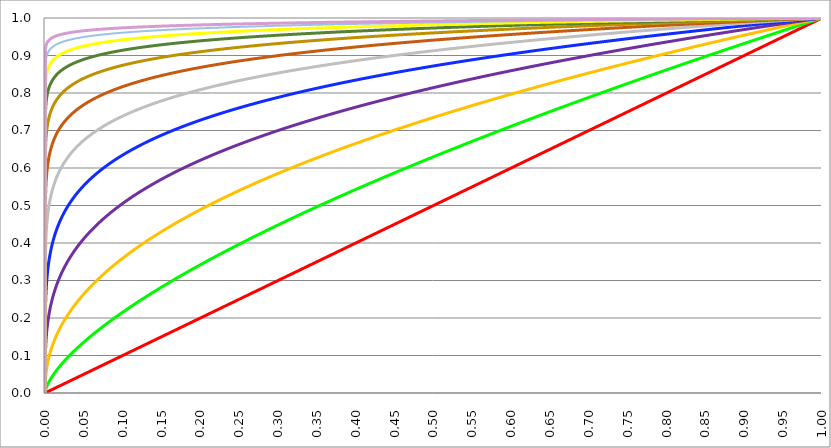
| Category | Series 0 | Series 3 | Series 4 | Series 5 | Series 2 | Series 6 | Series 7 | Series 8 | Series 9 | Series 10 | Series 11 | Series 12 |
|---|---|---|---|---|---|---|---|---|---|---|---|---|
| 0.0 | 0 | 0 | 0 | 0 | 0 | 0 | 0 | 0 | 0 | 0 | 0 | 0 |
| 0.0005 | 0 | 0.006 | 0.034 | 0.105 | 0.223 | 0.368 | 0.513 | 0.641 | 0.743 | 0.821 | 0.877 | 0.916 |
| 0.001 | 0.001 | 0.01 | 0.046 | 0.129 | 0.256 | 0.403 | 0.545 | 0.667 | 0.764 | 0.836 | 0.887 | 0.923 |
| 0.0015 | 0.002 | 0.013 | 0.056 | 0.146 | 0.277 | 0.425 | 0.565 | 0.683 | 0.776 | 0.844 | 0.893 | 0.928 |
| 0.002 | 0.002 | 0.016 | 0.063 | 0.159 | 0.293 | 0.441 | 0.579 | 0.695 | 0.785 | 0.851 | 0.898 | 0.931 |
| 0.0025 | 0.002 | 0.018 | 0.07 | 0.169 | 0.306 | 0.454 | 0.591 | 0.704 | 0.792 | 0.856 | 0.901 | 0.933 |
| 0.003 | 0.003 | 0.021 | 0.076 | 0.179 | 0.317 | 0.465 | 0.6 | 0.712 | 0.797 | 0.86 | 0.904 | 0.935 |
| 0.0035 | 0.004 | 0.023 | 0.081 | 0.187 | 0.327 | 0.475 | 0.609 | 0.718 | 0.802 | 0.863 | 0.907 | 0.937 |
| 0.004 | 0.004 | 0.025 | 0.086 | 0.195 | 0.336 | 0.483 | 0.616 | 0.724 | 0.806 | 0.866 | 0.909 | 0.938 |
| 0.0045 | 0.004 | 0.027 | 0.091 | 0.202 | 0.344 | 0.491 | 0.622 | 0.729 | 0.81 | 0.869 | 0.911 | 0.939 |
| 0.005 | 0.005 | 0.029 | 0.095 | 0.208 | 0.351 | 0.498 | 0.628 | 0.733 | 0.813 | 0.871 | 0.912 | 0.941 |
| 0.0055 | 0.006 | 0.031 | 0.099 | 0.214 | 0.358 | 0.504 | 0.633 | 0.737 | 0.816 | 0.873 | 0.914 | 0.942 |
| 0.006 | 0.006 | 0.033 | 0.103 | 0.22 | 0.364 | 0.51 | 0.638 | 0.741 | 0.819 | 0.875 | 0.915 | 0.943 |
| 0.0065 | 0.006 | 0.035 | 0.107 | 0.225 | 0.37 | 0.515 | 0.643 | 0.745 | 0.822 | 0.877 | 0.916 | 0.943 |
| 0.007 | 0.007 | 0.037 | 0.11 | 0.23 | 0.375 | 0.52 | 0.647 | 0.748 | 0.824 | 0.879 | 0.918 | 0.944 |
| 0.0075 | 0.008 | 0.038 | 0.114 | 0.235 | 0.38 | 0.525 | 0.651 | 0.751 | 0.826 | 0.88 | 0.919 | 0.945 |
| 0.008 | 0.008 | 0.04 | 0.117 | 0.239 | 0.385 | 0.529 | 0.654 | 0.754 | 0.828 | 0.882 | 0.92 | 0.946 |
| 0.0085 | 0.008 | 0.042 | 0.12 | 0.243 | 0.39 | 0.534 | 0.658 | 0.757 | 0.83 | 0.883 | 0.921 | 0.946 |
| 0.009 | 0.009 | 0.043 | 0.123 | 0.248 | 0.394 | 0.538 | 0.661 | 0.759 | 0.832 | 0.885 | 0.922 | 0.947 |
| 0.0095 | 0.01 | 0.045 | 0.126 | 0.252 | 0.399 | 0.542 | 0.664 | 0.761 | 0.834 | 0.886 | 0.922 | 0.948 |
| 0.01 | 0.01 | 0.046 | 0.129 | 0.256 | 0.403 | 0.545 | 0.667 | 0.764 | 0.836 | 0.887 | 0.923 | 0.948 |
| 0.0105 | 0.01 | 0.048 | 0.132 | 0.259 | 0.407 | 0.549 | 0.67 | 0.766 | 0.837 | 0.888 | 0.924 | 0.949 |
| 0.011 | 0.011 | 0.049 | 0.135 | 0.263 | 0.41 | 0.552 | 0.673 | 0.768 | 0.839 | 0.889 | 0.925 | 0.949 |
| 0.0115 | 0.012 | 0.051 | 0.137 | 0.266 | 0.414 | 0.555 | 0.676 | 0.77 | 0.84 | 0.89 | 0.925 | 0.95 |
| 0.012 | 0.012 | 0.052 | 0.14 | 0.27 | 0.417 | 0.559 | 0.678 | 0.772 | 0.841 | 0.891 | 0.926 | 0.95 |
| 0.0125 | 0.012 | 0.054 | 0.143 | 0.273 | 0.421 | 0.562 | 0.681 | 0.774 | 0.843 | 0.892 | 0.927 | 0.951 |
| 0.013 | 0.013 | 0.055 | 0.145 | 0.276 | 0.424 | 0.564 | 0.683 | 0.776 | 0.844 | 0.893 | 0.927 | 0.951 |
| 0.0135 | 0.014 | 0.057 | 0.148 | 0.279 | 0.427 | 0.567 | 0.685 | 0.777 | 0.845 | 0.894 | 0.928 | 0.951 |
| 0.014 | 0.014 | 0.058 | 0.15 | 0.282 | 0.43 | 0.57 | 0.687 | 0.779 | 0.847 | 0.895 | 0.929 | 0.952 |
| 0.0145 | 0.014 | 0.059 | 0.152 | 0.285 | 0.433 | 0.573 | 0.69 | 0.781 | 0.848 | 0.896 | 0.929 | 0.952 |
| 0.015 | 0.015 | 0.061 | 0.155 | 0.288 | 0.436 | 0.575 | 0.692 | 0.782 | 0.849 | 0.897 | 0.93 | 0.953 |
| 0.0155 | 0.016 | 0.062 | 0.157 | 0.291 | 0.439 | 0.578 | 0.694 | 0.784 | 0.85 | 0.897 | 0.93 | 0.953 |
| 0.016 | 0.016 | 0.063 | 0.159 | 0.294 | 0.442 | 0.58 | 0.696 | 0.785 | 0.851 | 0.898 | 0.931 | 0.953 |
| 0.0165 | 0.016 | 0.065 | 0.161 | 0.296 | 0.445 | 0.582 | 0.697 | 0.786 | 0.852 | 0.899 | 0.931 | 0.954 |
| 0.017 | 0.017 | 0.066 | 0.164 | 0.299 | 0.447 | 0.585 | 0.699 | 0.788 | 0.853 | 0.899 | 0.932 | 0.954 |
| 0.0175 | 0.018 | 0.067 | 0.166 | 0.302 | 0.45 | 0.587 | 0.701 | 0.789 | 0.854 | 0.9 | 0.932 | 0.954 |
| 0.018 | 0.018 | 0.069 | 0.168 | 0.304 | 0.452 | 0.589 | 0.703 | 0.79 | 0.855 | 0.901 | 0.933 | 0.955 |
| 0.0185 | 0.018 | 0.07 | 0.17 | 0.307 | 0.455 | 0.591 | 0.704 | 0.792 | 0.856 | 0.901 | 0.933 | 0.955 |
| 0.019 | 0.019 | 0.071 | 0.172 | 0.309 | 0.457 | 0.593 | 0.706 | 0.793 | 0.857 | 0.902 | 0.934 | 0.955 |
| 0.0195 | 0.02 | 0.072 | 0.174 | 0.311 | 0.459 | 0.595 | 0.708 | 0.794 | 0.858 | 0.903 | 0.934 | 0.956 |
| 0.02 | 0.02 | 0.074 | 0.176 | 0.314 | 0.462 | 0.597 | 0.709 | 0.795 | 0.858 | 0.903 | 0.934 | 0.956 |
| 0.0205 | 0.02 | 0.075 | 0.178 | 0.316 | 0.464 | 0.599 | 0.711 | 0.797 | 0.859 | 0.904 | 0.935 | 0.956 |
| 0.021 | 0.021 | 0.076 | 0.18 | 0.318 | 0.466 | 0.601 | 0.712 | 0.798 | 0.86 | 0.904 | 0.935 | 0.956 |
| 0.0215 | 0.022 | 0.077 | 0.181 | 0.321 | 0.468 | 0.603 | 0.714 | 0.799 | 0.861 | 0.905 | 0.936 | 0.957 |
| 0.022 | 0.022 | 0.079 | 0.183 | 0.323 | 0.471 | 0.605 | 0.715 | 0.8 | 0.862 | 0.905 | 0.936 | 0.957 |
| 0.0225 | 0.022 | 0.08 | 0.185 | 0.325 | 0.473 | 0.607 | 0.717 | 0.801 | 0.862 | 0.906 | 0.936 | 0.957 |
| 0.023 | 0.023 | 0.081 | 0.187 | 0.327 | 0.475 | 0.608 | 0.718 | 0.802 | 0.863 | 0.907 | 0.937 | 0.957 |
| 0.0235 | 0.024 | 0.082 | 0.189 | 0.329 | 0.477 | 0.61 | 0.719 | 0.803 | 0.864 | 0.907 | 0.937 | 0.958 |
| 0.024 | 0.024 | 0.083 | 0.191 | 0.331 | 0.479 | 0.612 | 0.721 | 0.804 | 0.865 | 0.908 | 0.937 | 0.958 |
| 0.0245 | 0.024 | 0.084 | 0.192 | 0.333 | 0.481 | 0.614 | 0.722 | 0.805 | 0.865 | 0.908 | 0.938 | 0.958 |
| 0.025 | 0.025 | 0.085 | 0.194 | 0.335 | 0.483 | 0.615 | 0.723 | 0.806 | 0.866 | 0.909 | 0.938 | 0.958 |
| 0.0255 | 0.026 | 0.087 | 0.196 | 0.337 | 0.484 | 0.617 | 0.725 | 0.807 | 0.867 | 0.909 | 0.938 | 0.958 |
| 0.026 | 0.026 | 0.088 | 0.197 | 0.339 | 0.486 | 0.618 | 0.726 | 0.808 | 0.867 | 0.909 | 0.939 | 0.959 |
| 0.0265 | 0.026 | 0.089 | 0.199 | 0.341 | 0.488 | 0.62 | 0.727 | 0.809 | 0.868 | 0.91 | 0.939 | 0.959 |
| 0.027 | 0.027 | 0.09 | 0.201 | 0.343 | 0.49 | 0.621 | 0.728 | 0.809 | 0.869 | 0.91 | 0.939 | 0.959 |
| 0.0275 | 0.028 | 0.091 | 0.202 | 0.345 | 0.492 | 0.623 | 0.729 | 0.81 | 0.869 | 0.911 | 0.94 | 0.959 |
| 0.028 | 0.028 | 0.092 | 0.204 | 0.347 | 0.493 | 0.624 | 0.731 | 0.811 | 0.87 | 0.911 | 0.94 | 0.96 |
| 0.0285 | 0.028 | 0.093 | 0.206 | 0.348 | 0.495 | 0.626 | 0.732 | 0.812 | 0.87 | 0.912 | 0.94 | 0.96 |
| 0.029 | 0.029 | 0.094 | 0.207 | 0.35 | 0.497 | 0.627 | 0.733 | 0.813 | 0.871 | 0.912 | 0.94 | 0.96 |
| 0.0295 | 0.03 | 0.095 | 0.209 | 0.352 | 0.499 | 0.629 | 0.734 | 0.814 | 0.872 | 0.912 | 0.941 | 0.96 |
| 0.03 | 0.03 | 0.097 | 0.21 | 0.354 | 0.5 | 0.63 | 0.735 | 0.814 | 0.872 | 0.913 | 0.941 | 0.96 |
| 0.0305 | 0.03 | 0.098 | 0.212 | 0.356 | 0.502 | 0.632 | 0.736 | 0.815 | 0.873 | 0.913 | 0.941 | 0.96 |
| 0.031 | 0.031 | 0.099 | 0.214 | 0.357 | 0.503 | 0.633 | 0.737 | 0.816 | 0.873 | 0.914 | 0.942 | 0.961 |
| 0.0315 | 0.032 | 0.1 | 0.215 | 0.359 | 0.505 | 0.634 | 0.738 | 0.817 | 0.874 | 0.914 | 0.942 | 0.961 |
| 0.032 | 0.032 | 0.101 | 0.217 | 0.361 | 0.507 | 0.636 | 0.739 | 0.818 | 0.874 | 0.914 | 0.942 | 0.961 |
| 0.0325 | 0.032 | 0.102 | 0.218 | 0.362 | 0.508 | 0.637 | 0.74 | 0.818 | 0.875 | 0.915 | 0.942 | 0.961 |
| 0.033 | 0.033 | 0.103 | 0.22 | 0.364 | 0.51 | 0.638 | 0.741 | 0.819 | 0.875 | 0.915 | 0.943 | 0.961 |
| 0.0335 | 0.034 | 0.104 | 0.221 | 0.366 | 0.511 | 0.639 | 0.742 | 0.82 | 0.876 | 0.915 | 0.943 | 0.961 |
| 0.034 | 0.034 | 0.105 | 0.222 | 0.367 | 0.513 | 0.641 | 0.743 | 0.82 | 0.876 | 0.916 | 0.943 | 0.962 |
| 0.0345 | 0.034 | 0.106 | 0.224 | 0.369 | 0.514 | 0.642 | 0.744 | 0.821 | 0.877 | 0.916 | 0.943 | 0.962 |
| 0.035 | 0.035 | 0.107 | 0.225 | 0.37 | 0.516 | 0.643 | 0.745 | 0.822 | 0.877 | 0.916 | 0.944 | 0.962 |
| 0.0355 | 0.036 | 0.108 | 0.227 | 0.372 | 0.517 | 0.644 | 0.746 | 0.823 | 0.878 | 0.917 | 0.944 | 0.962 |
| 0.036 | 0.036 | 0.109 | 0.228 | 0.373 | 0.519 | 0.645 | 0.747 | 0.823 | 0.878 | 0.917 | 0.944 | 0.962 |
| 0.0365 | 0.036 | 0.11 | 0.23 | 0.375 | 0.52 | 0.647 | 0.748 | 0.824 | 0.879 | 0.917 | 0.944 | 0.962 |
| 0.037 | 0.037 | 0.111 | 0.231 | 0.376 | 0.521 | 0.648 | 0.749 | 0.825 | 0.879 | 0.918 | 0.944 | 0.963 |
| 0.0375 | 0.038 | 0.112 | 0.232 | 0.378 | 0.523 | 0.649 | 0.75 | 0.825 | 0.88 | 0.918 | 0.945 | 0.963 |
| 0.038 | 0.038 | 0.113 | 0.234 | 0.379 | 0.524 | 0.65 | 0.75 | 0.826 | 0.88 | 0.918 | 0.945 | 0.963 |
| 0.0385 | 0.038 | 0.114 | 0.235 | 0.381 | 0.526 | 0.651 | 0.751 | 0.826 | 0.881 | 0.919 | 0.945 | 0.963 |
| 0.039 | 0.039 | 0.115 | 0.236 | 0.382 | 0.527 | 0.652 | 0.752 | 0.827 | 0.881 | 0.919 | 0.945 | 0.963 |
| 0.0395 | 0.04 | 0.116 | 0.238 | 0.384 | 0.528 | 0.653 | 0.753 | 0.828 | 0.882 | 0.919 | 0.946 | 0.963 |
| 0.04 | 0.04 | 0.117 | 0.239 | 0.385 | 0.529 | 0.654 | 0.754 | 0.828 | 0.882 | 0.92 | 0.946 | 0.963 |
| 0.0405 | 0.04 | 0.118 | 0.24 | 0.387 | 0.531 | 0.656 | 0.755 | 0.829 | 0.882 | 0.92 | 0.946 | 0.964 |
| 0.041 | 0.041 | 0.119 | 0.242 | 0.388 | 0.532 | 0.657 | 0.755 | 0.829 | 0.883 | 0.92 | 0.946 | 0.964 |
| 0.0415 | 0.042 | 0.12 | 0.243 | 0.39 | 0.533 | 0.658 | 0.756 | 0.83 | 0.883 | 0.921 | 0.946 | 0.964 |
| 0.042 | 0.042 | 0.121 | 0.244 | 0.391 | 0.535 | 0.659 | 0.757 | 0.831 | 0.884 | 0.921 | 0.947 | 0.964 |
| 0.0425 | 0.042 | 0.122 | 0.246 | 0.392 | 0.536 | 0.66 | 0.758 | 0.831 | 0.884 | 0.921 | 0.947 | 0.964 |
| 0.043 | 0.043 | 0.123 | 0.247 | 0.394 | 0.537 | 0.661 | 0.759 | 0.832 | 0.884 | 0.921 | 0.947 | 0.964 |
| 0.0435 | 0.044 | 0.124 | 0.248 | 0.395 | 0.538 | 0.662 | 0.759 | 0.832 | 0.885 | 0.922 | 0.947 | 0.964 |
| 0.044 | 0.044 | 0.125 | 0.25 | 0.396 | 0.54 | 0.663 | 0.76 | 0.833 | 0.885 | 0.922 | 0.947 | 0.965 |
| 0.0445 | 0.044 | 0.126 | 0.251 | 0.398 | 0.541 | 0.664 | 0.761 | 0.833 | 0.886 | 0.922 | 0.947 | 0.965 |
| 0.045 | 0.045 | 0.127 | 0.252 | 0.399 | 0.542 | 0.665 | 0.762 | 0.834 | 0.886 | 0.923 | 0.948 | 0.965 |
| 0.0455 | 0.046 | 0.127 | 0.253 | 0.4 | 0.543 | 0.666 | 0.762 | 0.835 | 0.886 | 0.923 | 0.948 | 0.965 |
| 0.046 | 0.046 | 0.128 | 0.254 | 0.402 | 0.544 | 0.667 | 0.763 | 0.835 | 0.887 | 0.923 | 0.948 | 0.965 |
| 0.0465 | 0.046 | 0.129 | 0.256 | 0.403 | 0.545 | 0.668 | 0.764 | 0.836 | 0.887 | 0.923 | 0.948 | 0.965 |
| 0.047 | 0.047 | 0.13 | 0.257 | 0.404 | 0.547 | 0.669 | 0.765 | 0.836 | 0.888 | 0.924 | 0.948 | 0.965 |
| 0.0475 | 0.048 | 0.131 | 0.258 | 0.405 | 0.548 | 0.669 | 0.765 | 0.837 | 0.888 | 0.924 | 0.949 | 0.965 |
| 0.048 | 0.048 | 0.132 | 0.259 | 0.407 | 0.549 | 0.67 | 0.766 | 0.837 | 0.888 | 0.924 | 0.949 | 0.966 |
| 0.0485 | 0.048 | 0.133 | 0.261 | 0.408 | 0.55 | 0.671 | 0.767 | 0.838 | 0.889 | 0.924 | 0.949 | 0.966 |
| 0.049 | 0.049 | 0.134 | 0.262 | 0.409 | 0.551 | 0.672 | 0.767 | 0.838 | 0.889 | 0.925 | 0.949 | 0.966 |
| 0.0495 | 0.05 | 0.135 | 0.263 | 0.41 | 0.552 | 0.673 | 0.768 | 0.839 | 0.889 | 0.925 | 0.949 | 0.966 |
| 0.05 | 0.05 | 0.136 | 0.264 | 0.412 | 0.553 | 0.674 | 0.769 | 0.839 | 0.89 | 0.925 | 0.949 | 0.966 |
| 0.0505 | 0.05 | 0.137 | 0.265 | 0.413 | 0.554 | 0.675 | 0.769 | 0.84 | 0.89 | 0.925 | 0.95 | 0.966 |
| 0.051 | 0.051 | 0.138 | 0.266 | 0.414 | 0.556 | 0.676 | 0.77 | 0.84 | 0.89 | 0.926 | 0.95 | 0.966 |
| 0.0515 | 0.052 | 0.138 | 0.268 | 0.415 | 0.557 | 0.677 | 0.771 | 0.841 | 0.891 | 0.926 | 0.95 | 0.966 |
| 0.052 | 0.052 | 0.139 | 0.269 | 0.416 | 0.558 | 0.678 | 0.771 | 0.841 | 0.891 | 0.926 | 0.95 | 0.966 |
| 0.0525 | 0.052 | 0.14 | 0.27 | 0.418 | 0.559 | 0.678 | 0.772 | 0.842 | 0.891 | 0.926 | 0.95 | 0.967 |
| 0.053 | 0.053 | 0.141 | 0.271 | 0.419 | 0.56 | 0.679 | 0.773 | 0.842 | 0.892 | 0.926 | 0.95 | 0.967 |
| 0.0535 | 0.054 | 0.142 | 0.272 | 0.42 | 0.561 | 0.68 | 0.773 | 0.843 | 0.892 | 0.927 | 0.95 | 0.967 |
| 0.054 | 0.054 | 0.143 | 0.273 | 0.421 | 0.562 | 0.681 | 0.774 | 0.843 | 0.892 | 0.927 | 0.951 | 0.967 |
| 0.0545 | 0.054 | 0.144 | 0.274 | 0.422 | 0.563 | 0.682 | 0.775 | 0.843 | 0.893 | 0.927 | 0.951 | 0.967 |
| 0.055 | 0.055 | 0.145 | 0.276 | 0.423 | 0.564 | 0.683 | 0.775 | 0.844 | 0.893 | 0.927 | 0.951 | 0.967 |
| 0.0555 | 0.056 | 0.145 | 0.277 | 0.425 | 0.565 | 0.683 | 0.776 | 0.844 | 0.893 | 0.928 | 0.951 | 0.967 |
| 0.056 | 0.056 | 0.146 | 0.278 | 0.426 | 0.566 | 0.684 | 0.776 | 0.845 | 0.894 | 0.928 | 0.951 | 0.967 |
| 0.0565 | 0.056 | 0.147 | 0.279 | 0.427 | 0.567 | 0.685 | 0.777 | 0.845 | 0.894 | 0.928 | 0.951 | 0.967 |
| 0.057 | 0.057 | 0.148 | 0.28 | 0.428 | 0.568 | 0.686 | 0.778 | 0.846 | 0.894 | 0.928 | 0.952 | 0.967 |
| 0.0575 | 0.058 | 0.149 | 0.281 | 0.429 | 0.569 | 0.687 | 0.778 | 0.846 | 0.895 | 0.928 | 0.952 | 0.968 |
| 0.058 | 0.058 | 0.15 | 0.282 | 0.43 | 0.57 | 0.687 | 0.779 | 0.846 | 0.895 | 0.929 | 0.952 | 0.968 |
| 0.0585 | 0.058 | 0.151 | 0.283 | 0.431 | 0.571 | 0.688 | 0.779 | 0.847 | 0.895 | 0.929 | 0.952 | 0.968 |
| 0.059 | 0.059 | 0.152 | 0.284 | 0.432 | 0.572 | 0.689 | 0.78 | 0.847 | 0.895 | 0.929 | 0.952 | 0.968 |
| 0.0595 | 0.06 | 0.152 | 0.285 | 0.433 | 0.573 | 0.69 | 0.781 | 0.848 | 0.896 | 0.929 | 0.952 | 0.968 |
| 0.06 | 0.06 | 0.153 | 0.286 | 0.434 | 0.574 | 0.69 | 0.781 | 0.848 | 0.896 | 0.929 | 0.952 | 0.968 |
| 0.0605 | 0.06 | 0.154 | 0.287 | 0.436 | 0.575 | 0.691 | 0.782 | 0.849 | 0.896 | 0.93 | 0.953 | 0.968 |
| 0.061 | 0.061 | 0.155 | 0.289 | 0.437 | 0.576 | 0.692 | 0.782 | 0.849 | 0.897 | 0.93 | 0.953 | 0.968 |
| 0.0615 | 0.062 | 0.156 | 0.29 | 0.438 | 0.576 | 0.693 | 0.783 | 0.849 | 0.897 | 0.93 | 0.953 | 0.968 |
| 0.062 | 0.062 | 0.157 | 0.291 | 0.439 | 0.577 | 0.693 | 0.783 | 0.85 | 0.897 | 0.93 | 0.953 | 0.968 |
| 0.0625 | 0.062 | 0.157 | 0.292 | 0.44 | 0.578 | 0.694 | 0.784 | 0.85 | 0.897 | 0.93 | 0.953 | 0.968 |
| 0.063 | 0.063 | 0.158 | 0.293 | 0.441 | 0.579 | 0.695 | 0.784 | 0.851 | 0.898 | 0.931 | 0.953 | 0.969 |
| 0.0635 | 0.064 | 0.159 | 0.294 | 0.442 | 0.58 | 0.696 | 0.785 | 0.851 | 0.898 | 0.931 | 0.953 | 0.969 |
| 0.064 | 0.064 | 0.16 | 0.295 | 0.443 | 0.581 | 0.696 | 0.786 | 0.851 | 0.898 | 0.931 | 0.953 | 0.969 |
| 0.0645 | 0.064 | 0.161 | 0.296 | 0.444 | 0.582 | 0.697 | 0.786 | 0.852 | 0.899 | 0.931 | 0.954 | 0.969 |
| 0.065 | 0.065 | 0.162 | 0.297 | 0.445 | 0.583 | 0.698 | 0.787 | 0.852 | 0.899 | 0.931 | 0.954 | 0.969 |
| 0.0655 | 0.066 | 0.162 | 0.298 | 0.446 | 0.584 | 0.698 | 0.787 | 0.853 | 0.899 | 0.932 | 0.954 | 0.969 |
| 0.066 | 0.066 | 0.163 | 0.299 | 0.447 | 0.585 | 0.699 | 0.788 | 0.853 | 0.899 | 0.932 | 0.954 | 0.969 |
| 0.0665 | 0.066 | 0.164 | 0.3 | 0.448 | 0.585 | 0.7 | 0.788 | 0.853 | 0.9 | 0.932 | 0.954 | 0.969 |
| 0.067 | 0.067 | 0.165 | 0.301 | 0.449 | 0.586 | 0.701 | 0.789 | 0.854 | 0.9 | 0.932 | 0.954 | 0.969 |
| 0.0675 | 0.068 | 0.166 | 0.302 | 0.45 | 0.587 | 0.701 | 0.789 | 0.854 | 0.9 | 0.932 | 0.954 | 0.969 |
| 0.068 | 0.068 | 0.167 | 0.303 | 0.451 | 0.588 | 0.702 | 0.79 | 0.854 | 0.9 | 0.932 | 0.954 | 0.969 |
| 0.0685 | 0.068 | 0.167 | 0.304 | 0.452 | 0.589 | 0.703 | 0.79 | 0.855 | 0.901 | 0.933 | 0.955 | 0.969 |
| 0.069 | 0.069 | 0.168 | 0.305 | 0.453 | 0.59 | 0.703 | 0.791 | 0.855 | 0.901 | 0.933 | 0.955 | 0.97 |
| 0.0695 | 0.07 | 0.169 | 0.306 | 0.454 | 0.591 | 0.704 | 0.791 | 0.856 | 0.901 | 0.933 | 0.955 | 0.97 |
| 0.07 | 0.07 | 0.17 | 0.307 | 0.455 | 0.591 | 0.705 | 0.792 | 0.856 | 0.901 | 0.933 | 0.955 | 0.97 |
| 0.0705 | 0.07 | 0.171 | 0.308 | 0.456 | 0.592 | 0.705 | 0.792 | 0.856 | 0.902 | 0.933 | 0.955 | 0.97 |
| 0.071 | 0.071 | 0.171 | 0.309 | 0.457 | 0.593 | 0.706 | 0.793 | 0.857 | 0.902 | 0.934 | 0.955 | 0.97 |
| 0.0715 | 0.072 | 0.172 | 0.31 | 0.458 | 0.594 | 0.707 | 0.793 | 0.857 | 0.902 | 0.934 | 0.955 | 0.97 |
| 0.072 | 0.072 | 0.173 | 0.311 | 0.459 | 0.595 | 0.707 | 0.794 | 0.857 | 0.902 | 0.934 | 0.955 | 0.97 |
| 0.0725 | 0.072 | 0.174 | 0.312 | 0.46 | 0.595 | 0.708 | 0.794 | 0.858 | 0.903 | 0.934 | 0.956 | 0.97 |
| 0.073 | 0.073 | 0.175 | 0.312 | 0.46 | 0.596 | 0.708 | 0.795 | 0.858 | 0.903 | 0.934 | 0.956 | 0.97 |
| 0.0735 | 0.074 | 0.175 | 0.313 | 0.461 | 0.597 | 0.709 | 0.795 | 0.858 | 0.903 | 0.934 | 0.956 | 0.97 |
| 0.074 | 0.074 | 0.176 | 0.314 | 0.462 | 0.598 | 0.71 | 0.796 | 0.859 | 0.903 | 0.935 | 0.956 | 0.97 |
| 0.0745 | 0.074 | 0.177 | 0.315 | 0.463 | 0.599 | 0.71 | 0.796 | 0.859 | 0.904 | 0.935 | 0.956 | 0.97 |
| 0.075 | 0.075 | 0.178 | 0.316 | 0.464 | 0.6 | 0.711 | 0.797 | 0.859 | 0.904 | 0.935 | 0.956 | 0.97 |
| 0.0755 | 0.076 | 0.179 | 0.317 | 0.465 | 0.6 | 0.712 | 0.797 | 0.86 | 0.904 | 0.935 | 0.956 | 0.971 |
| 0.076 | 0.076 | 0.179 | 0.318 | 0.466 | 0.601 | 0.712 | 0.798 | 0.86 | 0.904 | 0.935 | 0.956 | 0.971 |
| 0.0765 | 0.076 | 0.18 | 0.319 | 0.467 | 0.602 | 0.713 | 0.798 | 0.86 | 0.905 | 0.935 | 0.956 | 0.971 |
| 0.077 | 0.077 | 0.181 | 0.32 | 0.468 | 0.603 | 0.713 | 0.798 | 0.861 | 0.905 | 0.935 | 0.957 | 0.971 |
| 0.0775 | 0.078 | 0.182 | 0.321 | 0.469 | 0.603 | 0.714 | 0.799 | 0.861 | 0.905 | 0.936 | 0.957 | 0.971 |
| 0.078 | 0.078 | 0.183 | 0.322 | 0.47 | 0.604 | 0.715 | 0.799 | 0.861 | 0.905 | 0.936 | 0.957 | 0.971 |
| 0.0785 | 0.078 | 0.183 | 0.323 | 0.47 | 0.605 | 0.715 | 0.8 | 0.862 | 0.905 | 0.936 | 0.957 | 0.971 |
| 0.079 | 0.079 | 0.184 | 0.324 | 0.471 | 0.606 | 0.716 | 0.8 | 0.862 | 0.906 | 0.936 | 0.957 | 0.971 |
| 0.0795 | 0.08 | 0.185 | 0.325 | 0.472 | 0.606 | 0.716 | 0.801 | 0.862 | 0.906 | 0.936 | 0.957 | 0.971 |
| 0.08 | 0.08 | 0.186 | 0.325 | 0.473 | 0.607 | 0.717 | 0.801 | 0.863 | 0.906 | 0.936 | 0.957 | 0.971 |
| 0.0805 | 0.08 | 0.186 | 0.326 | 0.474 | 0.608 | 0.718 | 0.802 | 0.863 | 0.906 | 0.937 | 0.957 | 0.971 |
| 0.081 | 0.081 | 0.187 | 0.327 | 0.475 | 0.609 | 0.718 | 0.802 | 0.863 | 0.907 | 0.937 | 0.957 | 0.971 |
| 0.0815 | 0.082 | 0.188 | 0.328 | 0.476 | 0.609 | 0.719 | 0.802 | 0.864 | 0.907 | 0.937 | 0.957 | 0.971 |
| 0.082 | 0.082 | 0.189 | 0.329 | 0.477 | 0.61 | 0.719 | 0.803 | 0.864 | 0.907 | 0.937 | 0.958 | 0.971 |
| 0.0825 | 0.082 | 0.19 | 0.33 | 0.477 | 0.611 | 0.72 | 0.803 | 0.864 | 0.907 | 0.937 | 0.958 | 0.972 |
| 0.083 | 0.083 | 0.19 | 0.331 | 0.478 | 0.612 | 0.721 | 0.804 | 0.864 | 0.907 | 0.937 | 0.958 | 0.972 |
| 0.0835 | 0.084 | 0.191 | 0.332 | 0.479 | 0.612 | 0.721 | 0.804 | 0.865 | 0.908 | 0.937 | 0.958 | 0.972 |
| 0.084 | 0.084 | 0.192 | 0.333 | 0.48 | 0.613 | 0.722 | 0.805 | 0.865 | 0.908 | 0.938 | 0.958 | 0.972 |
| 0.0845 | 0.084 | 0.193 | 0.333 | 0.481 | 0.614 | 0.722 | 0.805 | 0.865 | 0.908 | 0.938 | 0.958 | 0.972 |
| 0.085 | 0.085 | 0.193 | 0.334 | 0.482 | 0.615 | 0.723 | 0.805 | 0.866 | 0.908 | 0.938 | 0.958 | 0.972 |
| 0.0855 | 0.086 | 0.194 | 0.335 | 0.483 | 0.615 | 0.723 | 0.806 | 0.866 | 0.909 | 0.938 | 0.958 | 0.972 |
| 0.086 | 0.086 | 0.195 | 0.336 | 0.483 | 0.616 | 0.724 | 0.806 | 0.866 | 0.909 | 0.938 | 0.958 | 0.972 |
| 0.0865 | 0.086 | 0.196 | 0.337 | 0.484 | 0.617 | 0.724 | 0.807 | 0.867 | 0.909 | 0.938 | 0.958 | 0.972 |
| 0.087 | 0.087 | 0.196 | 0.338 | 0.485 | 0.617 | 0.725 | 0.807 | 0.867 | 0.909 | 0.938 | 0.959 | 0.972 |
| 0.0875 | 0.088 | 0.197 | 0.339 | 0.486 | 0.618 | 0.726 | 0.807 | 0.867 | 0.909 | 0.939 | 0.959 | 0.972 |
| 0.088 | 0.088 | 0.198 | 0.34 | 0.487 | 0.619 | 0.726 | 0.808 | 0.867 | 0.91 | 0.939 | 0.959 | 0.972 |
| 0.0885 | 0.088 | 0.199 | 0.34 | 0.488 | 0.619 | 0.727 | 0.808 | 0.868 | 0.91 | 0.939 | 0.959 | 0.972 |
| 0.089 | 0.089 | 0.199 | 0.341 | 0.488 | 0.62 | 0.727 | 0.809 | 0.868 | 0.91 | 0.939 | 0.959 | 0.972 |
| 0.0895 | 0.09 | 0.2 | 0.342 | 0.489 | 0.621 | 0.728 | 0.809 | 0.868 | 0.91 | 0.939 | 0.959 | 0.972 |
| 0.09 | 0.09 | 0.201 | 0.343 | 0.49 | 0.621 | 0.728 | 0.809 | 0.869 | 0.91 | 0.939 | 0.959 | 0.973 |
| 0.0905 | 0.09 | 0.202 | 0.344 | 0.491 | 0.622 | 0.729 | 0.81 | 0.869 | 0.911 | 0.939 | 0.959 | 0.973 |
| 0.091 | 0.091 | 0.202 | 0.345 | 0.492 | 0.623 | 0.729 | 0.81 | 0.869 | 0.911 | 0.94 | 0.959 | 0.973 |
| 0.0915 | 0.092 | 0.203 | 0.345 | 0.492 | 0.624 | 0.73 | 0.811 | 0.869 | 0.911 | 0.94 | 0.959 | 0.973 |
| 0.092 | 0.092 | 0.204 | 0.346 | 0.493 | 0.624 | 0.73 | 0.811 | 0.87 | 0.911 | 0.94 | 0.959 | 0.973 |
| 0.0925 | 0.092 | 0.205 | 0.347 | 0.494 | 0.625 | 0.731 | 0.811 | 0.87 | 0.911 | 0.94 | 0.96 | 0.973 |
| 0.093 | 0.093 | 0.205 | 0.348 | 0.495 | 0.626 | 0.731 | 0.812 | 0.87 | 0.911 | 0.94 | 0.96 | 0.973 |
| 0.0935 | 0.094 | 0.206 | 0.349 | 0.496 | 0.626 | 0.732 | 0.812 | 0.87 | 0.912 | 0.94 | 0.96 | 0.973 |
| 0.094 | 0.094 | 0.207 | 0.35 | 0.496 | 0.627 | 0.732 | 0.813 | 0.871 | 0.912 | 0.94 | 0.96 | 0.973 |
| 0.0945 | 0.094 | 0.207 | 0.35 | 0.497 | 0.628 | 0.733 | 0.813 | 0.871 | 0.912 | 0.94 | 0.96 | 0.973 |
| 0.095 | 0.095 | 0.208 | 0.351 | 0.498 | 0.628 | 0.733 | 0.813 | 0.871 | 0.912 | 0.941 | 0.96 | 0.973 |
| 0.0955 | 0.096 | 0.209 | 0.352 | 0.499 | 0.629 | 0.734 | 0.814 | 0.872 | 0.912 | 0.941 | 0.96 | 0.973 |
| 0.096 | 0.096 | 0.21 | 0.353 | 0.499 | 0.629 | 0.734 | 0.814 | 0.872 | 0.913 | 0.941 | 0.96 | 0.973 |
| 0.0965 | 0.096 | 0.21 | 0.354 | 0.5 | 0.63 | 0.735 | 0.814 | 0.872 | 0.913 | 0.941 | 0.96 | 0.973 |
| 0.097 | 0.097 | 0.211 | 0.355 | 0.501 | 0.631 | 0.735 | 0.815 | 0.872 | 0.913 | 0.941 | 0.96 | 0.973 |
| 0.0975 | 0.098 | 0.212 | 0.355 | 0.502 | 0.631 | 0.736 | 0.815 | 0.873 | 0.913 | 0.941 | 0.96 | 0.973 |
| 0.098 | 0.098 | 0.213 | 0.356 | 0.502 | 0.632 | 0.736 | 0.816 | 0.873 | 0.913 | 0.941 | 0.961 | 0.974 |
| 0.0985 | 0.098 | 0.213 | 0.357 | 0.503 | 0.633 | 0.737 | 0.816 | 0.873 | 0.914 | 0.941 | 0.961 | 0.974 |
| 0.099 | 0.099 | 0.214 | 0.358 | 0.504 | 0.633 | 0.737 | 0.816 | 0.873 | 0.914 | 0.942 | 0.961 | 0.974 |
| 0.0995 | 0.1 | 0.215 | 0.359 | 0.505 | 0.634 | 0.738 | 0.817 | 0.874 | 0.914 | 0.942 | 0.961 | 0.974 |
| 0.1 | 0.1 | 0.215 | 0.359 | 0.505 | 0.635 | 0.738 | 0.817 | 0.874 | 0.914 | 0.942 | 0.961 | 0.974 |
| 0.1005 | 0.1 | 0.216 | 0.36 | 0.506 | 0.635 | 0.739 | 0.817 | 0.874 | 0.914 | 0.942 | 0.961 | 0.974 |
| 0.101 | 0.101 | 0.217 | 0.361 | 0.507 | 0.636 | 0.739 | 0.818 | 0.874 | 0.914 | 0.942 | 0.961 | 0.974 |
| 0.1015 | 0.102 | 0.218 | 0.362 | 0.508 | 0.636 | 0.74 | 0.818 | 0.875 | 0.915 | 0.942 | 0.961 | 0.974 |
| 0.102 | 0.102 | 0.218 | 0.363 | 0.508 | 0.637 | 0.74 | 0.818 | 0.875 | 0.915 | 0.942 | 0.961 | 0.974 |
| 0.1025 | 0.102 | 0.219 | 0.363 | 0.509 | 0.638 | 0.741 | 0.819 | 0.875 | 0.915 | 0.942 | 0.961 | 0.974 |
| 0.103 | 0.103 | 0.22 | 0.364 | 0.51 | 0.638 | 0.741 | 0.819 | 0.875 | 0.915 | 0.943 | 0.961 | 0.974 |
| 0.1035 | 0.104 | 0.22 | 0.365 | 0.511 | 0.639 | 0.742 | 0.819 | 0.876 | 0.915 | 0.943 | 0.961 | 0.974 |
| 0.104 | 0.104 | 0.221 | 0.366 | 0.511 | 0.639 | 0.742 | 0.82 | 0.876 | 0.915 | 0.943 | 0.962 | 0.974 |
| 0.1045 | 0.104 | 0.222 | 0.366 | 0.512 | 0.64 | 0.743 | 0.82 | 0.876 | 0.916 | 0.943 | 0.962 | 0.974 |
| 0.105 | 0.105 | 0.223 | 0.367 | 0.513 | 0.641 | 0.743 | 0.82 | 0.876 | 0.916 | 0.943 | 0.962 | 0.974 |
| 0.1055 | 0.106 | 0.223 | 0.368 | 0.514 | 0.641 | 0.744 | 0.821 | 0.877 | 0.916 | 0.943 | 0.962 | 0.974 |
| 0.106 | 0.106 | 0.224 | 0.369 | 0.514 | 0.642 | 0.744 | 0.821 | 0.877 | 0.916 | 0.943 | 0.962 | 0.974 |
| 0.1065 | 0.106 | 0.225 | 0.37 | 0.515 | 0.642 | 0.745 | 0.822 | 0.877 | 0.916 | 0.943 | 0.962 | 0.974 |
| 0.107 | 0.107 | 0.225 | 0.37 | 0.516 | 0.643 | 0.745 | 0.822 | 0.877 | 0.916 | 0.944 | 0.962 | 0.974 |
| 0.1075 | 0.108 | 0.226 | 0.371 | 0.516 | 0.644 | 0.746 | 0.822 | 0.878 | 0.917 | 0.944 | 0.962 | 0.975 |
| 0.108 | 0.108 | 0.227 | 0.372 | 0.517 | 0.644 | 0.746 | 0.823 | 0.878 | 0.917 | 0.944 | 0.962 | 0.975 |
| 0.1085 | 0.108 | 0.227 | 0.373 | 0.518 | 0.645 | 0.746 | 0.823 | 0.878 | 0.917 | 0.944 | 0.962 | 0.975 |
| 0.109 | 0.109 | 0.228 | 0.373 | 0.519 | 0.645 | 0.747 | 0.823 | 0.878 | 0.917 | 0.944 | 0.962 | 0.975 |
| 0.1095 | 0.11 | 0.229 | 0.374 | 0.519 | 0.646 | 0.747 | 0.824 | 0.879 | 0.917 | 0.944 | 0.962 | 0.975 |
| 0.11 | 0.11 | 0.23 | 0.375 | 0.52 | 0.647 | 0.748 | 0.824 | 0.879 | 0.917 | 0.944 | 0.962 | 0.975 |
| 0.1105 | 0.11 | 0.23 | 0.376 | 0.521 | 0.647 | 0.748 | 0.824 | 0.879 | 0.918 | 0.944 | 0.963 | 0.975 |
| 0.111 | 0.111 | 0.231 | 0.376 | 0.521 | 0.648 | 0.749 | 0.824 | 0.879 | 0.918 | 0.944 | 0.963 | 0.975 |
| 0.1115 | 0.112 | 0.232 | 0.377 | 0.522 | 0.648 | 0.749 | 0.825 | 0.88 | 0.918 | 0.945 | 0.963 | 0.975 |
| 0.112 | 0.112 | 0.232 | 0.378 | 0.523 | 0.649 | 0.75 | 0.825 | 0.88 | 0.918 | 0.945 | 0.963 | 0.975 |
| 0.1125 | 0.112 | 0.233 | 0.379 | 0.523 | 0.649 | 0.75 | 0.825 | 0.88 | 0.918 | 0.945 | 0.963 | 0.975 |
| 0.113 | 0.113 | 0.234 | 0.379 | 0.524 | 0.65 | 0.75 | 0.826 | 0.88 | 0.918 | 0.945 | 0.963 | 0.975 |
| 0.1135 | 0.114 | 0.234 | 0.38 | 0.525 | 0.651 | 0.751 | 0.826 | 0.88 | 0.919 | 0.945 | 0.963 | 0.975 |
| 0.114 | 0.114 | 0.235 | 0.381 | 0.525 | 0.651 | 0.751 | 0.826 | 0.881 | 0.919 | 0.945 | 0.963 | 0.975 |
| 0.1145 | 0.114 | 0.236 | 0.382 | 0.526 | 0.652 | 0.752 | 0.827 | 0.881 | 0.919 | 0.945 | 0.963 | 0.975 |
| 0.115 | 0.115 | 0.236 | 0.382 | 0.527 | 0.652 | 0.752 | 0.827 | 0.881 | 0.919 | 0.945 | 0.963 | 0.975 |
| 0.1155 | 0.116 | 0.237 | 0.383 | 0.528 | 0.653 | 0.753 | 0.827 | 0.881 | 0.919 | 0.945 | 0.963 | 0.975 |
| 0.116 | 0.116 | 0.238 | 0.384 | 0.528 | 0.653 | 0.753 | 0.828 | 0.882 | 0.919 | 0.946 | 0.963 | 0.975 |
| 0.1165 | 0.116 | 0.239 | 0.385 | 0.529 | 0.654 | 0.753 | 0.828 | 0.882 | 0.92 | 0.946 | 0.963 | 0.975 |
| 0.117 | 0.117 | 0.239 | 0.385 | 0.53 | 0.655 | 0.754 | 0.828 | 0.882 | 0.92 | 0.946 | 0.963 | 0.976 |
| 0.1175 | 0.118 | 0.24 | 0.386 | 0.53 | 0.655 | 0.754 | 0.829 | 0.882 | 0.92 | 0.946 | 0.964 | 0.976 |
| 0.118 | 0.118 | 0.241 | 0.387 | 0.531 | 0.656 | 0.755 | 0.829 | 0.882 | 0.92 | 0.946 | 0.964 | 0.976 |
| 0.1185 | 0.118 | 0.241 | 0.388 | 0.532 | 0.656 | 0.755 | 0.829 | 0.883 | 0.92 | 0.946 | 0.964 | 0.976 |
| 0.119 | 0.119 | 0.242 | 0.388 | 0.532 | 0.657 | 0.756 | 0.83 | 0.883 | 0.92 | 0.946 | 0.964 | 0.976 |
| 0.1195 | 0.12 | 0.243 | 0.389 | 0.533 | 0.657 | 0.756 | 0.83 | 0.883 | 0.92 | 0.946 | 0.964 | 0.976 |
| 0.12 | 0.12 | 0.243 | 0.39 | 0.534 | 0.658 | 0.756 | 0.83 | 0.883 | 0.921 | 0.946 | 0.964 | 0.976 |
| 0.1205 | 0.12 | 0.244 | 0.39 | 0.534 | 0.658 | 0.757 | 0.83 | 0.884 | 0.921 | 0.946 | 0.964 | 0.976 |
| 0.121 | 0.121 | 0.245 | 0.391 | 0.535 | 0.659 | 0.757 | 0.831 | 0.884 | 0.921 | 0.947 | 0.964 | 0.976 |
| 0.1215 | 0.122 | 0.245 | 0.392 | 0.536 | 0.659 | 0.758 | 0.831 | 0.884 | 0.921 | 0.947 | 0.964 | 0.976 |
| 0.122 | 0.122 | 0.246 | 0.393 | 0.536 | 0.66 | 0.758 | 0.831 | 0.884 | 0.921 | 0.947 | 0.964 | 0.976 |
| 0.1225 | 0.122 | 0.247 | 0.393 | 0.537 | 0.661 | 0.758 | 0.832 | 0.884 | 0.921 | 0.947 | 0.964 | 0.976 |
| 0.123 | 0.123 | 0.247 | 0.394 | 0.537 | 0.661 | 0.759 | 0.832 | 0.885 | 0.921 | 0.947 | 0.964 | 0.976 |
| 0.1235 | 0.124 | 0.248 | 0.395 | 0.538 | 0.662 | 0.759 | 0.832 | 0.885 | 0.922 | 0.947 | 0.964 | 0.976 |
| 0.124 | 0.124 | 0.249 | 0.395 | 0.539 | 0.662 | 0.76 | 0.833 | 0.885 | 0.922 | 0.947 | 0.964 | 0.976 |
| 0.1245 | 0.124 | 0.249 | 0.396 | 0.539 | 0.663 | 0.76 | 0.833 | 0.885 | 0.922 | 0.947 | 0.965 | 0.976 |
| 0.125 | 0.125 | 0.25 | 0.397 | 0.54 | 0.663 | 0.76 | 0.833 | 0.885 | 0.922 | 0.947 | 0.965 | 0.976 |
| 0.1255 | 0.126 | 0.251 | 0.398 | 0.541 | 0.664 | 0.761 | 0.833 | 0.886 | 0.922 | 0.947 | 0.965 | 0.976 |
| 0.126 | 0.126 | 0.251 | 0.398 | 0.541 | 0.664 | 0.761 | 0.834 | 0.886 | 0.922 | 0.948 | 0.965 | 0.976 |
| 0.1265 | 0.126 | 0.252 | 0.399 | 0.542 | 0.665 | 0.762 | 0.834 | 0.886 | 0.922 | 0.948 | 0.965 | 0.976 |
| 0.127 | 0.127 | 0.253 | 0.4 | 0.543 | 0.665 | 0.762 | 0.834 | 0.886 | 0.923 | 0.948 | 0.965 | 0.976 |
| 0.1275 | 0.128 | 0.253 | 0.4 | 0.543 | 0.666 | 0.762 | 0.835 | 0.886 | 0.923 | 0.948 | 0.965 | 0.976 |
| 0.128 | 0.128 | 0.254 | 0.401 | 0.544 | 0.666 | 0.763 | 0.835 | 0.887 | 0.923 | 0.948 | 0.965 | 0.977 |
| 0.1285 | 0.128 | 0.255 | 0.402 | 0.544 | 0.667 | 0.763 | 0.835 | 0.887 | 0.923 | 0.948 | 0.965 | 0.977 |
| 0.129 | 0.129 | 0.255 | 0.402 | 0.545 | 0.667 | 0.764 | 0.835 | 0.887 | 0.923 | 0.948 | 0.965 | 0.977 |
| 0.1295 | 0.13 | 0.256 | 0.403 | 0.546 | 0.668 | 0.764 | 0.836 | 0.887 | 0.923 | 0.948 | 0.965 | 0.977 |
| 0.13 | 0.13 | 0.257 | 0.404 | 0.546 | 0.668 | 0.764 | 0.836 | 0.887 | 0.923 | 0.948 | 0.965 | 0.977 |
| 0.1305 | 0.13 | 0.257 | 0.405 | 0.547 | 0.669 | 0.765 | 0.836 | 0.888 | 0.924 | 0.948 | 0.965 | 0.977 |
| 0.131 | 0.131 | 0.258 | 0.405 | 0.548 | 0.669 | 0.765 | 0.837 | 0.888 | 0.924 | 0.949 | 0.965 | 0.977 |
| 0.1315 | 0.132 | 0.259 | 0.406 | 0.548 | 0.67 | 0.766 | 0.837 | 0.888 | 0.924 | 0.949 | 0.965 | 0.977 |
| 0.132 | 0.132 | 0.259 | 0.407 | 0.549 | 0.67 | 0.766 | 0.837 | 0.888 | 0.924 | 0.949 | 0.965 | 0.977 |
| 0.1325 | 0.132 | 0.26 | 0.407 | 0.549 | 0.671 | 0.766 | 0.837 | 0.888 | 0.924 | 0.949 | 0.966 | 0.977 |
| 0.133 | 0.133 | 0.261 | 0.408 | 0.55 | 0.671 | 0.767 | 0.838 | 0.889 | 0.924 | 0.949 | 0.966 | 0.977 |
| 0.1335 | 0.134 | 0.261 | 0.409 | 0.551 | 0.672 | 0.767 | 0.838 | 0.889 | 0.924 | 0.949 | 0.966 | 0.977 |
| 0.134 | 0.134 | 0.262 | 0.409 | 0.551 | 0.672 | 0.767 | 0.838 | 0.889 | 0.925 | 0.949 | 0.966 | 0.977 |
| 0.1345 | 0.134 | 0.263 | 0.41 | 0.552 | 0.673 | 0.768 | 0.839 | 0.889 | 0.925 | 0.949 | 0.966 | 0.977 |
| 0.135 | 0.135 | 0.263 | 0.411 | 0.552 | 0.673 | 0.768 | 0.839 | 0.889 | 0.925 | 0.949 | 0.966 | 0.977 |
| 0.1355 | 0.136 | 0.264 | 0.411 | 0.553 | 0.674 | 0.769 | 0.839 | 0.89 | 0.925 | 0.949 | 0.966 | 0.977 |
| 0.136 | 0.136 | 0.264 | 0.412 | 0.554 | 0.674 | 0.769 | 0.839 | 0.89 | 0.925 | 0.949 | 0.966 | 0.977 |
| 0.1365 | 0.136 | 0.265 | 0.413 | 0.554 | 0.675 | 0.769 | 0.84 | 0.89 | 0.925 | 0.95 | 0.966 | 0.977 |
| 0.137 | 0.137 | 0.266 | 0.413 | 0.555 | 0.675 | 0.77 | 0.84 | 0.89 | 0.925 | 0.95 | 0.966 | 0.977 |
| 0.1375 | 0.138 | 0.266 | 0.414 | 0.555 | 0.676 | 0.77 | 0.84 | 0.89 | 0.926 | 0.95 | 0.966 | 0.977 |
| 0.138 | 0.138 | 0.267 | 0.415 | 0.556 | 0.676 | 0.77 | 0.84 | 0.891 | 0.926 | 0.95 | 0.966 | 0.977 |
| 0.1385 | 0.138 | 0.268 | 0.415 | 0.557 | 0.677 | 0.771 | 0.841 | 0.891 | 0.926 | 0.95 | 0.966 | 0.977 |
| 0.139 | 0.139 | 0.268 | 0.416 | 0.557 | 0.677 | 0.771 | 0.841 | 0.891 | 0.926 | 0.95 | 0.966 | 0.977 |
| 0.1395 | 0.14 | 0.269 | 0.417 | 0.558 | 0.678 | 0.772 | 0.841 | 0.891 | 0.926 | 0.95 | 0.966 | 0.977 |
| 0.14 | 0.14 | 0.27 | 0.417 | 0.558 | 0.678 | 0.772 | 0.841 | 0.891 | 0.926 | 0.95 | 0.966 | 0.978 |
| 0.1405 | 0.14 | 0.27 | 0.418 | 0.559 | 0.679 | 0.772 | 0.842 | 0.891 | 0.926 | 0.95 | 0.967 | 0.978 |
| 0.141 | 0.141 | 0.271 | 0.419 | 0.56 | 0.679 | 0.773 | 0.842 | 0.892 | 0.926 | 0.95 | 0.967 | 0.978 |
| 0.1415 | 0.142 | 0.272 | 0.419 | 0.56 | 0.68 | 0.773 | 0.842 | 0.892 | 0.927 | 0.95 | 0.967 | 0.978 |
| 0.142 | 0.142 | 0.272 | 0.42 | 0.561 | 0.68 | 0.773 | 0.843 | 0.892 | 0.927 | 0.95 | 0.967 | 0.978 |
| 0.1425 | 0.142 | 0.273 | 0.421 | 0.561 | 0.681 | 0.774 | 0.843 | 0.892 | 0.927 | 0.951 | 0.967 | 0.978 |
| 0.143 | 0.143 | 0.273 | 0.421 | 0.562 | 0.681 | 0.774 | 0.843 | 0.892 | 0.927 | 0.951 | 0.967 | 0.978 |
| 0.1435 | 0.144 | 0.274 | 0.422 | 0.563 | 0.681 | 0.774 | 0.843 | 0.893 | 0.927 | 0.951 | 0.967 | 0.978 |
| 0.144 | 0.144 | 0.275 | 0.423 | 0.563 | 0.682 | 0.775 | 0.844 | 0.893 | 0.927 | 0.951 | 0.967 | 0.978 |
| 0.1445 | 0.144 | 0.275 | 0.423 | 0.564 | 0.682 | 0.775 | 0.844 | 0.893 | 0.927 | 0.951 | 0.967 | 0.978 |
| 0.145 | 0.145 | 0.276 | 0.424 | 0.564 | 0.683 | 0.775 | 0.844 | 0.893 | 0.927 | 0.951 | 0.967 | 0.978 |
| 0.1455 | 0.146 | 0.277 | 0.425 | 0.565 | 0.683 | 0.776 | 0.844 | 0.893 | 0.928 | 0.951 | 0.967 | 0.978 |
| 0.146 | 0.146 | 0.277 | 0.425 | 0.565 | 0.684 | 0.776 | 0.845 | 0.893 | 0.928 | 0.951 | 0.967 | 0.978 |
| 0.1465 | 0.146 | 0.278 | 0.426 | 0.566 | 0.684 | 0.777 | 0.845 | 0.894 | 0.928 | 0.951 | 0.967 | 0.978 |
| 0.147 | 0.147 | 0.279 | 0.426 | 0.567 | 0.685 | 0.777 | 0.845 | 0.894 | 0.928 | 0.951 | 0.967 | 0.978 |
| 0.1475 | 0.148 | 0.279 | 0.427 | 0.567 | 0.685 | 0.777 | 0.845 | 0.894 | 0.928 | 0.951 | 0.967 | 0.978 |
| 0.148 | 0.148 | 0.28 | 0.428 | 0.568 | 0.686 | 0.778 | 0.846 | 0.894 | 0.928 | 0.952 | 0.967 | 0.978 |
| 0.1485 | 0.148 | 0.28 | 0.428 | 0.568 | 0.686 | 0.778 | 0.846 | 0.894 | 0.928 | 0.952 | 0.967 | 0.978 |
| 0.149 | 0.149 | 0.281 | 0.429 | 0.569 | 0.687 | 0.778 | 0.846 | 0.895 | 0.928 | 0.952 | 0.968 | 0.978 |
| 0.1495 | 0.15 | 0.282 | 0.43 | 0.569 | 0.687 | 0.779 | 0.846 | 0.895 | 0.929 | 0.952 | 0.968 | 0.978 |
| 0.15 | 0.15 | 0.282 | 0.43 | 0.57 | 0.687 | 0.779 | 0.847 | 0.895 | 0.929 | 0.952 | 0.968 | 0.978 |
| 0.1505 | 0.15 | 0.283 | 0.431 | 0.571 | 0.688 | 0.779 | 0.847 | 0.895 | 0.929 | 0.952 | 0.968 | 0.978 |
| 0.151 | 0.151 | 0.284 | 0.432 | 0.571 | 0.688 | 0.78 | 0.847 | 0.895 | 0.929 | 0.952 | 0.968 | 0.978 |
| 0.1515 | 0.152 | 0.284 | 0.432 | 0.572 | 0.689 | 0.78 | 0.847 | 0.895 | 0.929 | 0.952 | 0.968 | 0.978 |
| 0.152 | 0.152 | 0.285 | 0.433 | 0.572 | 0.689 | 0.78 | 0.848 | 0.896 | 0.929 | 0.952 | 0.968 | 0.978 |
| 0.1525 | 0.152 | 0.285 | 0.434 | 0.573 | 0.69 | 0.781 | 0.848 | 0.896 | 0.929 | 0.952 | 0.968 | 0.978 |
| 0.153 | 0.153 | 0.286 | 0.434 | 0.573 | 0.69 | 0.781 | 0.848 | 0.896 | 0.929 | 0.952 | 0.968 | 0.979 |
| 0.1535 | 0.154 | 0.287 | 0.435 | 0.574 | 0.691 | 0.781 | 0.848 | 0.896 | 0.929 | 0.952 | 0.968 | 0.979 |
| 0.154 | 0.154 | 0.287 | 0.435 | 0.574 | 0.691 | 0.782 | 0.849 | 0.896 | 0.93 | 0.953 | 0.968 | 0.979 |
| 0.1545 | 0.154 | 0.288 | 0.436 | 0.575 | 0.691 | 0.782 | 0.849 | 0.896 | 0.93 | 0.953 | 0.968 | 0.979 |
| 0.155 | 0.155 | 0.289 | 0.437 | 0.576 | 0.692 | 0.782 | 0.849 | 0.897 | 0.93 | 0.953 | 0.968 | 0.979 |
| 0.1555 | 0.156 | 0.289 | 0.437 | 0.576 | 0.692 | 0.783 | 0.849 | 0.897 | 0.93 | 0.953 | 0.968 | 0.979 |
| 0.156 | 0.156 | 0.29 | 0.438 | 0.577 | 0.693 | 0.783 | 0.849 | 0.897 | 0.93 | 0.953 | 0.968 | 0.979 |
| 0.1565 | 0.156 | 0.29 | 0.439 | 0.577 | 0.693 | 0.783 | 0.85 | 0.897 | 0.93 | 0.953 | 0.968 | 0.979 |
| 0.157 | 0.157 | 0.291 | 0.439 | 0.578 | 0.694 | 0.784 | 0.85 | 0.897 | 0.93 | 0.953 | 0.968 | 0.979 |
| 0.1575 | 0.158 | 0.292 | 0.44 | 0.578 | 0.694 | 0.784 | 0.85 | 0.897 | 0.93 | 0.953 | 0.968 | 0.979 |
| 0.158 | 0.158 | 0.292 | 0.44 | 0.579 | 0.695 | 0.784 | 0.85 | 0.898 | 0.931 | 0.953 | 0.969 | 0.979 |
| 0.1585 | 0.158 | 0.293 | 0.441 | 0.579 | 0.695 | 0.785 | 0.851 | 0.898 | 0.931 | 0.953 | 0.969 | 0.979 |
| 0.159 | 0.159 | 0.293 | 0.442 | 0.58 | 0.695 | 0.785 | 0.851 | 0.898 | 0.931 | 0.953 | 0.969 | 0.979 |
| 0.1595 | 0.16 | 0.294 | 0.442 | 0.58 | 0.696 | 0.785 | 0.851 | 0.898 | 0.931 | 0.953 | 0.969 | 0.979 |
| 0.16 | 0.16 | 0.295 | 0.443 | 0.581 | 0.696 | 0.786 | 0.851 | 0.898 | 0.931 | 0.953 | 0.969 | 0.979 |
| 0.1605 | 0.16 | 0.295 | 0.443 | 0.582 | 0.697 | 0.786 | 0.852 | 0.898 | 0.931 | 0.954 | 0.969 | 0.979 |
| 0.161 | 0.161 | 0.296 | 0.444 | 0.582 | 0.697 | 0.786 | 0.852 | 0.899 | 0.931 | 0.954 | 0.969 | 0.979 |
| 0.1615 | 0.162 | 0.297 | 0.445 | 0.583 | 0.698 | 0.787 | 0.852 | 0.899 | 0.931 | 0.954 | 0.969 | 0.979 |
| 0.162 | 0.162 | 0.297 | 0.445 | 0.583 | 0.698 | 0.787 | 0.852 | 0.899 | 0.931 | 0.954 | 0.969 | 0.979 |
| 0.1625 | 0.162 | 0.298 | 0.446 | 0.584 | 0.698 | 0.787 | 0.853 | 0.899 | 0.932 | 0.954 | 0.969 | 0.979 |
| 0.163 | 0.163 | 0.298 | 0.447 | 0.584 | 0.699 | 0.788 | 0.853 | 0.899 | 0.932 | 0.954 | 0.969 | 0.979 |
| 0.1635 | 0.164 | 0.299 | 0.447 | 0.585 | 0.699 | 0.788 | 0.853 | 0.899 | 0.932 | 0.954 | 0.969 | 0.979 |
| 0.164 | 0.164 | 0.3 | 0.448 | 0.585 | 0.7 | 0.788 | 0.853 | 0.9 | 0.932 | 0.954 | 0.969 | 0.979 |
| 0.1645 | 0.164 | 0.3 | 0.448 | 0.586 | 0.7 | 0.788 | 0.853 | 0.9 | 0.932 | 0.954 | 0.969 | 0.979 |
| 0.165 | 0.165 | 0.301 | 0.449 | 0.586 | 0.701 | 0.789 | 0.854 | 0.9 | 0.932 | 0.954 | 0.969 | 0.979 |
| 0.1655 | 0.166 | 0.301 | 0.45 | 0.587 | 0.701 | 0.789 | 0.854 | 0.9 | 0.932 | 0.954 | 0.969 | 0.979 |
| 0.166 | 0.166 | 0.302 | 0.45 | 0.587 | 0.701 | 0.789 | 0.854 | 0.9 | 0.932 | 0.954 | 0.969 | 0.979 |
| 0.1665 | 0.166 | 0.303 | 0.451 | 0.588 | 0.702 | 0.79 | 0.854 | 0.9 | 0.932 | 0.954 | 0.969 | 0.979 |
| 0.167 | 0.167 | 0.303 | 0.451 | 0.588 | 0.702 | 0.79 | 0.855 | 0.901 | 0.933 | 0.955 | 0.969 | 0.98 |
| 0.1675 | 0.168 | 0.304 | 0.452 | 0.589 | 0.703 | 0.79 | 0.855 | 0.901 | 0.933 | 0.955 | 0.969 | 0.98 |
| 0.168 | 0.168 | 0.304 | 0.453 | 0.589 | 0.703 | 0.791 | 0.855 | 0.901 | 0.933 | 0.955 | 0.97 | 0.98 |
| 0.1685 | 0.168 | 0.305 | 0.453 | 0.59 | 0.703 | 0.791 | 0.855 | 0.901 | 0.933 | 0.955 | 0.97 | 0.98 |
| 0.169 | 0.169 | 0.306 | 0.454 | 0.591 | 0.704 | 0.791 | 0.855 | 0.901 | 0.933 | 0.955 | 0.97 | 0.98 |
| 0.1695 | 0.17 | 0.306 | 0.454 | 0.591 | 0.704 | 0.792 | 0.856 | 0.901 | 0.933 | 0.955 | 0.97 | 0.98 |
| 0.17 | 0.17 | 0.307 | 0.455 | 0.592 | 0.705 | 0.792 | 0.856 | 0.901 | 0.933 | 0.955 | 0.97 | 0.98 |
| 0.1705 | 0.17 | 0.307 | 0.456 | 0.592 | 0.705 | 0.792 | 0.856 | 0.902 | 0.933 | 0.955 | 0.97 | 0.98 |
| 0.171 | 0.171 | 0.308 | 0.456 | 0.593 | 0.705 | 0.792 | 0.856 | 0.902 | 0.933 | 0.955 | 0.97 | 0.98 |
| 0.1715 | 0.172 | 0.309 | 0.457 | 0.593 | 0.706 | 0.793 | 0.857 | 0.902 | 0.934 | 0.955 | 0.97 | 0.98 |
| 0.172 | 0.172 | 0.309 | 0.457 | 0.594 | 0.706 | 0.793 | 0.857 | 0.902 | 0.934 | 0.955 | 0.97 | 0.98 |
| 0.1725 | 0.172 | 0.31 | 0.458 | 0.594 | 0.707 | 0.793 | 0.857 | 0.902 | 0.934 | 0.955 | 0.97 | 0.98 |
| 0.173 | 0.173 | 0.31 | 0.459 | 0.595 | 0.707 | 0.794 | 0.857 | 0.902 | 0.934 | 0.955 | 0.97 | 0.98 |
| 0.1735 | 0.174 | 0.311 | 0.459 | 0.595 | 0.708 | 0.794 | 0.857 | 0.903 | 0.934 | 0.955 | 0.97 | 0.98 |
| 0.174 | 0.174 | 0.312 | 0.46 | 0.596 | 0.708 | 0.794 | 0.858 | 0.903 | 0.934 | 0.956 | 0.97 | 0.98 |
| 0.1745 | 0.174 | 0.312 | 0.46 | 0.596 | 0.708 | 0.795 | 0.858 | 0.903 | 0.934 | 0.956 | 0.97 | 0.98 |
| 0.175 | 0.175 | 0.313 | 0.461 | 0.597 | 0.709 | 0.795 | 0.858 | 0.903 | 0.934 | 0.956 | 0.97 | 0.98 |
| 0.1755 | 0.176 | 0.313 | 0.461 | 0.597 | 0.709 | 0.795 | 0.858 | 0.903 | 0.934 | 0.956 | 0.97 | 0.98 |
| 0.176 | 0.176 | 0.314 | 0.462 | 0.598 | 0.71 | 0.796 | 0.859 | 0.903 | 0.934 | 0.956 | 0.97 | 0.98 |
| 0.1765 | 0.176 | 0.315 | 0.463 | 0.598 | 0.71 | 0.796 | 0.859 | 0.903 | 0.935 | 0.956 | 0.97 | 0.98 |
| 0.177 | 0.177 | 0.315 | 0.463 | 0.599 | 0.71 | 0.796 | 0.859 | 0.904 | 0.935 | 0.956 | 0.97 | 0.98 |
| 0.1775 | 0.178 | 0.316 | 0.464 | 0.599 | 0.711 | 0.796 | 0.859 | 0.904 | 0.935 | 0.956 | 0.97 | 0.98 |
| 0.178 | 0.178 | 0.316 | 0.464 | 0.6 | 0.711 | 0.797 | 0.859 | 0.904 | 0.935 | 0.956 | 0.971 | 0.98 |
| 0.1785 | 0.178 | 0.317 | 0.465 | 0.6 | 0.712 | 0.797 | 0.86 | 0.904 | 0.935 | 0.956 | 0.971 | 0.98 |
| 0.179 | 0.179 | 0.318 | 0.466 | 0.601 | 0.712 | 0.797 | 0.86 | 0.904 | 0.935 | 0.956 | 0.971 | 0.98 |
| 0.1795 | 0.18 | 0.318 | 0.466 | 0.601 | 0.712 | 0.798 | 0.86 | 0.904 | 0.935 | 0.956 | 0.971 | 0.98 |
| 0.18 | 0.18 | 0.319 | 0.467 | 0.602 | 0.713 | 0.798 | 0.86 | 0.905 | 0.935 | 0.956 | 0.971 | 0.98 |
| 0.1805 | 0.18 | 0.319 | 0.467 | 0.602 | 0.713 | 0.798 | 0.86 | 0.905 | 0.935 | 0.956 | 0.971 | 0.98 |
| 0.181 | 0.181 | 0.32 | 0.468 | 0.603 | 0.713 | 0.798 | 0.861 | 0.905 | 0.935 | 0.957 | 0.971 | 0.98 |
| 0.1815 | 0.182 | 0.321 | 0.468 | 0.603 | 0.714 | 0.799 | 0.861 | 0.905 | 0.936 | 0.957 | 0.971 | 0.98 |
| 0.182 | 0.182 | 0.321 | 0.469 | 0.604 | 0.714 | 0.799 | 0.861 | 0.905 | 0.936 | 0.957 | 0.971 | 0.98 |
| 0.1825 | 0.182 | 0.322 | 0.47 | 0.604 | 0.715 | 0.799 | 0.861 | 0.905 | 0.936 | 0.957 | 0.971 | 0.981 |
| 0.183 | 0.183 | 0.322 | 0.47 | 0.605 | 0.715 | 0.8 | 0.861 | 0.905 | 0.936 | 0.957 | 0.971 | 0.981 |
| 0.1835 | 0.184 | 0.323 | 0.471 | 0.605 | 0.715 | 0.8 | 0.862 | 0.906 | 0.936 | 0.957 | 0.971 | 0.981 |
| 0.184 | 0.184 | 0.324 | 0.471 | 0.606 | 0.716 | 0.8 | 0.862 | 0.906 | 0.936 | 0.957 | 0.971 | 0.981 |
| 0.1845 | 0.184 | 0.324 | 0.472 | 0.606 | 0.716 | 0.8 | 0.862 | 0.906 | 0.936 | 0.957 | 0.971 | 0.981 |
| 0.185 | 0.185 | 0.325 | 0.472 | 0.607 | 0.717 | 0.801 | 0.862 | 0.906 | 0.936 | 0.957 | 0.971 | 0.981 |
| 0.1855 | 0.186 | 0.325 | 0.473 | 0.607 | 0.717 | 0.801 | 0.863 | 0.906 | 0.936 | 0.957 | 0.971 | 0.981 |
| 0.186 | 0.186 | 0.326 | 0.474 | 0.608 | 0.717 | 0.801 | 0.863 | 0.906 | 0.936 | 0.957 | 0.971 | 0.981 |
| 0.1865 | 0.186 | 0.326 | 0.474 | 0.608 | 0.718 | 0.802 | 0.863 | 0.906 | 0.937 | 0.957 | 0.971 | 0.981 |
| 0.187 | 0.187 | 0.327 | 0.475 | 0.608 | 0.718 | 0.802 | 0.863 | 0.907 | 0.937 | 0.957 | 0.971 | 0.981 |
| 0.1875 | 0.188 | 0.328 | 0.475 | 0.609 | 0.718 | 0.802 | 0.863 | 0.907 | 0.937 | 0.957 | 0.971 | 0.981 |
| 0.188 | 0.188 | 0.328 | 0.476 | 0.609 | 0.719 | 0.802 | 0.864 | 0.907 | 0.937 | 0.957 | 0.971 | 0.981 |
| 0.1885 | 0.188 | 0.329 | 0.476 | 0.61 | 0.719 | 0.803 | 0.864 | 0.907 | 0.937 | 0.958 | 0.971 | 0.981 |
| 0.189 | 0.189 | 0.329 | 0.477 | 0.61 | 0.72 | 0.803 | 0.864 | 0.907 | 0.937 | 0.958 | 0.972 | 0.981 |
| 0.1895 | 0.19 | 0.33 | 0.477 | 0.611 | 0.72 | 0.803 | 0.864 | 0.907 | 0.937 | 0.958 | 0.972 | 0.981 |
| 0.19 | 0.19 | 0.33 | 0.478 | 0.611 | 0.72 | 0.804 | 0.864 | 0.907 | 0.937 | 0.958 | 0.972 | 0.981 |
| 0.1905 | 0.19 | 0.331 | 0.479 | 0.612 | 0.721 | 0.804 | 0.865 | 0.908 | 0.937 | 0.958 | 0.972 | 0.981 |
| 0.191 | 0.191 | 0.332 | 0.479 | 0.612 | 0.721 | 0.804 | 0.865 | 0.908 | 0.937 | 0.958 | 0.972 | 0.981 |
| 0.1915 | 0.192 | 0.332 | 0.48 | 0.613 | 0.721 | 0.804 | 0.865 | 0.908 | 0.938 | 0.958 | 0.972 | 0.981 |
| 0.192 | 0.192 | 0.333 | 0.48 | 0.613 | 0.722 | 0.805 | 0.865 | 0.908 | 0.938 | 0.958 | 0.972 | 0.981 |
| 0.1925 | 0.192 | 0.333 | 0.481 | 0.614 | 0.722 | 0.805 | 0.865 | 0.908 | 0.938 | 0.958 | 0.972 | 0.981 |
| 0.193 | 0.193 | 0.334 | 0.481 | 0.614 | 0.723 | 0.805 | 0.866 | 0.908 | 0.938 | 0.958 | 0.972 | 0.981 |
| 0.1935 | 0.194 | 0.335 | 0.482 | 0.615 | 0.723 | 0.805 | 0.866 | 0.908 | 0.938 | 0.958 | 0.972 | 0.981 |
| 0.194 | 0.194 | 0.335 | 0.482 | 0.615 | 0.723 | 0.806 | 0.866 | 0.908 | 0.938 | 0.958 | 0.972 | 0.981 |
| 0.1945 | 0.194 | 0.336 | 0.483 | 0.616 | 0.724 | 0.806 | 0.866 | 0.909 | 0.938 | 0.958 | 0.972 | 0.981 |
| 0.195 | 0.195 | 0.336 | 0.484 | 0.616 | 0.724 | 0.806 | 0.866 | 0.909 | 0.938 | 0.958 | 0.972 | 0.981 |
| 0.1955 | 0.196 | 0.337 | 0.484 | 0.617 | 0.724 | 0.807 | 0.867 | 0.909 | 0.938 | 0.958 | 0.972 | 0.981 |
| 0.196 | 0.196 | 0.337 | 0.485 | 0.617 | 0.725 | 0.807 | 0.867 | 0.909 | 0.938 | 0.958 | 0.972 | 0.981 |
| 0.1965 | 0.196 | 0.338 | 0.485 | 0.617 | 0.725 | 0.807 | 0.867 | 0.909 | 0.938 | 0.959 | 0.972 | 0.981 |
| 0.197 | 0.197 | 0.339 | 0.486 | 0.618 | 0.725 | 0.807 | 0.867 | 0.909 | 0.939 | 0.959 | 0.972 | 0.981 |
| 0.1975 | 0.198 | 0.339 | 0.486 | 0.618 | 0.726 | 0.808 | 0.867 | 0.909 | 0.939 | 0.959 | 0.972 | 0.981 |
| 0.198 | 0.198 | 0.34 | 0.487 | 0.619 | 0.726 | 0.808 | 0.867 | 0.91 | 0.939 | 0.959 | 0.972 | 0.981 |
| 0.1985 | 0.198 | 0.34 | 0.487 | 0.619 | 0.727 | 0.808 | 0.868 | 0.91 | 0.939 | 0.959 | 0.972 | 0.981 |
| 0.199 | 0.199 | 0.341 | 0.488 | 0.62 | 0.727 | 0.808 | 0.868 | 0.91 | 0.939 | 0.959 | 0.972 | 0.982 |
| 0.1995 | 0.2 | 0.341 | 0.488 | 0.62 | 0.727 | 0.809 | 0.868 | 0.91 | 0.939 | 0.959 | 0.972 | 0.982 |
| 0.2 | 0.2 | 0.342 | 0.489 | 0.621 | 0.728 | 0.809 | 0.868 | 0.91 | 0.939 | 0.959 | 0.972 | 0.982 |
| 0.2005 | 0.2 | 0.343 | 0.49 | 0.621 | 0.728 | 0.809 | 0.868 | 0.91 | 0.939 | 0.959 | 0.973 | 0.982 |
| 0.201 | 0.201 | 0.343 | 0.49 | 0.622 | 0.728 | 0.81 | 0.869 | 0.91 | 0.939 | 0.959 | 0.973 | 0.982 |
| 0.2015 | 0.202 | 0.344 | 0.491 | 0.622 | 0.729 | 0.81 | 0.869 | 0.911 | 0.939 | 0.959 | 0.973 | 0.982 |
| 0.202 | 0.202 | 0.344 | 0.491 | 0.623 | 0.729 | 0.81 | 0.869 | 0.911 | 0.939 | 0.959 | 0.973 | 0.982 |
| 0.2025 | 0.202 | 0.345 | 0.492 | 0.623 | 0.729 | 0.81 | 0.869 | 0.911 | 0.94 | 0.959 | 0.973 | 0.982 |
| 0.203 | 0.203 | 0.345 | 0.492 | 0.623 | 0.73 | 0.811 | 0.869 | 0.911 | 0.94 | 0.959 | 0.973 | 0.982 |
| 0.2035 | 0.204 | 0.346 | 0.493 | 0.624 | 0.73 | 0.811 | 0.87 | 0.911 | 0.94 | 0.959 | 0.973 | 0.982 |
| 0.204 | 0.204 | 0.347 | 0.493 | 0.624 | 0.731 | 0.811 | 0.87 | 0.911 | 0.94 | 0.959 | 0.973 | 0.982 |
| 0.2045 | 0.204 | 0.347 | 0.494 | 0.625 | 0.731 | 0.811 | 0.87 | 0.911 | 0.94 | 0.96 | 0.973 | 0.982 |
| 0.205 | 0.205 | 0.348 | 0.494 | 0.625 | 0.731 | 0.812 | 0.87 | 0.911 | 0.94 | 0.96 | 0.973 | 0.982 |
| 0.2055 | 0.206 | 0.348 | 0.495 | 0.626 | 0.732 | 0.812 | 0.87 | 0.912 | 0.94 | 0.96 | 0.973 | 0.982 |
| 0.206 | 0.206 | 0.349 | 0.496 | 0.626 | 0.732 | 0.812 | 0.87 | 0.912 | 0.94 | 0.96 | 0.973 | 0.982 |
| 0.2065 | 0.206 | 0.349 | 0.496 | 0.627 | 0.732 | 0.812 | 0.871 | 0.912 | 0.94 | 0.96 | 0.973 | 0.982 |
| 0.207 | 0.207 | 0.35 | 0.497 | 0.627 | 0.733 | 0.813 | 0.871 | 0.912 | 0.94 | 0.96 | 0.973 | 0.982 |
| 0.2075 | 0.208 | 0.35 | 0.497 | 0.628 | 0.733 | 0.813 | 0.871 | 0.912 | 0.94 | 0.96 | 0.973 | 0.982 |
| 0.208 | 0.208 | 0.351 | 0.498 | 0.628 | 0.733 | 0.813 | 0.871 | 0.912 | 0.941 | 0.96 | 0.973 | 0.982 |
| 0.2085 | 0.208 | 0.352 | 0.498 | 0.628 | 0.734 | 0.813 | 0.871 | 0.912 | 0.941 | 0.96 | 0.973 | 0.982 |
| 0.209 | 0.209 | 0.352 | 0.499 | 0.629 | 0.734 | 0.814 | 0.872 | 0.912 | 0.941 | 0.96 | 0.973 | 0.982 |
| 0.2095 | 0.21 | 0.353 | 0.499 | 0.629 | 0.734 | 0.814 | 0.872 | 0.913 | 0.941 | 0.96 | 0.973 | 0.982 |
| 0.21 | 0.21 | 0.353 | 0.5 | 0.63 | 0.735 | 0.814 | 0.872 | 0.913 | 0.941 | 0.96 | 0.973 | 0.982 |
| 0.2105 | 0.21 | 0.354 | 0.5 | 0.63 | 0.735 | 0.814 | 0.872 | 0.913 | 0.941 | 0.96 | 0.973 | 0.982 |
| 0.211 | 0.211 | 0.354 | 0.501 | 0.631 | 0.735 | 0.815 | 0.872 | 0.913 | 0.941 | 0.96 | 0.973 | 0.982 |
| 0.2115 | 0.212 | 0.355 | 0.501 | 0.631 | 0.736 | 0.815 | 0.873 | 0.913 | 0.941 | 0.96 | 0.973 | 0.982 |
| 0.212 | 0.212 | 0.356 | 0.502 | 0.632 | 0.736 | 0.815 | 0.873 | 0.913 | 0.941 | 0.96 | 0.973 | 0.982 |
| 0.2125 | 0.212 | 0.356 | 0.502 | 0.632 | 0.736 | 0.815 | 0.873 | 0.913 | 0.941 | 0.961 | 0.973 | 0.982 |
| 0.213 | 0.213 | 0.357 | 0.503 | 0.632 | 0.737 | 0.816 | 0.873 | 0.913 | 0.941 | 0.961 | 0.974 | 0.982 |
| 0.2135 | 0.214 | 0.357 | 0.503 | 0.633 | 0.737 | 0.816 | 0.873 | 0.914 | 0.942 | 0.961 | 0.974 | 0.982 |
| 0.214 | 0.214 | 0.358 | 0.504 | 0.633 | 0.737 | 0.816 | 0.873 | 0.914 | 0.942 | 0.961 | 0.974 | 0.982 |
| 0.2145 | 0.214 | 0.358 | 0.504 | 0.634 | 0.738 | 0.817 | 0.874 | 0.914 | 0.942 | 0.961 | 0.974 | 0.982 |
| 0.215 | 0.215 | 0.359 | 0.505 | 0.634 | 0.738 | 0.817 | 0.874 | 0.914 | 0.942 | 0.961 | 0.974 | 0.982 |
| 0.2155 | 0.216 | 0.359 | 0.506 | 0.635 | 0.738 | 0.817 | 0.874 | 0.914 | 0.942 | 0.961 | 0.974 | 0.982 |
| 0.216 | 0.216 | 0.36 | 0.506 | 0.635 | 0.739 | 0.817 | 0.874 | 0.914 | 0.942 | 0.961 | 0.974 | 0.982 |
| 0.2165 | 0.216 | 0.361 | 0.507 | 0.635 | 0.739 | 0.818 | 0.874 | 0.914 | 0.942 | 0.961 | 0.974 | 0.982 |
| 0.217 | 0.217 | 0.361 | 0.507 | 0.636 | 0.739 | 0.818 | 0.874 | 0.914 | 0.942 | 0.961 | 0.974 | 0.982 |
| 0.2175 | 0.218 | 0.362 | 0.508 | 0.636 | 0.74 | 0.818 | 0.875 | 0.915 | 0.942 | 0.961 | 0.974 | 0.983 |
| 0.218 | 0.218 | 0.362 | 0.508 | 0.637 | 0.74 | 0.818 | 0.875 | 0.915 | 0.942 | 0.961 | 0.974 | 0.983 |
| 0.2185 | 0.218 | 0.363 | 0.509 | 0.637 | 0.74 | 0.818 | 0.875 | 0.915 | 0.942 | 0.961 | 0.974 | 0.983 |
| 0.219 | 0.219 | 0.363 | 0.509 | 0.638 | 0.741 | 0.819 | 0.875 | 0.915 | 0.942 | 0.961 | 0.974 | 0.983 |
| 0.2195 | 0.22 | 0.364 | 0.51 | 0.638 | 0.741 | 0.819 | 0.875 | 0.915 | 0.943 | 0.961 | 0.974 | 0.983 |
| 0.22 | 0.22 | 0.364 | 0.51 | 0.639 | 0.741 | 0.819 | 0.876 | 0.915 | 0.943 | 0.961 | 0.974 | 0.983 |
| 0.2205 | 0.22 | 0.365 | 0.511 | 0.639 | 0.742 | 0.819 | 0.876 | 0.915 | 0.943 | 0.961 | 0.974 | 0.983 |
| 0.221 | 0.221 | 0.366 | 0.511 | 0.639 | 0.742 | 0.82 | 0.876 | 0.915 | 0.943 | 0.961 | 0.974 | 0.983 |
| 0.2215 | 0.222 | 0.366 | 0.512 | 0.64 | 0.742 | 0.82 | 0.876 | 0.916 | 0.943 | 0.962 | 0.974 | 0.983 |
| 0.222 | 0.222 | 0.367 | 0.512 | 0.64 | 0.743 | 0.82 | 0.876 | 0.916 | 0.943 | 0.962 | 0.974 | 0.983 |
| 0.2225 | 0.222 | 0.367 | 0.513 | 0.641 | 0.743 | 0.82 | 0.876 | 0.916 | 0.943 | 0.962 | 0.974 | 0.983 |
| 0.223 | 0.223 | 0.368 | 0.513 | 0.641 | 0.743 | 0.821 | 0.877 | 0.916 | 0.943 | 0.962 | 0.974 | 0.983 |
| 0.2235 | 0.224 | 0.368 | 0.514 | 0.641 | 0.744 | 0.821 | 0.877 | 0.916 | 0.943 | 0.962 | 0.974 | 0.983 |
| 0.224 | 0.224 | 0.369 | 0.514 | 0.642 | 0.744 | 0.821 | 0.877 | 0.916 | 0.943 | 0.962 | 0.974 | 0.983 |
| 0.2245 | 0.224 | 0.369 | 0.515 | 0.642 | 0.744 | 0.821 | 0.877 | 0.916 | 0.943 | 0.962 | 0.974 | 0.983 |
| 0.225 | 0.225 | 0.37 | 0.515 | 0.643 | 0.745 | 0.822 | 0.877 | 0.916 | 0.943 | 0.962 | 0.974 | 0.983 |
| 0.2255 | 0.226 | 0.37 | 0.516 | 0.643 | 0.745 | 0.822 | 0.877 | 0.917 | 0.944 | 0.962 | 0.975 | 0.983 |
| 0.226 | 0.226 | 0.371 | 0.516 | 0.644 | 0.745 | 0.822 | 0.878 | 0.917 | 0.944 | 0.962 | 0.975 | 0.983 |
| 0.2265 | 0.226 | 0.372 | 0.517 | 0.644 | 0.746 | 0.822 | 0.878 | 0.917 | 0.944 | 0.962 | 0.975 | 0.983 |
| 0.227 | 0.227 | 0.372 | 0.517 | 0.644 | 0.746 | 0.823 | 0.878 | 0.917 | 0.944 | 0.962 | 0.975 | 0.983 |
| 0.2275 | 0.228 | 0.373 | 0.518 | 0.645 | 0.746 | 0.823 | 0.878 | 0.917 | 0.944 | 0.962 | 0.975 | 0.983 |
| 0.228 | 0.228 | 0.373 | 0.518 | 0.645 | 0.747 | 0.823 | 0.878 | 0.917 | 0.944 | 0.962 | 0.975 | 0.983 |
| 0.2285 | 0.228 | 0.374 | 0.519 | 0.646 | 0.747 | 0.823 | 0.878 | 0.917 | 0.944 | 0.962 | 0.975 | 0.983 |
| 0.229 | 0.229 | 0.374 | 0.519 | 0.646 | 0.747 | 0.824 | 0.879 | 0.917 | 0.944 | 0.962 | 0.975 | 0.983 |
| 0.2295 | 0.23 | 0.375 | 0.52 | 0.647 | 0.748 | 0.824 | 0.879 | 0.917 | 0.944 | 0.962 | 0.975 | 0.983 |
| 0.23 | 0.23 | 0.375 | 0.52 | 0.647 | 0.748 | 0.824 | 0.879 | 0.918 | 0.944 | 0.962 | 0.975 | 0.983 |
| 0.2305 | 0.23 | 0.376 | 0.521 | 0.647 | 0.748 | 0.824 | 0.879 | 0.918 | 0.944 | 0.963 | 0.975 | 0.983 |
| 0.231 | 0.231 | 0.376 | 0.521 | 0.648 | 0.749 | 0.825 | 0.879 | 0.918 | 0.944 | 0.963 | 0.975 | 0.983 |
| 0.2315 | 0.232 | 0.377 | 0.522 | 0.648 | 0.749 | 0.825 | 0.879 | 0.918 | 0.945 | 0.963 | 0.975 | 0.983 |
| 0.232 | 0.232 | 0.378 | 0.522 | 0.649 | 0.749 | 0.825 | 0.88 | 0.918 | 0.945 | 0.963 | 0.975 | 0.983 |
| 0.2325 | 0.232 | 0.378 | 0.523 | 0.649 | 0.75 | 0.825 | 0.88 | 0.918 | 0.945 | 0.963 | 0.975 | 0.983 |
| 0.233 | 0.233 | 0.379 | 0.523 | 0.649 | 0.75 | 0.825 | 0.88 | 0.918 | 0.945 | 0.963 | 0.975 | 0.983 |
| 0.2335 | 0.234 | 0.379 | 0.524 | 0.65 | 0.75 | 0.826 | 0.88 | 0.918 | 0.945 | 0.963 | 0.975 | 0.983 |
| 0.234 | 0.234 | 0.38 | 0.524 | 0.65 | 0.751 | 0.826 | 0.88 | 0.919 | 0.945 | 0.963 | 0.975 | 0.983 |
| 0.2345 | 0.234 | 0.38 | 0.525 | 0.651 | 0.751 | 0.826 | 0.88 | 0.919 | 0.945 | 0.963 | 0.975 | 0.983 |
| 0.235 | 0.235 | 0.381 | 0.525 | 0.651 | 0.751 | 0.826 | 0.881 | 0.919 | 0.945 | 0.963 | 0.975 | 0.983 |
| 0.2355 | 0.236 | 0.381 | 0.526 | 0.652 | 0.752 | 0.827 | 0.881 | 0.919 | 0.945 | 0.963 | 0.975 | 0.983 |
| 0.236 | 0.236 | 0.382 | 0.526 | 0.652 | 0.752 | 0.827 | 0.881 | 0.919 | 0.945 | 0.963 | 0.975 | 0.983 |
| 0.2365 | 0.236 | 0.382 | 0.527 | 0.652 | 0.752 | 0.827 | 0.881 | 0.919 | 0.945 | 0.963 | 0.975 | 0.983 |
| 0.237 | 0.237 | 0.383 | 0.527 | 0.653 | 0.752 | 0.827 | 0.881 | 0.919 | 0.945 | 0.963 | 0.975 | 0.983 |
| 0.2375 | 0.238 | 0.384 | 0.528 | 0.653 | 0.753 | 0.828 | 0.881 | 0.919 | 0.945 | 0.963 | 0.975 | 0.984 |
| 0.238 | 0.238 | 0.384 | 0.528 | 0.654 | 0.753 | 0.828 | 0.882 | 0.919 | 0.946 | 0.963 | 0.975 | 0.984 |
| 0.2385 | 0.238 | 0.385 | 0.529 | 0.654 | 0.753 | 0.828 | 0.882 | 0.92 | 0.946 | 0.963 | 0.975 | 0.984 |
| 0.239 | 0.239 | 0.385 | 0.529 | 0.654 | 0.754 | 0.828 | 0.882 | 0.92 | 0.946 | 0.963 | 0.975 | 0.984 |
| 0.2395 | 0.24 | 0.386 | 0.53 | 0.655 | 0.754 | 0.828 | 0.882 | 0.92 | 0.946 | 0.964 | 0.976 | 0.984 |
| 0.24 | 0.24 | 0.386 | 0.53 | 0.655 | 0.754 | 0.829 | 0.882 | 0.92 | 0.946 | 0.964 | 0.976 | 0.984 |
| 0.2405 | 0.24 | 0.387 | 0.531 | 0.656 | 0.755 | 0.829 | 0.882 | 0.92 | 0.946 | 0.964 | 0.976 | 0.984 |
| 0.241 | 0.241 | 0.387 | 0.531 | 0.656 | 0.755 | 0.829 | 0.883 | 0.92 | 0.946 | 0.964 | 0.976 | 0.984 |
| 0.2415 | 0.242 | 0.388 | 0.532 | 0.656 | 0.755 | 0.829 | 0.883 | 0.92 | 0.946 | 0.964 | 0.976 | 0.984 |
| 0.242 | 0.242 | 0.388 | 0.532 | 0.657 | 0.756 | 0.83 | 0.883 | 0.92 | 0.946 | 0.964 | 0.976 | 0.984 |
| 0.2425 | 0.242 | 0.389 | 0.533 | 0.657 | 0.756 | 0.83 | 0.883 | 0.92 | 0.946 | 0.964 | 0.976 | 0.984 |
| 0.243 | 0.243 | 0.389 | 0.533 | 0.658 | 0.756 | 0.83 | 0.883 | 0.921 | 0.946 | 0.964 | 0.976 | 0.984 |
| 0.2435 | 0.244 | 0.39 | 0.534 | 0.658 | 0.757 | 0.83 | 0.883 | 0.921 | 0.946 | 0.964 | 0.976 | 0.984 |
| 0.244 | 0.244 | 0.39 | 0.534 | 0.658 | 0.757 | 0.83 | 0.884 | 0.921 | 0.946 | 0.964 | 0.976 | 0.984 |
| 0.2445 | 0.244 | 0.391 | 0.535 | 0.659 | 0.757 | 0.831 | 0.884 | 0.921 | 0.947 | 0.964 | 0.976 | 0.984 |
| 0.245 | 0.245 | 0.392 | 0.535 | 0.659 | 0.757 | 0.831 | 0.884 | 0.921 | 0.947 | 0.964 | 0.976 | 0.984 |
| 0.2455 | 0.246 | 0.392 | 0.536 | 0.66 | 0.758 | 0.831 | 0.884 | 0.921 | 0.947 | 0.964 | 0.976 | 0.984 |
| 0.246 | 0.246 | 0.393 | 0.536 | 0.66 | 0.758 | 0.831 | 0.884 | 0.921 | 0.947 | 0.964 | 0.976 | 0.984 |
| 0.2465 | 0.246 | 0.393 | 0.537 | 0.66 | 0.758 | 0.832 | 0.884 | 0.921 | 0.947 | 0.964 | 0.976 | 0.984 |
| 0.247 | 0.247 | 0.394 | 0.537 | 0.661 | 0.759 | 0.832 | 0.884 | 0.921 | 0.947 | 0.964 | 0.976 | 0.984 |
| 0.2475 | 0.248 | 0.394 | 0.538 | 0.661 | 0.759 | 0.832 | 0.885 | 0.922 | 0.947 | 0.964 | 0.976 | 0.984 |
| 0.248 | 0.248 | 0.395 | 0.538 | 0.662 | 0.759 | 0.832 | 0.885 | 0.922 | 0.947 | 0.964 | 0.976 | 0.984 |
| 0.2485 | 0.248 | 0.395 | 0.539 | 0.662 | 0.76 | 0.832 | 0.885 | 0.922 | 0.947 | 0.964 | 0.976 | 0.984 |
| 0.249 | 0.249 | 0.396 | 0.539 | 0.662 | 0.76 | 0.833 | 0.885 | 0.922 | 0.947 | 0.964 | 0.976 | 0.984 |
| 0.2495 | 0.25 | 0.396 | 0.54 | 0.663 | 0.76 | 0.833 | 0.885 | 0.922 | 0.947 | 0.965 | 0.976 | 0.984 |
| 0.25 | 0.25 | 0.397 | 0.54 | 0.663 | 0.76 | 0.833 | 0.885 | 0.922 | 0.947 | 0.965 | 0.976 | 0.984 |
| 0.2505 | 0.25 | 0.397 | 0.541 | 0.664 | 0.761 | 0.833 | 0.886 | 0.922 | 0.947 | 0.965 | 0.976 | 0.984 |
| 0.251 | 0.251 | 0.398 | 0.541 | 0.664 | 0.761 | 0.834 | 0.886 | 0.922 | 0.947 | 0.965 | 0.976 | 0.984 |
| 0.2515 | 0.252 | 0.398 | 0.541 | 0.664 | 0.761 | 0.834 | 0.886 | 0.922 | 0.948 | 0.965 | 0.976 | 0.984 |
| 0.252 | 0.252 | 0.399 | 0.542 | 0.665 | 0.762 | 0.834 | 0.886 | 0.922 | 0.948 | 0.965 | 0.976 | 0.984 |
| 0.2525 | 0.252 | 0.399 | 0.542 | 0.665 | 0.762 | 0.834 | 0.886 | 0.923 | 0.948 | 0.965 | 0.976 | 0.984 |
| 0.253 | 0.253 | 0.4 | 0.543 | 0.665 | 0.762 | 0.834 | 0.886 | 0.923 | 0.948 | 0.965 | 0.976 | 0.984 |
| 0.2535 | 0.254 | 0.401 | 0.543 | 0.666 | 0.763 | 0.835 | 0.886 | 0.923 | 0.948 | 0.965 | 0.976 | 0.984 |
| 0.254 | 0.254 | 0.401 | 0.544 | 0.666 | 0.763 | 0.835 | 0.887 | 0.923 | 0.948 | 0.965 | 0.977 | 0.984 |
| 0.2545 | 0.254 | 0.402 | 0.544 | 0.667 | 0.763 | 0.835 | 0.887 | 0.923 | 0.948 | 0.965 | 0.977 | 0.984 |
| 0.255 | 0.255 | 0.402 | 0.545 | 0.667 | 0.763 | 0.835 | 0.887 | 0.923 | 0.948 | 0.965 | 0.977 | 0.984 |
| 0.2555 | 0.256 | 0.403 | 0.545 | 0.667 | 0.764 | 0.836 | 0.887 | 0.923 | 0.948 | 0.965 | 0.977 | 0.984 |
| 0.256 | 0.256 | 0.403 | 0.546 | 0.668 | 0.764 | 0.836 | 0.887 | 0.923 | 0.948 | 0.965 | 0.977 | 0.984 |
| 0.2565 | 0.256 | 0.404 | 0.546 | 0.668 | 0.764 | 0.836 | 0.887 | 0.923 | 0.948 | 0.965 | 0.977 | 0.984 |
| 0.257 | 0.257 | 0.404 | 0.547 | 0.669 | 0.765 | 0.836 | 0.888 | 0.924 | 0.948 | 0.965 | 0.977 | 0.984 |
| 0.2575 | 0.258 | 0.405 | 0.547 | 0.669 | 0.765 | 0.836 | 0.888 | 0.924 | 0.948 | 0.965 | 0.977 | 0.984 |
| 0.258 | 0.258 | 0.405 | 0.548 | 0.669 | 0.765 | 0.837 | 0.888 | 0.924 | 0.949 | 0.965 | 0.977 | 0.984 |
| 0.2585 | 0.258 | 0.406 | 0.548 | 0.67 | 0.765 | 0.837 | 0.888 | 0.924 | 0.949 | 0.965 | 0.977 | 0.984 |
| 0.259 | 0.259 | 0.406 | 0.549 | 0.67 | 0.766 | 0.837 | 0.888 | 0.924 | 0.949 | 0.965 | 0.977 | 0.985 |
| 0.2595 | 0.26 | 0.407 | 0.549 | 0.671 | 0.766 | 0.837 | 0.888 | 0.924 | 0.949 | 0.966 | 0.977 | 0.985 |
| 0.26 | 0.26 | 0.407 | 0.55 | 0.671 | 0.766 | 0.837 | 0.888 | 0.924 | 0.949 | 0.966 | 0.977 | 0.985 |
| 0.2605 | 0.26 | 0.408 | 0.55 | 0.671 | 0.767 | 0.838 | 0.889 | 0.924 | 0.949 | 0.966 | 0.977 | 0.985 |
| 0.261 | 0.261 | 0.408 | 0.55 | 0.672 | 0.767 | 0.838 | 0.889 | 0.924 | 0.949 | 0.966 | 0.977 | 0.985 |
| 0.2615 | 0.262 | 0.409 | 0.551 | 0.672 | 0.767 | 0.838 | 0.889 | 0.924 | 0.949 | 0.966 | 0.977 | 0.985 |
| 0.262 | 0.262 | 0.409 | 0.551 | 0.672 | 0.768 | 0.838 | 0.889 | 0.925 | 0.949 | 0.966 | 0.977 | 0.985 |
| 0.2625 | 0.262 | 0.41 | 0.552 | 0.673 | 0.768 | 0.839 | 0.889 | 0.925 | 0.949 | 0.966 | 0.977 | 0.985 |
| 0.263 | 0.263 | 0.41 | 0.552 | 0.673 | 0.768 | 0.839 | 0.889 | 0.925 | 0.949 | 0.966 | 0.977 | 0.985 |
| 0.2635 | 0.264 | 0.411 | 0.553 | 0.674 | 0.768 | 0.839 | 0.89 | 0.925 | 0.949 | 0.966 | 0.977 | 0.985 |
| 0.264 | 0.264 | 0.412 | 0.553 | 0.674 | 0.769 | 0.839 | 0.89 | 0.925 | 0.949 | 0.966 | 0.977 | 0.985 |
| 0.2645 | 0.264 | 0.412 | 0.554 | 0.674 | 0.769 | 0.839 | 0.89 | 0.925 | 0.949 | 0.966 | 0.977 | 0.985 |
| 0.265 | 0.265 | 0.413 | 0.554 | 0.675 | 0.769 | 0.84 | 0.89 | 0.925 | 0.95 | 0.966 | 0.977 | 0.985 |
| 0.2655 | 0.266 | 0.413 | 0.555 | 0.675 | 0.77 | 0.84 | 0.89 | 0.925 | 0.95 | 0.966 | 0.977 | 0.985 |
| 0.266 | 0.266 | 0.414 | 0.555 | 0.675 | 0.77 | 0.84 | 0.89 | 0.925 | 0.95 | 0.966 | 0.977 | 0.985 |
| 0.2665 | 0.266 | 0.414 | 0.556 | 0.676 | 0.77 | 0.84 | 0.89 | 0.926 | 0.95 | 0.966 | 0.977 | 0.985 |
| 0.267 | 0.267 | 0.415 | 0.556 | 0.676 | 0.77 | 0.84 | 0.891 | 0.926 | 0.95 | 0.966 | 0.977 | 0.985 |
| 0.2675 | 0.268 | 0.415 | 0.557 | 0.677 | 0.771 | 0.841 | 0.891 | 0.926 | 0.95 | 0.966 | 0.977 | 0.985 |
| 0.268 | 0.268 | 0.416 | 0.557 | 0.677 | 0.771 | 0.841 | 0.891 | 0.926 | 0.95 | 0.966 | 0.977 | 0.985 |
| 0.2685 | 0.268 | 0.416 | 0.557 | 0.677 | 0.771 | 0.841 | 0.891 | 0.926 | 0.95 | 0.966 | 0.977 | 0.985 |
| 0.269 | 0.269 | 0.417 | 0.558 | 0.678 | 0.772 | 0.841 | 0.891 | 0.926 | 0.95 | 0.966 | 0.977 | 0.985 |
| 0.2695 | 0.27 | 0.417 | 0.558 | 0.678 | 0.772 | 0.841 | 0.891 | 0.926 | 0.95 | 0.966 | 0.978 | 0.985 |
| 0.27 | 0.27 | 0.418 | 0.559 | 0.678 | 0.772 | 0.842 | 0.891 | 0.926 | 0.95 | 0.967 | 0.978 | 0.985 |
| 0.2705 | 0.27 | 0.418 | 0.559 | 0.679 | 0.772 | 0.842 | 0.892 | 0.926 | 0.95 | 0.967 | 0.978 | 0.985 |
| 0.271 | 0.271 | 0.419 | 0.56 | 0.679 | 0.773 | 0.842 | 0.892 | 0.926 | 0.95 | 0.967 | 0.978 | 0.985 |
| 0.2715 | 0.272 | 0.419 | 0.56 | 0.68 | 0.773 | 0.842 | 0.892 | 0.927 | 0.95 | 0.967 | 0.978 | 0.985 |
| 0.272 | 0.272 | 0.42 | 0.561 | 0.68 | 0.773 | 0.842 | 0.892 | 0.927 | 0.95 | 0.967 | 0.978 | 0.985 |
| 0.2725 | 0.272 | 0.42 | 0.561 | 0.68 | 0.774 | 0.843 | 0.892 | 0.927 | 0.951 | 0.967 | 0.978 | 0.985 |
| 0.273 | 0.273 | 0.421 | 0.562 | 0.681 | 0.774 | 0.843 | 0.892 | 0.927 | 0.951 | 0.967 | 0.978 | 0.985 |
| 0.2735 | 0.274 | 0.421 | 0.562 | 0.681 | 0.774 | 0.843 | 0.892 | 0.927 | 0.951 | 0.967 | 0.978 | 0.985 |
| 0.274 | 0.274 | 0.422 | 0.562 | 0.681 | 0.774 | 0.843 | 0.893 | 0.927 | 0.951 | 0.967 | 0.978 | 0.985 |
| 0.2745 | 0.274 | 0.422 | 0.563 | 0.682 | 0.775 | 0.843 | 0.893 | 0.927 | 0.951 | 0.967 | 0.978 | 0.985 |
| 0.275 | 0.275 | 0.423 | 0.563 | 0.682 | 0.775 | 0.844 | 0.893 | 0.927 | 0.951 | 0.967 | 0.978 | 0.985 |
| 0.2755 | 0.276 | 0.423 | 0.564 | 0.683 | 0.775 | 0.844 | 0.893 | 0.927 | 0.951 | 0.967 | 0.978 | 0.985 |
| 0.276 | 0.276 | 0.424 | 0.564 | 0.683 | 0.775 | 0.844 | 0.893 | 0.927 | 0.951 | 0.967 | 0.978 | 0.985 |
| 0.2765 | 0.276 | 0.424 | 0.565 | 0.683 | 0.776 | 0.844 | 0.893 | 0.928 | 0.951 | 0.967 | 0.978 | 0.985 |
| 0.277 | 0.277 | 0.425 | 0.565 | 0.684 | 0.776 | 0.844 | 0.893 | 0.928 | 0.951 | 0.967 | 0.978 | 0.985 |
| 0.2775 | 0.278 | 0.425 | 0.566 | 0.684 | 0.776 | 0.845 | 0.894 | 0.928 | 0.951 | 0.967 | 0.978 | 0.985 |
| 0.278 | 0.278 | 0.426 | 0.566 | 0.684 | 0.777 | 0.845 | 0.894 | 0.928 | 0.951 | 0.967 | 0.978 | 0.985 |
| 0.2785 | 0.278 | 0.426 | 0.567 | 0.685 | 0.777 | 0.845 | 0.894 | 0.928 | 0.951 | 0.967 | 0.978 | 0.985 |
| 0.279 | 0.279 | 0.427 | 0.567 | 0.685 | 0.777 | 0.845 | 0.894 | 0.928 | 0.951 | 0.967 | 0.978 | 0.985 |
| 0.2795 | 0.28 | 0.427 | 0.567 | 0.685 | 0.777 | 0.845 | 0.894 | 0.928 | 0.951 | 0.967 | 0.978 | 0.985 |
| 0.28 | 0.28 | 0.428 | 0.568 | 0.686 | 0.778 | 0.846 | 0.894 | 0.928 | 0.952 | 0.967 | 0.978 | 0.985 |
| 0.2805 | 0.28 | 0.429 | 0.568 | 0.686 | 0.778 | 0.846 | 0.894 | 0.928 | 0.952 | 0.967 | 0.978 | 0.985 |
| 0.281 | 0.281 | 0.429 | 0.569 | 0.687 | 0.778 | 0.846 | 0.895 | 0.928 | 0.952 | 0.968 | 0.978 | 0.985 |
| 0.2815 | 0.282 | 0.43 | 0.569 | 0.687 | 0.778 | 0.846 | 0.895 | 0.928 | 0.952 | 0.968 | 0.978 | 0.985 |
| 0.282 | 0.282 | 0.43 | 0.57 | 0.687 | 0.779 | 0.846 | 0.895 | 0.929 | 0.952 | 0.968 | 0.978 | 0.985 |
| 0.2825 | 0.282 | 0.431 | 0.57 | 0.688 | 0.779 | 0.847 | 0.895 | 0.929 | 0.952 | 0.968 | 0.978 | 0.985 |
| 0.283 | 0.283 | 0.431 | 0.571 | 0.688 | 0.779 | 0.847 | 0.895 | 0.929 | 0.952 | 0.968 | 0.978 | 0.986 |
| 0.2835 | 0.284 | 0.432 | 0.571 | 0.688 | 0.78 | 0.847 | 0.895 | 0.929 | 0.952 | 0.968 | 0.978 | 0.986 |
| 0.284 | 0.284 | 0.432 | 0.572 | 0.689 | 0.78 | 0.847 | 0.895 | 0.929 | 0.952 | 0.968 | 0.978 | 0.986 |
| 0.2845 | 0.284 | 0.433 | 0.572 | 0.689 | 0.78 | 0.847 | 0.896 | 0.929 | 0.952 | 0.968 | 0.978 | 0.986 |
| 0.285 | 0.285 | 0.433 | 0.572 | 0.689 | 0.78 | 0.848 | 0.896 | 0.929 | 0.952 | 0.968 | 0.978 | 0.986 |
| 0.2855 | 0.286 | 0.434 | 0.573 | 0.69 | 0.781 | 0.848 | 0.896 | 0.929 | 0.952 | 0.968 | 0.978 | 0.986 |
| 0.286 | 0.286 | 0.434 | 0.573 | 0.69 | 0.781 | 0.848 | 0.896 | 0.929 | 0.952 | 0.968 | 0.979 | 0.986 |
| 0.2865 | 0.286 | 0.435 | 0.574 | 0.69 | 0.781 | 0.848 | 0.896 | 0.929 | 0.952 | 0.968 | 0.979 | 0.986 |
| 0.287 | 0.287 | 0.435 | 0.574 | 0.691 | 0.781 | 0.848 | 0.896 | 0.93 | 0.952 | 0.968 | 0.979 | 0.986 |
| 0.2875 | 0.288 | 0.436 | 0.575 | 0.691 | 0.782 | 0.849 | 0.896 | 0.93 | 0.953 | 0.968 | 0.979 | 0.986 |
| 0.288 | 0.288 | 0.436 | 0.575 | 0.692 | 0.782 | 0.849 | 0.896 | 0.93 | 0.953 | 0.968 | 0.979 | 0.986 |
| 0.2885 | 0.288 | 0.437 | 0.576 | 0.692 | 0.782 | 0.849 | 0.897 | 0.93 | 0.953 | 0.968 | 0.979 | 0.986 |
| 0.289 | 0.289 | 0.437 | 0.576 | 0.692 | 0.783 | 0.849 | 0.897 | 0.93 | 0.953 | 0.968 | 0.979 | 0.986 |
| 0.2895 | 0.29 | 0.438 | 0.576 | 0.693 | 0.783 | 0.849 | 0.897 | 0.93 | 0.953 | 0.968 | 0.979 | 0.986 |
| 0.29 | 0.29 | 0.438 | 0.577 | 0.693 | 0.783 | 0.85 | 0.897 | 0.93 | 0.953 | 0.968 | 0.979 | 0.986 |
| 0.2905 | 0.29 | 0.439 | 0.577 | 0.693 | 0.783 | 0.85 | 0.897 | 0.93 | 0.953 | 0.968 | 0.979 | 0.986 |
| 0.291 | 0.291 | 0.439 | 0.578 | 0.694 | 0.784 | 0.85 | 0.897 | 0.93 | 0.953 | 0.968 | 0.979 | 0.986 |
| 0.2915 | 0.292 | 0.44 | 0.578 | 0.694 | 0.784 | 0.85 | 0.897 | 0.93 | 0.953 | 0.968 | 0.979 | 0.986 |
| 0.292 | 0.292 | 0.44 | 0.579 | 0.694 | 0.784 | 0.85 | 0.898 | 0.93 | 0.953 | 0.968 | 0.979 | 0.986 |
| 0.2925 | 0.292 | 0.441 | 0.579 | 0.695 | 0.784 | 0.851 | 0.898 | 0.931 | 0.953 | 0.969 | 0.979 | 0.986 |
| 0.293 | 0.293 | 0.441 | 0.579 | 0.695 | 0.785 | 0.851 | 0.898 | 0.931 | 0.953 | 0.969 | 0.979 | 0.986 |
| 0.2935 | 0.294 | 0.442 | 0.58 | 0.695 | 0.785 | 0.851 | 0.898 | 0.931 | 0.953 | 0.969 | 0.979 | 0.986 |
| 0.294 | 0.294 | 0.442 | 0.58 | 0.696 | 0.785 | 0.851 | 0.898 | 0.931 | 0.953 | 0.969 | 0.979 | 0.986 |
| 0.2945 | 0.294 | 0.443 | 0.581 | 0.696 | 0.785 | 0.851 | 0.898 | 0.931 | 0.953 | 0.969 | 0.979 | 0.986 |
| 0.295 | 0.295 | 0.443 | 0.581 | 0.696 | 0.786 | 0.851 | 0.898 | 0.931 | 0.953 | 0.969 | 0.979 | 0.986 |
| 0.2955 | 0.296 | 0.444 | 0.582 | 0.697 | 0.786 | 0.852 | 0.899 | 0.931 | 0.954 | 0.969 | 0.979 | 0.986 |
| 0.296 | 0.296 | 0.444 | 0.582 | 0.697 | 0.786 | 0.852 | 0.899 | 0.931 | 0.954 | 0.969 | 0.979 | 0.986 |
| 0.2965 | 0.296 | 0.445 | 0.583 | 0.698 | 0.787 | 0.852 | 0.899 | 0.931 | 0.954 | 0.969 | 0.979 | 0.986 |
| 0.297 | 0.297 | 0.445 | 0.583 | 0.698 | 0.787 | 0.852 | 0.899 | 0.931 | 0.954 | 0.969 | 0.979 | 0.986 |
| 0.2975 | 0.298 | 0.446 | 0.583 | 0.698 | 0.787 | 0.852 | 0.899 | 0.932 | 0.954 | 0.969 | 0.979 | 0.986 |
| 0.298 | 0.298 | 0.446 | 0.584 | 0.699 | 0.787 | 0.853 | 0.899 | 0.932 | 0.954 | 0.969 | 0.979 | 0.986 |
| 0.2985 | 0.298 | 0.447 | 0.584 | 0.699 | 0.788 | 0.853 | 0.899 | 0.932 | 0.954 | 0.969 | 0.979 | 0.986 |
| 0.299 | 0.299 | 0.447 | 0.585 | 0.699 | 0.788 | 0.853 | 0.899 | 0.932 | 0.954 | 0.969 | 0.979 | 0.986 |
| 0.2995 | 0.3 | 0.448 | 0.585 | 0.7 | 0.788 | 0.853 | 0.9 | 0.932 | 0.954 | 0.969 | 0.979 | 0.986 |
| 0.3 | 0.3 | 0.448 | 0.586 | 0.7 | 0.788 | 0.853 | 0.9 | 0.932 | 0.954 | 0.969 | 0.979 | 0.986 |
| 0.3005 | 0.3 | 0.449 | 0.586 | 0.7 | 0.789 | 0.854 | 0.9 | 0.932 | 0.954 | 0.969 | 0.979 | 0.986 |
| 0.301 | 0.301 | 0.449 | 0.586 | 0.701 | 0.789 | 0.854 | 0.9 | 0.932 | 0.954 | 0.969 | 0.979 | 0.986 |
| 0.3015 | 0.302 | 0.45 | 0.587 | 0.701 | 0.789 | 0.854 | 0.9 | 0.932 | 0.954 | 0.969 | 0.979 | 0.986 |
| 0.302 | 0.302 | 0.45 | 0.587 | 0.701 | 0.789 | 0.854 | 0.9 | 0.932 | 0.954 | 0.969 | 0.979 | 0.986 |
| 0.3025 | 0.302 | 0.451 | 0.588 | 0.702 | 0.79 | 0.854 | 0.9 | 0.932 | 0.954 | 0.969 | 0.979 | 0.986 |
| 0.303 | 0.303 | 0.451 | 0.588 | 0.702 | 0.79 | 0.855 | 0.9 | 0.933 | 0.954 | 0.969 | 0.98 | 0.986 |
| 0.3035 | 0.304 | 0.452 | 0.589 | 0.702 | 0.79 | 0.855 | 0.901 | 0.933 | 0.955 | 0.969 | 0.98 | 0.986 |
| 0.304 | 0.304 | 0.452 | 0.589 | 0.703 | 0.79 | 0.855 | 0.901 | 0.933 | 0.955 | 0.97 | 0.98 | 0.986 |
| 0.3045 | 0.304 | 0.453 | 0.589 | 0.703 | 0.791 | 0.855 | 0.901 | 0.933 | 0.955 | 0.97 | 0.98 | 0.986 |
| 0.305 | 0.305 | 0.453 | 0.59 | 0.703 | 0.791 | 0.855 | 0.901 | 0.933 | 0.955 | 0.97 | 0.98 | 0.986 |
| 0.3055 | 0.306 | 0.454 | 0.59 | 0.704 | 0.791 | 0.855 | 0.901 | 0.933 | 0.955 | 0.97 | 0.98 | 0.986 |
| 0.306 | 0.306 | 0.454 | 0.591 | 0.704 | 0.791 | 0.856 | 0.901 | 0.933 | 0.955 | 0.97 | 0.98 | 0.986 |
| 0.3065 | 0.306 | 0.455 | 0.591 | 0.704 | 0.792 | 0.856 | 0.901 | 0.933 | 0.955 | 0.97 | 0.98 | 0.986 |
| 0.307 | 0.307 | 0.455 | 0.592 | 0.705 | 0.792 | 0.856 | 0.902 | 0.933 | 0.955 | 0.97 | 0.98 | 0.986 |
| 0.3075 | 0.308 | 0.456 | 0.592 | 0.705 | 0.792 | 0.856 | 0.902 | 0.933 | 0.955 | 0.97 | 0.98 | 0.986 |
| 0.308 | 0.308 | 0.456 | 0.593 | 0.705 | 0.792 | 0.856 | 0.902 | 0.933 | 0.955 | 0.97 | 0.98 | 0.986 |
| 0.3085 | 0.308 | 0.457 | 0.593 | 0.706 | 0.793 | 0.857 | 0.902 | 0.933 | 0.955 | 0.97 | 0.98 | 0.986 |
| 0.309 | 0.309 | 0.457 | 0.593 | 0.706 | 0.793 | 0.857 | 0.902 | 0.934 | 0.955 | 0.97 | 0.98 | 0.987 |
| 0.3095 | 0.31 | 0.458 | 0.594 | 0.706 | 0.793 | 0.857 | 0.902 | 0.934 | 0.955 | 0.97 | 0.98 | 0.987 |
| 0.31 | 0.31 | 0.458 | 0.594 | 0.707 | 0.793 | 0.857 | 0.902 | 0.934 | 0.955 | 0.97 | 0.98 | 0.987 |
| 0.3105 | 0.31 | 0.459 | 0.595 | 0.707 | 0.794 | 0.857 | 0.902 | 0.934 | 0.955 | 0.97 | 0.98 | 0.987 |
| 0.311 | 0.311 | 0.459 | 0.595 | 0.707 | 0.794 | 0.857 | 0.903 | 0.934 | 0.955 | 0.97 | 0.98 | 0.987 |
| 0.3115 | 0.312 | 0.46 | 0.595 | 0.708 | 0.794 | 0.858 | 0.903 | 0.934 | 0.956 | 0.97 | 0.98 | 0.987 |
| 0.312 | 0.312 | 0.46 | 0.596 | 0.708 | 0.794 | 0.858 | 0.903 | 0.934 | 0.956 | 0.97 | 0.98 | 0.987 |
| 0.3125 | 0.312 | 0.461 | 0.596 | 0.708 | 0.795 | 0.858 | 0.903 | 0.934 | 0.956 | 0.97 | 0.98 | 0.987 |
| 0.313 | 0.313 | 0.461 | 0.597 | 0.709 | 0.795 | 0.858 | 0.903 | 0.934 | 0.956 | 0.97 | 0.98 | 0.987 |
| 0.3135 | 0.314 | 0.461 | 0.597 | 0.709 | 0.795 | 0.858 | 0.903 | 0.934 | 0.956 | 0.97 | 0.98 | 0.987 |
| 0.314 | 0.314 | 0.462 | 0.598 | 0.709 | 0.795 | 0.859 | 0.903 | 0.934 | 0.956 | 0.97 | 0.98 | 0.987 |
| 0.3145 | 0.314 | 0.462 | 0.598 | 0.71 | 0.796 | 0.859 | 0.903 | 0.935 | 0.956 | 0.97 | 0.98 | 0.987 |
| 0.315 | 0.315 | 0.463 | 0.598 | 0.71 | 0.796 | 0.859 | 0.904 | 0.935 | 0.956 | 0.97 | 0.98 | 0.987 |
| 0.3155 | 0.316 | 0.463 | 0.599 | 0.71 | 0.796 | 0.859 | 0.904 | 0.935 | 0.956 | 0.97 | 0.98 | 0.987 |
| 0.316 | 0.316 | 0.464 | 0.599 | 0.711 | 0.796 | 0.859 | 0.904 | 0.935 | 0.956 | 0.97 | 0.98 | 0.987 |
| 0.3165 | 0.316 | 0.464 | 0.6 | 0.711 | 0.797 | 0.859 | 0.904 | 0.935 | 0.956 | 0.971 | 0.98 | 0.987 |
| 0.317 | 0.317 | 0.465 | 0.6 | 0.711 | 0.797 | 0.86 | 0.904 | 0.935 | 0.956 | 0.971 | 0.98 | 0.987 |
| 0.3175 | 0.318 | 0.465 | 0.601 | 0.712 | 0.797 | 0.86 | 0.904 | 0.935 | 0.956 | 0.971 | 0.98 | 0.987 |
| 0.318 | 0.318 | 0.466 | 0.601 | 0.712 | 0.797 | 0.86 | 0.904 | 0.935 | 0.956 | 0.971 | 0.98 | 0.987 |
| 0.3185 | 0.318 | 0.466 | 0.601 | 0.712 | 0.798 | 0.86 | 0.904 | 0.935 | 0.956 | 0.971 | 0.98 | 0.987 |
| 0.319 | 0.319 | 0.467 | 0.602 | 0.713 | 0.798 | 0.86 | 0.905 | 0.935 | 0.956 | 0.971 | 0.98 | 0.987 |
| 0.3195 | 0.32 | 0.467 | 0.602 | 0.713 | 0.798 | 0.86 | 0.905 | 0.935 | 0.956 | 0.971 | 0.98 | 0.987 |
| 0.32 | 0.32 | 0.468 | 0.603 | 0.713 | 0.798 | 0.861 | 0.905 | 0.935 | 0.957 | 0.971 | 0.98 | 0.987 |
| 0.3205 | 0.32 | 0.468 | 0.603 | 0.714 | 0.799 | 0.861 | 0.905 | 0.936 | 0.957 | 0.971 | 0.98 | 0.987 |
| 0.321 | 0.321 | 0.469 | 0.603 | 0.714 | 0.799 | 0.861 | 0.905 | 0.936 | 0.957 | 0.971 | 0.98 | 0.987 |
| 0.3215 | 0.322 | 0.469 | 0.604 | 0.714 | 0.799 | 0.861 | 0.905 | 0.936 | 0.957 | 0.971 | 0.981 | 0.987 |
| 0.322 | 0.322 | 0.47 | 0.604 | 0.715 | 0.799 | 0.861 | 0.905 | 0.936 | 0.957 | 0.971 | 0.981 | 0.987 |
| 0.3225 | 0.322 | 0.47 | 0.605 | 0.715 | 0.8 | 0.862 | 0.905 | 0.936 | 0.957 | 0.971 | 0.981 | 0.987 |
| 0.323 | 0.323 | 0.471 | 0.605 | 0.715 | 0.8 | 0.862 | 0.906 | 0.936 | 0.957 | 0.971 | 0.981 | 0.987 |
| 0.3235 | 0.324 | 0.471 | 0.606 | 0.716 | 0.8 | 0.862 | 0.906 | 0.936 | 0.957 | 0.971 | 0.981 | 0.987 |
| 0.324 | 0.324 | 0.472 | 0.606 | 0.716 | 0.8 | 0.862 | 0.906 | 0.936 | 0.957 | 0.971 | 0.981 | 0.987 |
| 0.3245 | 0.324 | 0.472 | 0.606 | 0.716 | 0.801 | 0.862 | 0.906 | 0.936 | 0.957 | 0.971 | 0.981 | 0.987 |
| 0.325 | 0.325 | 0.473 | 0.607 | 0.717 | 0.801 | 0.862 | 0.906 | 0.936 | 0.957 | 0.971 | 0.981 | 0.987 |
| 0.3255 | 0.326 | 0.473 | 0.607 | 0.717 | 0.801 | 0.863 | 0.906 | 0.936 | 0.957 | 0.971 | 0.981 | 0.987 |
| 0.326 | 0.326 | 0.474 | 0.608 | 0.717 | 0.801 | 0.863 | 0.906 | 0.937 | 0.957 | 0.971 | 0.981 | 0.987 |
| 0.3265 | 0.326 | 0.474 | 0.608 | 0.718 | 0.802 | 0.863 | 0.906 | 0.937 | 0.957 | 0.971 | 0.981 | 0.987 |
| 0.327 | 0.327 | 0.475 | 0.608 | 0.718 | 0.802 | 0.863 | 0.907 | 0.937 | 0.957 | 0.971 | 0.981 | 0.987 |
| 0.3275 | 0.328 | 0.475 | 0.609 | 0.718 | 0.802 | 0.863 | 0.907 | 0.937 | 0.957 | 0.971 | 0.981 | 0.987 |
| 0.328 | 0.328 | 0.476 | 0.609 | 0.719 | 0.802 | 0.863 | 0.907 | 0.937 | 0.957 | 0.971 | 0.981 | 0.987 |
| 0.3285 | 0.328 | 0.476 | 0.61 | 0.719 | 0.803 | 0.864 | 0.907 | 0.937 | 0.957 | 0.971 | 0.981 | 0.987 |
| 0.329 | 0.329 | 0.477 | 0.61 | 0.719 | 0.803 | 0.864 | 0.907 | 0.937 | 0.958 | 0.971 | 0.981 | 0.987 |
| 0.3295 | 0.33 | 0.477 | 0.611 | 0.72 | 0.803 | 0.864 | 0.907 | 0.937 | 0.958 | 0.972 | 0.981 | 0.987 |
| 0.33 | 0.33 | 0.478 | 0.611 | 0.72 | 0.803 | 0.864 | 0.907 | 0.937 | 0.958 | 0.972 | 0.981 | 0.987 |
| 0.3305 | 0.33 | 0.478 | 0.611 | 0.72 | 0.804 | 0.864 | 0.907 | 0.937 | 0.958 | 0.972 | 0.981 | 0.987 |
| 0.331 | 0.331 | 0.479 | 0.612 | 0.721 | 0.804 | 0.865 | 0.907 | 0.937 | 0.958 | 0.972 | 0.981 | 0.987 |
| 0.3315 | 0.332 | 0.479 | 0.612 | 0.721 | 0.804 | 0.865 | 0.908 | 0.937 | 0.958 | 0.972 | 0.981 | 0.987 |
| 0.332 | 0.332 | 0.479 | 0.613 | 0.721 | 0.804 | 0.865 | 0.908 | 0.938 | 0.958 | 0.972 | 0.981 | 0.987 |
| 0.3325 | 0.332 | 0.48 | 0.613 | 0.722 | 0.805 | 0.865 | 0.908 | 0.938 | 0.958 | 0.972 | 0.981 | 0.987 |
| 0.333 | 0.333 | 0.48 | 0.613 | 0.722 | 0.805 | 0.865 | 0.908 | 0.938 | 0.958 | 0.972 | 0.981 | 0.987 |
| 0.3335 | 0.334 | 0.481 | 0.614 | 0.722 | 0.805 | 0.865 | 0.908 | 0.938 | 0.958 | 0.972 | 0.981 | 0.987 |
| 0.334 | 0.334 | 0.481 | 0.614 | 0.723 | 0.805 | 0.866 | 0.908 | 0.938 | 0.958 | 0.972 | 0.981 | 0.987 |
| 0.3345 | 0.334 | 0.482 | 0.615 | 0.723 | 0.805 | 0.866 | 0.908 | 0.938 | 0.958 | 0.972 | 0.981 | 0.987 |
| 0.335 | 0.335 | 0.482 | 0.615 | 0.723 | 0.806 | 0.866 | 0.908 | 0.938 | 0.958 | 0.972 | 0.981 | 0.987 |
| 0.3355 | 0.336 | 0.483 | 0.615 | 0.724 | 0.806 | 0.866 | 0.909 | 0.938 | 0.958 | 0.972 | 0.981 | 0.987 |
| 0.336 | 0.336 | 0.483 | 0.616 | 0.724 | 0.806 | 0.866 | 0.909 | 0.938 | 0.958 | 0.972 | 0.981 | 0.987 |
| 0.3365 | 0.336 | 0.484 | 0.616 | 0.724 | 0.806 | 0.866 | 0.909 | 0.938 | 0.958 | 0.972 | 0.981 | 0.987 |
| 0.337 | 0.337 | 0.484 | 0.617 | 0.725 | 0.807 | 0.867 | 0.909 | 0.938 | 0.958 | 0.972 | 0.981 | 0.988 |
| 0.3375 | 0.338 | 0.485 | 0.617 | 0.725 | 0.807 | 0.867 | 0.909 | 0.938 | 0.959 | 0.972 | 0.981 | 0.988 |
| 0.338 | 0.338 | 0.485 | 0.617 | 0.725 | 0.807 | 0.867 | 0.909 | 0.938 | 0.959 | 0.972 | 0.981 | 0.988 |
| 0.3385 | 0.338 | 0.486 | 0.618 | 0.725 | 0.807 | 0.867 | 0.909 | 0.939 | 0.959 | 0.972 | 0.981 | 0.988 |
| 0.339 | 0.339 | 0.486 | 0.618 | 0.726 | 0.808 | 0.867 | 0.909 | 0.939 | 0.959 | 0.972 | 0.981 | 0.988 |
| 0.3395 | 0.34 | 0.487 | 0.619 | 0.726 | 0.808 | 0.867 | 0.91 | 0.939 | 0.959 | 0.972 | 0.981 | 0.988 |
| 0.34 | 0.34 | 0.487 | 0.619 | 0.726 | 0.808 | 0.868 | 0.91 | 0.939 | 0.959 | 0.972 | 0.981 | 0.988 |
| 0.3405 | 0.34 | 0.488 | 0.62 | 0.727 | 0.808 | 0.868 | 0.91 | 0.939 | 0.959 | 0.972 | 0.981 | 0.988 |
| 0.341 | 0.341 | 0.488 | 0.62 | 0.727 | 0.809 | 0.868 | 0.91 | 0.939 | 0.959 | 0.972 | 0.982 | 0.988 |
| 0.3415 | 0.342 | 0.489 | 0.62 | 0.727 | 0.809 | 0.868 | 0.91 | 0.939 | 0.959 | 0.972 | 0.982 | 0.988 |
| 0.342 | 0.342 | 0.489 | 0.621 | 0.728 | 0.809 | 0.868 | 0.91 | 0.939 | 0.959 | 0.972 | 0.982 | 0.988 |
| 0.3425 | 0.342 | 0.49 | 0.621 | 0.728 | 0.809 | 0.868 | 0.91 | 0.939 | 0.959 | 0.973 | 0.982 | 0.988 |
| 0.343 | 0.343 | 0.49 | 0.622 | 0.728 | 0.809 | 0.869 | 0.91 | 0.939 | 0.959 | 0.973 | 0.982 | 0.988 |
| 0.3435 | 0.344 | 0.49 | 0.622 | 0.729 | 0.81 | 0.869 | 0.91 | 0.939 | 0.959 | 0.973 | 0.982 | 0.988 |
| 0.344 | 0.344 | 0.491 | 0.622 | 0.729 | 0.81 | 0.869 | 0.911 | 0.939 | 0.959 | 0.973 | 0.982 | 0.988 |
| 0.3445 | 0.344 | 0.491 | 0.623 | 0.729 | 0.81 | 0.869 | 0.911 | 0.94 | 0.959 | 0.973 | 0.982 | 0.988 |
| 0.345 | 0.345 | 0.492 | 0.623 | 0.73 | 0.81 | 0.869 | 0.911 | 0.94 | 0.959 | 0.973 | 0.982 | 0.988 |
| 0.3455 | 0.346 | 0.492 | 0.624 | 0.73 | 0.811 | 0.869 | 0.911 | 0.94 | 0.959 | 0.973 | 0.982 | 0.988 |
| 0.346 | 0.346 | 0.493 | 0.624 | 0.73 | 0.811 | 0.87 | 0.911 | 0.94 | 0.959 | 0.973 | 0.982 | 0.988 |
| 0.3465 | 0.346 | 0.493 | 0.624 | 0.73 | 0.811 | 0.87 | 0.911 | 0.94 | 0.959 | 0.973 | 0.982 | 0.988 |
| 0.347 | 0.347 | 0.494 | 0.625 | 0.731 | 0.811 | 0.87 | 0.911 | 0.94 | 0.96 | 0.973 | 0.982 | 0.988 |
| 0.3475 | 0.348 | 0.494 | 0.625 | 0.731 | 0.812 | 0.87 | 0.911 | 0.94 | 0.96 | 0.973 | 0.982 | 0.988 |
| 0.348 | 0.348 | 0.495 | 0.626 | 0.731 | 0.812 | 0.87 | 0.911 | 0.94 | 0.96 | 0.973 | 0.982 | 0.988 |
| 0.3485 | 0.348 | 0.495 | 0.626 | 0.732 | 0.812 | 0.87 | 0.912 | 0.94 | 0.96 | 0.973 | 0.982 | 0.988 |
| 0.349 | 0.349 | 0.496 | 0.626 | 0.732 | 0.812 | 0.871 | 0.912 | 0.94 | 0.96 | 0.973 | 0.982 | 0.988 |
| 0.3495 | 0.35 | 0.496 | 0.627 | 0.732 | 0.812 | 0.871 | 0.912 | 0.94 | 0.96 | 0.973 | 0.982 | 0.988 |
| 0.35 | 0.35 | 0.497 | 0.627 | 0.733 | 0.813 | 0.871 | 0.912 | 0.94 | 0.96 | 0.973 | 0.982 | 0.988 |
| 0.3505 | 0.35 | 0.497 | 0.628 | 0.733 | 0.813 | 0.871 | 0.912 | 0.94 | 0.96 | 0.973 | 0.982 | 0.988 |
| 0.351 | 0.351 | 0.498 | 0.628 | 0.733 | 0.813 | 0.871 | 0.912 | 0.941 | 0.96 | 0.973 | 0.982 | 0.988 |
| 0.3515 | 0.352 | 0.498 | 0.628 | 0.734 | 0.813 | 0.871 | 0.912 | 0.941 | 0.96 | 0.973 | 0.982 | 0.988 |
| 0.352 | 0.352 | 0.499 | 0.629 | 0.734 | 0.814 | 0.872 | 0.912 | 0.941 | 0.96 | 0.973 | 0.982 | 0.988 |
| 0.3525 | 0.352 | 0.499 | 0.629 | 0.734 | 0.814 | 0.872 | 0.913 | 0.941 | 0.96 | 0.973 | 0.982 | 0.988 |
| 0.353 | 0.353 | 0.499 | 0.63 | 0.735 | 0.814 | 0.872 | 0.913 | 0.941 | 0.96 | 0.973 | 0.982 | 0.988 |
| 0.3535 | 0.354 | 0.5 | 0.63 | 0.735 | 0.814 | 0.872 | 0.913 | 0.941 | 0.96 | 0.973 | 0.982 | 0.988 |
| 0.354 | 0.354 | 0.5 | 0.63 | 0.735 | 0.815 | 0.872 | 0.913 | 0.941 | 0.96 | 0.973 | 0.982 | 0.988 |
| 0.3545 | 0.354 | 0.501 | 0.631 | 0.735 | 0.815 | 0.872 | 0.913 | 0.941 | 0.96 | 0.973 | 0.982 | 0.988 |
| 0.355 | 0.355 | 0.501 | 0.631 | 0.736 | 0.815 | 0.873 | 0.913 | 0.941 | 0.96 | 0.973 | 0.982 | 0.988 |
| 0.3555 | 0.356 | 0.502 | 0.631 | 0.736 | 0.815 | 0.873 | 0.913 | 0.941 | 0.96 | 0.973 | 0.982 | 0.988 |
| 0.356 | 0.356 | 0.502 | 0.632 | 0.736 | 0.815 | 0.873 | 0.913 | 0.941 | 0.961 | 0.973 | 0.982 | 0.988 |
| 0.3565 | 0.356 | 0.503 | 0.632 | 0.737 | 0.816 | 0.873 | 0.913 | 0.941 | 0.961 | 0.974 | 0.982 | 0.988 |
| 0.357 | 0.357 | 0.503 | 0.633 | 0.737 | 0.816 | 0.873 | 0.914 | 0.941 | 0.961 | 0.974 | 0.982 | 0.988 |
| 0.3575 | 0.358 | 0.504 | 0.633 | 0.737 | 0.816 | 0.873 | 0.914 | 0.942 | 0.961 | 0.974 | 0.982 | 0.988 |
| 0.358 | 0.358 | 0.504 | 0.633 | 0.738 | 0.816 | 0.873 | 0.914 | 0.942 | 0.961 | 0.974 | 0.982 | 0.988 |
| 0.3585 | 0.358 | 0.505 | 0.634 | 0.738 | 0.817 | 0.874 | 0.914 | 0.942 | 0.961 | 0.974 | 0.982 | 0.988 |
| 0.359 | 0.359 | 0.505 | 0.634 | 0.738 | 0.817 | 0.874 | 0.914 | 0.942 | 0.961 | 0.974 | 0.982 | 0.988 |
| 0.3595 | 0.36 | 0.506 | 0.635 | 0.739 | 0.817 | 0.874 | 0.914 | 0.942 | 0.961 | 0.974 | 0.982 | 0.988 |
| 0.36 | 0.36 | 0.506 | 0.635 | 0.739 | 0.817 | 0.874 | 0.914 | 0.942 | 0.961 | 0.974 | 0.982 | 0.988 |
| 0.3605 | 0.36 | 0.507 | 0.635 | 0.739 | 0.817 | 0.874 | 0.914 | 0.942 | 0.961 | 0.974 | 0.982 | 0.988 |
| 0.361 | 0.361 | 0.507 | 0.636 | 0.739 | 0.818 | 0.874 | 0.914 | 0.942 | 0.961 | 0.974 | 0.982 | 0.988 |
| 0.3615 | 0.362 | 0.507 | 0.636 | 0.74 | 0.818 | 0.875 | 0.915 | 0.942 | 0.961 | 0.974 | 0.983 | 0.988 |
| 0.362 | 0.362 | 0.508 | 0.637 | 0.74 | 0.818 | 0.875 | 0.915 | 0.942 | 0.961 | 0.974 | 0.983 | 0.988 |
| 0.3625 | 0.362 | 0.508 | 0.637 | 0.74 | 0.818 | 0.875 | 0.915 | 0.942 | 0.961 | 0.974 | 0.983 | 0.988 |
| 0.363 | 0.363 | 0.509 | 0.637 | 0.741 | 0.819 | 0.875 | 0.915 | 0.942 | 0.961 | 0.974 | 0.983 | 0.988 |
| 0.3635 | 0.364 | 0.509 | 0.638 | 0.741 | 0.819 | 0.875 | 0.915 | 0.942 | 0.961 | 0.974 | 0.983 | 0.988 |
| 0.364 | 0.364 | 0.51 | 0.638 | 0.741 | 0.819 | 0.875 | 0.915 | 0.943 | 0.961 | 0.974 | 0.983 | 0.988 |
| 0.3645 | 0.364 | 0.51 | 0.639 | 0.742 | 0.819 | 0.876 | 0.915 | 0.943 | 0.961 | 0.974 | 0.983 | 0.988 |
| 0.365 | 0.365 | 0.511 | 0.639 | 0.742 | 0.819 | 0.876 | 0.915 | 0.943 | 0.961 | 0.974 | 0.983 | 0.988 |
| 0.3655 | 0.366 | 0.511 | 0.639 | 0.742 | 0.82 | 0.876 | 0.915 | 0.943 | 0.961 | 0.974 | 0.983 | 0.988 |
| 0.366 | 0.366 | 0.512 | 0.64 | 0.742 | 0.82 | 0.876 | 0.916 | 0.943 | 0.962 | 0.974 | 0.983 | 0.988 |
| 0.3665 | 0.366 | 0.512 | 0.64 | 0.743 | 0.82 | 0.876 | 0.916 | 0.943 | 0.962 | 0.974 | 0.983 | 0.988 |
| 0.367 | 0.367 | 0.513 | 0.64 | 0.743 | 0.82 | 0.876 | 0.916 | 0.943 | 0.962 | 0.974 | 0.983 | 0.988 |
| 0.3675 | 0.368 | 0.513 | 0.641 | 0.743 | 0.821 | 0.876 | 0.916 | 0.943 | 0.962 | 0.974 | 0.983 | 0.988 |
| 0.368 | 0.368 | 0.514 | 0.641 | 0.744 | 0.821 | 0.877 | 0.916 | 0.943 | 0.962 | 0.974 | 0.983 | 0.989 |
| 0.3685 | 0.368 | 0.514 | 0.642 | 0.744 | 0.821 | 0.877 | 0.916 | 0.943 | 0.962 | 0.974 | 0.983 | 0.989 |
| 0.369 | 0.369 | 0.514 | 0.642 | 0.744 | 0.821 | 0.877 | 0.916 | 0.943 | 0.962 | 0.974 | 0.983 | 0.989 |
| 0.3695 | 0.37 | 0.515 | 0.642 | 0.745 | 0.821 | 0.877 | 0.916 | 0.943 | 0.962 | 0.974 | 0.983 | 0.989 |
| 0.37 | 0.37 | 0.515 | 0.643 | 0.745 | 0.822 | 0.877 | 0.916 | 0.943 | 0.962 | 0.974 | 0.983 | 0.989 |
| 0.3705 | 0.37 | 0.516 | 0.643 | 0.745 | 0.822 | 0.877 | 0.917 | 0.944 | 0.962 | 0.975 | 0.983 | 0.989 |
| 0.371 | 0.371 | 0.516 | 0.644 | 0.745 | 0.822 | 0.878 | 0.917 | 0.944 | 0.962 | 0.975 | 0.983 | 0.989 |
| 0.3715 | 0.372 | 0.517 | 0.644 | 0.746 | 0.822 | 0.878 | 0.917 | 0.944 | 0.962 | 0.975 | 0.983 | 0.989 |
| 0.372 | 0.372 | 0.517 | 0.644 | 0.746 | 0.823 | 0.878 | 0.917 | 0.944 | 0.962 | 0.975 | 0.983 | 0.989 |
| 0.3725 | 0.372 | 0.518 | 0.645 | 0.746 | 0.823 | 0.878 | 0.917 | 0.944 | 0.962 | 0.975 | 0.983 | 0.989 |
| 0.373 | 0.373 | 0.518 | 0.645 | 0.747 | 0.823 | 0.878 | 0.917 | 0.944 | 0.962 | 0.975 | 0.983 | 0.989 |
| 0.3735 | 0.374 | 0.519 | 0.646 | 0.747 | 0.823 | 0.878 | 0.917 | 0.944 | 0.962 | 0.975 | 0.983 | 0.989 |
| 0.374 | 0.374 | 0.519 | 0.646 | 0.747 | 0.823 | 0.879 | 0.917 | 0.944 | 0.962 | 0.975 | 0.983 | 0.989 |
| 0.3745 | 0.374 | 0.52 | 0.646 | 0.748 | 0.824 | 0.879 | 0.917 | 0.944 | 0.962 | 0.975 | 0.983 | 0.989 |
| 0.375 | 0.375 | 0.52 | 0.647 | 0.748 | 0.824 | 0.879 | 0.917 | 0.944 | 0.962 | 0.975 | 0.983 | 0.989 |
| 0.3755 | 0.376 | 0.52 | 0.647 | 0.748 | 0.824 | 0.879 | 0.918 | 0.944 | 0.963 | 0.975 | 0.983 | 0.989 |
| 0.376 | 0.376 | 0.521 | 0.647 | 0.748 | 0.824 | 0.879 | 0.918 | 0.944 | 0.963 | 0.975 | 0.983 | 0.989 |
| 0.3765 | 0.376 | 0.521 | 0.648 | 0.749 | 0.825 | 0.879 | 0.918 | 0.944 | 0.963 | 0.975 | 0.983 | 0.989 |
| 0.377 | 0.377 | 0.522 | 0.648 | 0.749 | 0.825 | 0.879 | 0.918 | 0.945 | 0.963 | 0.975 | 0.983 | 0.989 |
| 0.3775 | 0.378 | 0.522 | 0.649 | 0.749 | 0.825 | 0.88 | 0.918 | 0.945 | 0.963 | 0.975 | 0.983 | 0.989 |
| 0.378 | 0.378 | 0.523 | 0.649 | 0.75 | 0.825 | 0.88 | 0.918 | 0.945 | 0.963 | 0.975 | 0.983 | 0.989 |
| 0.3785 | 0.378 | 0.523 | 0.649 | 0.75 | 0.825 | 0.88 | 0.918 | 0.945 | 0.963 | 0.975 | 0.983 | 0.989 |
| 0.379 | 0.379 | 0.524 | 0.65 | 0.75 | 0.826 | 0.88 | 0.918 | 0.945 | 0.963 | 0.975 | 0.983 | 0.989 |
| 0.3795 | 0.38 | 0.524 | 0.65 | 0.75 | 0.826 | 0.88 | 0.918 | 0.945 | 0.963 | 0.975 | 0.983 | 0.989 |
| 0.38 | 0.38 | 0.525 | 0.65 | 0.751 | 0.826 | 0.88 | 0.919 | 0.945 | 0.963 | 0.975 | 0.983 | 0.989 |
| 0.3805 | 0.38 | 0.525 | 0.651 | 0.751 | 0.826 | 0.881 | 0.919 | 0.945 | 0.963 | 0.975 | 0.983 | 0.989 |
| 0.381 | 0.381 | 0.526 | 0.651 | 0.751 | 0.826 | 0.881 | 0.919 | 0.945 | 0.963 | 0.975 | 0.983 | 0.989 |
| 0.3815 | 0.382 | 0.526 | 0.652 | 0.752 | 0.827 | 0.881 | 0.919 | 0.945 | 0.963 | 0.975 | 0.983 | 0.989 |
| 0.382 | 0.382 | 0.526 | 0.652 | 0.752 | 0.827 | 0.881 | 0.919 | 0.945 | 0.963 | 0.975 | 0.983 | 0.989 |
| 0.3825 | 0.382 | 0.527 | 0.652 | 0.752 | 0.827 | 0.881 | 0.919 | 0.945 | 0.963 | 0.975 | 0.983 | 0.989 |
| 0.383 | 0.383 | 0.527 | 0.653 | 0.752 | 0.827 | 0.881 | 0.919 | 0.945 | 0.963 | 0.975 | 0.983 | 0.989 |
| 0.3835 | 0.384 | 0.528 | 0.653 | 0.753 | 0.828 | 0.881 | 0.919 | 0.945 | 0.963 | 0.975 | 0.984 | 0.989 |
| 0.384 | 0.384 | 0.528 | 0.654 | 0.753 | 0.828 | 0.882 | 0.919 | 0.946 | 0.963 | 0.975 | 0.984 | 0.989 |
| 0.3845 | 0.384 | 0.529 | 0.654 | 0.753 | 0.828 | 0.882 | 0.92 | 0.946 | 0.963 | 0.975 | 0.984 | 0.989 |
| 0.385 | 0.385 | 0.529 | 0.654 | 0.754 | 0.828 | 0.882 | 0.92 | 0.946 | 0.963 | 0.975 | 0.984 | 0.989 |
| 0.3855 | 0.386 | 0.53 | 0.655 | 0.754 | 0.828 | 0.882 | 0.92 | 0.946 | 0.963 | 0.976 | 0.984 | 0.989 |
| 0.386 | 0.386 | 0.53 | 0.655 | 0.754 | 0.829 | 0.882 | 0.92 | 0.946 | 0.964 | 0.976 | 0.984 | 0.989 |
| 0.3865 | 0.386 | 0.531 | 0.655 | 0.755 | 0.829 | 0.882 | 0.92 | 0.946 | 0.964 | 0.976 | 0.984 | 0.989 |
| 0.387 | 0.387 | 0.531 | 0.656 | 0.755 | 0.829 | 0.882 | 0.92 | 0.946 | 0.964 | 0.976 | 0.984 | 0.989 |
| 0.3875 | 0.388 | 0.532 | 0.656 | 0.755 | 0.829 | 0.883 | 0.92 | 0.946 | 0.964 | 0.976 | 0.984 | 0.989 |
| 0.388 | 0.388 | 0.532 | 0.657 | 0.755 | 0.829 | 0.883 | 0.92 | 0.946 | 0.964 | 0.976 | 0.984 | 0.989 |
| 0.3885 | 0.388 | 0.532 | 0.657 | 0.756 | 0.83 | 0.883 | 0.92 | 0.946 | 0.964 | 0.976 | 0.984 | 0.989 |
| 0.389 | 0.389 | 0.533 | 0.657 | 0.756 | 0.83 | 0.883 | 0.92 | 0.946 | 0.964 | 0.976 | 0.984 | 0.989 |
| 0.3895 | 0.39 | 0.533 | 0.658 | 0.756 | 0.83 | 0.883 | 0.921 | 0.946 | 0.964 | 0.976 | 0.984 | 0.989 |
| 0.39 | 0.39 | 0.534 | 0.658 | 0.757 | 0.83 | 0.883 | 0.921 | 0.946 | 0.964 | 0.976 | 0.984 | 0.989 |
| 0.3905 | 0.39 | 0.534 | 0.658 | 0.757 | 0.83 | 0.884 | 0.921 | 0.946 | 0.964 | 0.976 | 0.984 | 0.989 |
| 0.391 | 0.391 | 0.535 | 0.659 | 0.757 | 0.831 | 0.884 | 0.921 | 0.947 | 0.964 | 0.976 | 0.984 | 0.989 |
| 0.3915 | 0.392 | 0.535 | 0.659 | 0.757 | 0.831 | 0.884 | 0.921 | 0.947 | 0.964 | 0.976 | 0.984 | 0.989 |
| 0.392 | 0.392 | 0.536 | 0.66 | 0.758 | 0.831 | 0.884 | 0.921 | 0.947 | 0.964 | 0.976 | 0.984 | 0.989 |
| 0.3925 | 0.392 | 0.536 | 0.66 | 0.758 | 0.831 | 0.884 | 0.921 | 0.947 | 0.964 | 0.976 | 0.984 | 0.989 |
| 0.393 | 0.393 | 0.537 | 0.66 | 0.758 | 0.832 | 0.884 | 0.921 | 0.947 | 0.964 | 0.976 | 0.984 | 0.989 |
| 0.3935 | 0.394 | 0.537 | 0.661 | 0.759 | 0.832 | 0.884 | 0.921 | 0.947 | 0.964 | 0.976 | 0.984 | 0.989 |
| 0.394 | 0.394 | 0.537 | 0.661 | 0.759 | 0.832 | 0.885 | 0.921 | 0.947 | 0.964 | 0.976 | 0.984 | 0.989 |
| 0.3945 | 0.394 | 0.538 | 0.661 | 0.759 | 0.832 | 0.885 | 0.922 | 0.947 | 0.964 | 0.976 | 0.984 | 0.989 |
| 0.395 | 0.395 | 0.538 | 0.662 | 0.759 | 0.832 | 0.885 | 0.922 | 0.947 | 0.964 | 0.976 | 0.984 | 0.989 |
| 0.3955 | 0.396 | 0.539 | 0.662 | 0.76 | 0.833 | 0.885 | 0.922 | 0.947 | 0.964 | 0.976 | 0.984 | 0.989 |
| 0.396 | 0.396 | 0.539 | 0.663 | 0.76 | 0.833 | 0.885 | 0.922 | 0.947 | 0.965 | 0.976 | 0.984 | 0.989 |
| 0.3965 | 0.396 | 0.54 | 0.663 | 0.76 | 0.833 | 0.885 | 0.922 | 0.947 | 0.965 | 0.976 | 0.984 | 0.989 |
| 0.397 | 0.397 | 0.54 | 0.663 | 0.761 | 0.833 | 0.885 | 0.922 | 0.947 | 0.965 | 0.976 | 0.984 | 0.989 |
| 0.3975 | 0.398 | 0.541 | 0.664 | 0.761 | 0.833 | 0.886 | 0.922 | 0.947 | 0.965 | 0.976 | 0.984 | 0.989 |
| 0.398 | 0.398 | 0.541 | 0.664 | 0.761 | 0.834 | 0.886 | 0.922 | 0.948 | 0.965 | 0.976 | 0.984 | 0.989 |
| 0.3985 | 0.398 | 0.542 | 0.664 | 0.761 | 0.834 | 0.886 | 0.922 | 0.948 | 0.965 | 0.976 | 0.984 | 0.989 |
| 0.399 | 0.399 | 0.542 | 0.665 | 0.762 | 0.834 | 0.886 | 0.923 | 0.948 | 0.965 | 0.976 | 0.984 | 0.989 |
| 0.3995 | 0.4 | 0.542 | 0.665 | 0.762 | 0.834 | 0.886 | 0.923 | 0.948 | 0.965 | 0.976 | 0.984 | 0.989 |
| 0.4 | 0.4 | 0.543 | 0.665 | 0.762 | 0.834 | 0.886 | 0.923 | 0.948 | 0.965 | 0.976 | 0.984 | 0.989 |
| 0.4005 | 0.4 | 0.543 | 0.666 | 0.763 | 0.835 | 0.886 | 0.923 | 0.948 | 0.965 | 0.976 | 0.984 | 0.989 |
| 0.401 | 0.401 | 0.544 | 0.666 | 0.763 | 0.835 | 0.887 | 0.923 | 0.948 | 0.965 | 0.977 | 0.984 | 0.989 |
| 0.4015 | 0.402 | 0.544 | 0.667 | 0.763 | 0.835 | 0.887 | 0.923 | 0.948 | 0.965 | 0.977 | 0.984 | 0.99 |
| 0.402 | 0.402 | 0.545 | 0.667 | 0.763 | 0.835 | 0.887 | 0.923 | 0.948 | 0.965 | 0.977 | 0.984 | 0.99 |
| 0.4025 | 0.402 | 0.545 | 0.667 | 0.764 | 0.835 | 0.887 | 0.923 | 0.948 | 0.965 | 0.977 | 0.984 | 0.99 |
| 0.403 | 0.403 | 0.546 | 0.668 | 0.764 | 0.836 | 0.887 | 0.923 | 0.948 | 0.965 | 0.977 | 0.984 | 0.99 |
| 0.4035 | 0.404 | 0.546 | 0.668 | 0.764 | 0.836 | 0.887 | 0.923 | 0.948 | 0.965 | 0.977 | 0.984 | 0.99 |
| 0.404 | 0.404 | 0.546 | 0.668 | 0.764 | 0.836 | 0.887 | 0.924 | 0.948 | 0.965 | 0.977 | 0.984 | 0.99 |
| 0.4045 | 0.404 | 0.547 | 0.669 | 0.765 | 0.836 | 0.888 | 0.924 | 0.948 | 0.965 | 0.977 | 0.984 | 0.99 |
| 0.405 | 0.405 | 0.547 | 0.669 | 0.765 | 0.836 | 0.888 | 0.924 | 0.948 | 0.965 | 0.977 | 0.984 | 0.99 |
| 0.4055 | 0.406 | 0.548 | 0.67 | 0.765 | 0.837 | 0.888 | 0.924 | 0.949 | 0.965 | 0.977 | 0.984 | 0.99 |
| 0.406 | 0.406 | 0.548 | 0.67 | 0.766 | 0.837 | 0.888 | 0.924 | 0.949 | 0.965 | 0.977 | 0.984 | 0.99 |
| 0.4065 | 0.406 | 0.549 | 0.67 | 0.766 | 0.837 | 0.888 | 0.924 | 0.949 | 0.965 | 0.977 | 0.985 | 0.99 |
| 0.407 | 0.407 | 0.549 | 0.671 | 0.766 | 0.837 | 0.888 | 0.924 | 0.949 | 0.966 | 0.977 | 0.985 | 0.99 |
| 0.4075 | 0.408 | 0.55 | 0.671 | 0.766 | 0.838 | 0.889 | 0.924 | 0.949 | 0.966 | 0.977 | 0.985 | 0.99 |
| 0.408 | 0.408 | 0.55 | 0.671 | 0.767 | 0.838 | 0.889 | 0.924 | 0.949 | 0.966 | 0.977 | 0.985 | 0.99 |
| 0.4085 | 0.408 | 0.551 | 0.672 | 0.767 | 0.838 | 0.889 | 0.924 | 0.949 | 0.966 | 0.977 | 0.985 | 0.99 |
| 0.409 | 0.409 | 0.551 | 0.672 | 0.767 | 0.838 | 0.889 | 0.925 | 0.949 | 0.966 | 0.977 | 0.985 | 0.99 |
| 0.4095 | 0.41 | 0.551 | 0.672 | 0.768 | 0.838 | 0.889 | 0.925 | 0.949 | 0.966 | 0.977 | 0.985 | 0.99 |
| 0.41 | 0.41 | 0.552 | 0.673 | 0.768 | 0.839 | 0.889 | 0.925 | 0.949 | 0.966 | 0.977 | 0.985 | 0.99 |
| 0.4105 | 0.41 | 0.552 | 0.673 | 0.768 | 0.839 | 0.889 | 0.925 | 0.949 | 0.966 | 0.977 | 0.985 | 0.99 |
| 0.411 | 0.411 | 0.553 | 0.674 | 0.768 | 0.839 | 0.89 | 0.925 | 0.949 | 0.966 | 0.977 | 0.985 | 0.99 |
| 0.4115 | 0.412 | 0.553 | 0.674 | 0.769 | 0.839 | 0.89 | 0.925 | 0.949 | 0.966 | 0.977 | 0.985 | 0.99 |
| 0.412 | 0.412 | 0.554 | 0.674 | 0.769 | 0.839 | 0.89 | 0.925 | 0.949 | 0.966 | 0.977 | 0.985 | 0.99 |
| 0.4125 | 0.412 | 0.554 | 0.675 | 0.769 | 0.84 | 0.89 | 0.925 | 0.949 | 0.966 | 0.977 | 0.985 | 0.99 |
| 0.413 | 0.413 | 0.555 | 0.675 | 0.769 | 0.84 | 0.89 | 0.925 | 0.95 | 0.966 | 0.977 | 0.985 | 0.99 |
| 0.4135 | 0.414 | 0.555 | 0.675 | 0.77 | 0.84 | 0.89 | 0.925 | 0.95 | 0.966 | 0.977 | 0.985 | 0.99 |
| 0.414 | 0.414 | 0.555 | 0.676 | 0.77 | 0.84 | 0.89 | 0.925 | 0.95 | 0.966 | 0.977 | 0.985 | 0.99 |
| 0.4145 | 0.414 | 0.556 | 0.676 | 0.77 | 0.84 | 0.89 | 0.926 | 0.95 | 0.966 | 0.977 | 0.985 | 0.99 |
| 0.415 | 0.415 | 0.556 | 0.676 | 0.771 | 0.841 | 0.891 | 0.926 | 0.95 | 0.966 | 0.977 | 0.985 | 0.99 |
| 0.4155 | 0.416 | 0.557 | 0.677 | 0.771 | 0.841 | 0.891 | 0.926 | 0.95 | 0.966 | 0.977 | 0.985 | 0.99 |
| 0.416 | 0.416 | 0.557 | 0.677 | 0.771 | 0.841 | 0.891 | 0.926 | 0.95 | 0.966 | 0.977 | 0.985 | 0.99 |
| 0.4165 | 0.416 | 0.558 | 0.678 | 0.771 | 0.841 | 0.891 | 0.926 | 0.95 | 0.966 | 0.977 | 0.985 | 0.99 |
| 0.417 | 0.417 | 0.558 | 0.678 | 0.772 | 0.841 | 0.891 | 0.926 | 0.95 | 0.966 | 0.978 | 0.985 | 0.99 |
| 0.4175 | 0.418 | 0.559 | 0.678 | 0.772 | 0.842 | 0.891 | 0.926 | 0.95 | 0.966 | 0.978 | 0.985 | 0.99 |
| 0.418 | 0.418 | 0.559 | 0.679 | 0.772 | 0.842 | 0.891 | 0.926 | 0.95 | 0.967 | 0.978 | 0.985 | 0.99 |
| 0.4185 | 0.418 | 0.559 | 0.679 | 0.773 | 0.842 | 0.892 | 0.926 | 0.95 | 0.967 | 0.978 | 0.985 | 0.99 |
| 0.419 | 0.419 | 0.56 | 0.679 | 0.773 | 0.842 | 0.892 | 0.926 | 0.95 | 0.967 | 0.978 | 0.985 | 0.99 |
| 0.4195 | 0.42 | 0.56 | 0.68 | 0.773 | 0.842 | 0.892 | 0.927 | 0.95 | 0.967 | 0.978 | 0.985 | 0.99 |
| 0.42 | 0.42 | 0.561 | 0.68 | 0.773 | 0.843 | 0.892 | 0.927 | 0.95 | 0.967 | 0.978 | 0.985 | 0.99 |
| 0.4205 | 0.42 | 0.561 | 0.68 | 0.774 | 0.843 | 0.892 | 0.927 | 0.951 | 0.967 | 0.978 | 0.985 | 0.99 |
| 0.421 | 0.421 | 0.562 | 0.681 | 0.774 | 0.843 | 0.892 | 0.927 | 0.951 | 0.967 | 0.978 | 0.985 | 0.99 |
| 0.4215 | 0.422 | 0.562 | 0.681 | 0.774 | 0.843 | 0.892 | 0.927 | 0.951 | 0.967 | 0.978 | 0.985 | 0.99 |
| 0.422 | 0.422 | 0.563 | 0.682 | 0.774 | 0.843 | 0.893 | 0.927 | 0.951 | 0.967 | 0.978 | 0.985 | 0.99 |
| 0.4225 | 0.422 | 0.563 | 0.682 | 0.775 | 0.844 | 0.893 | 0.927 | 0.951 | 0.967 | 0.978 | 0.985 | 0.99 |
| 0.423 | 0.423 | 0.563 | 0.682 | 0.775 | 0.844 | 0.893 | 0.927 | 0.951 | 0.967 | 0.978 | 0.985 | 0.99 |
| 0.4235 | 0.424 | 0.564 | 0.683 | 0.775 | 0.844 | 0.893 | 0.927 | 0.951 | 0.967 | 0.978 | 0.985 | 0.99 |
| 0.424 | 0.424 | 0.564 | 0.683 | 0.776 | 0.844 | 0.893 | 0.927 | 0.951 | 0.967 | 0.978 | 0.985 | 0.99 |
| 0.4245 | 0.424 | 0.565 | 0.683 | 0.776 | 0.844 | 0.893 | 0.928 | 0.951 | 0.967 | 0.978 | 0.985 | 0.99 |
| 0.425 | 0.425 | 0.565 | 0.684 | 0.776 | 0.844 | 0.893 | 0.928 | 0.951 | 0.967 | 0.978 | 0.985 | 0.99 |
| 0.4255 | 0.426 | 0.566 | 0.684 | 0.776 | 0.845 | 0.894 | 0.928 | 0.951 | 0.967 | 0.978 | 0.985 | 0.99 |
| 0.426 | 0.426 | 0.566 | 0.684 | 0.777 | 0.845 | 0.894 | 0.928 | 0.951 | 0.967 | 0.978 | 0.985 | 0.99 |
| 0.4265 | 0.426 | 0.567 | 0.685 | 0.777 | 0.845 | 0.894 | 0.928 | 0.951 | 0.967 | 0.978 | 0.985 | 0.99 |
| 0.427 | 0.427 | 0.567 | 0.685 | 0.777 | 0.845 | 0.894 | 0.928 | 0.951 | 0.967 | 0.978 | 0.985 | 0.99 |
| 0.4275 | 0.428 | 0.567 | 0.685 | 0.777 | 0.845 | 0.894 | 0.928 | 0.951 | 0.967 | 0.978 | 0.985 | 0.99 |
| 0.428 | 0.428 | 0.568 | 0.686 | 0.778 | 0.846 | 0.894 | 0.928 | 0.952 | 0.967 | 0.978 | 0.985 | 0.99 |
| 0.4285 | 0.428 | 0.568 | 0.686 | 0.778 | 0.846 | 0.894 | 0.928 | 0.952 | 0.967 | 0.978 | 0.985 | 0.99 |
| 0.429 | 0.429 | 0.569 | 0.687 | 0.778 | 0.846 | 0.895 | 0.928 | 0.952 | 0.968 | 0.978 | 0.985 | 0.99 |
| 0.4295 | 0.43 | 0.569 | 0.687 | 0.778 | 0.846 | 0.895 | 0.928 | 0.952 | 0.968 | 0.978 | 0.985 | 0.99 |
| 0.43 | 0.43 | 0.57 | 0.687 | 0.779 | 0.846 | 0.895 | 0.929 | 0.952 | 0.968 | 0.978 | 0.985 | 0.99 |
| 0.4305 | 0.43 | 0.57 | 0.688 | 0.779 | 0.847 | 0.895 | 0.929 | 0.952 | 0.968 | 0.978 | 0.985 | 0.99 |
| 0.431 | 0.431 | 0.571 | 0.688 | 0.779 | 0.847 | 0.895 | 0.929 | 0.952 | 0.968 | 0.978 | 0.986 | 0.99 |
| 0.4315 | 0.432 | 0.571 | 0.688 | 0.78 | 0.847 | 0.895 | 0.929 | 0.952 | 0.968 | 0.978 | 0.986 | 0.99 |
| 0.432 | 0.432 | 0.571 | 0.689 | 0.78 | 0.847 | 0.895 | 0.929 | 0.952 | 0.968 | 0.978 | 0.986 | 0.99 |
| 0.4325 | 0.432 | 0.572 | 0.689 | 0.78 | 0.847 | 0.895 | 0.929 | 0.952 | 0.968 | 0.978 | 0.986 | 0.99 |
| 0.433 | 0.433 | 0.572 | 0.689 | 0.78 | 0.848 | 0.896 | 0.929 | 0.952 | 0.968 | 0.978 | 0.986 | 0.99 |
| 0.4335 | 0.434 | 0.573 | 0.69 | 0.781 | 0.848 | 0.896 | 0.929 | 0.952 | 0.968 | 0.978 | 0.986 | 0.99 |
| 0.434 | 0.434 | 0.573 | 0.69 | 0.781 | 0.848 | 0.896 | 0.929 | 0.952 | 0.968 | 0.979 | 0.986 | 0.99 |
| 0.4345 | 0.434 | 0.574 | 0.69 | 0.781 | 0.848 | 0.896 | 0.929 | 0.952 | 0.968 | 0.979 | 0.986 | 0.99 |
| 0.435 | 0.435 | 0.574 | 0.691 | 0.781 | 0.848 | 0.896 | 0.93 | 0.952 | 0.968 | 0.979 | 0.986 | 0.99 |
| 0.4355 | 0.436 | 0.575 | 0.691 | 0.782 | 0.849 | 0.896 | 0.93 | 0.953 | 0.968 | 0.979 | 0.986 | 0.99 |
| 0.436 | 0.436 | 0.575 | 0.691 | 0.782 | 0.849 | 0.896 | 0.93 | 0.953 | 0.968 | 0.979 | 0.986 | 0.99 |
| 0.4365 | 0.436 | 0.575 | 0.692 | 0.782 | 0.849 | 0.897 | 0.93 | 0.953 | 0.968 | 0.979 | 0.986 | 0.99 |
| 0.437 | 0.437 | 0.576 | 0.692 | 0.782 | 0.849 | 0.897 | 0.93 | 0.953 | 0.968 | 0.979 | 0.986 | 0.99 |
| 0.4375 | 0.438 | 0.576 | 0.693 | 0.783 | 0.849 | 0.897 | 0.93 | 0.953 | 0.968 | 0.979 | 0.986 | 0.99 |
| 0.438 | 0.438 | 0.577 | 0.693 | 0.783 | 0.85 | 0.897 | 0.93 | 0.953 | 0.968 | 0.979 | 0.986 | 0.991 |
| 0.4385 | 0.438 | 0.577 | 0.693 | 0.783 | 0.85 | 0.897 | 0.93 | 0.953 | 0.968 | 0.979 | 0.986 | 0.991 |
| 0.439 | 0.439 | 0.578 | 0.694 | 0.784 | 0.85 | 0.897 | 0.93 | 0.953 | 0.968 | 0.979 | 0.986 | 0.991 |
| 0.4395 | 0.44 | 0.578 | 0.694 | 0.784 | 0.85 | 0.897 | 0.93 | 0.953 | 0.968 | 0.979 | 0.986 | 0.991 |
| 0.44 | 0.44 | 0.578 | 0.694 | 0.784 | 0.85 | 0.898 | 0.93 | 0.953 | 0.968 | 0.979 | 0.986 | 0.991 |
| 0.4405 | 0.44 | 0.579 | 0.695 | 0.784 | 0.85 | 0.898 | 0.931 | 0.953 | 0.969 | 0.979 | 0.986 | 0.991 |
| 0.441 | 0.441 | 0.579 | 0.695 | 0.785 | 0.851 | 0.898 | 0.931 | 0.953 | 0.969 | 0.979 | 0.986 | 0.991 |
| 0.4415 | 0.442 | 0.58 | 0.695 | 0.785 | 0.851 | 0.898 | 0.931 | 0.953 | 0.969 | 0.979 | 0.986 | 0.991 |
| 0.442 | 0.442 | 0.58 | 0.696 | 0.785 | 0.851 | 0.898 | 0.931 | 0.953 | 0.969 | 0.979 | 0.986 | 0.991 |
| 0.4425 | 0.442 | 0.581 | 0.696 | 0.785 | 0.851 | 0.898 | 0.931 | 0.953 | 0.969 | 0.979 | 0.986 | 0.991 |
| 0.443 | 0.443 | 0.581 | 0.696 | 0.786 | 0.851 | 0.898 | 0.931 | 0.953 | 0.969 | 0.979 | 0.986 | 0.991 |
| 0.4435 | 0.444 | 0.582 | 0.697 | 0.786 | 0.852 | 0.898 | 0.931 | 0.954 | 0.969 | 0.979 | 0.986 | 0.991 |
| 0.444 | 0.444 | 0.582 | 0.697 | 0.786 | 0.852 | 0.899 | 0.931 | 0.954 | 0.969 | 0.979 | 0.986 | 0.991 |
| 0.4445 | 0.444 | 0.582 | 0.697 | 0.786 | 0.852 | 0.899 | 0.931 | 0.954 | 0.969 | 0.979 | 0.986 | 0.991 |
| 0.445 | 0.445 | 0.583 | 0.698 | 0.787 | 0.852 | 0.899 | 0.931 | 0.954 | 0.969 | 0.979 | 0.986 | 0.991 |
| 0.4455 | 0.446 | 0.583 | 0.698 | 0.787 | 0.852 | 0.899 | 0.931 | 0.954 | 0.969 | 0.979 | 0.986 | 0.991 |
| 0.446 | 0.446 | 0.584 | 0.698 | 0.787 | 0.853 | 0.899 | 0.932 | 0.954 | 0.969 | 0.979 | 0.986 | 0.991 |
| 0.4465 | 0.446 | 0.584 | 0.699 | 0.787 | 0.853 | 0.899 | 0.932 | 0.954 | 0.969 | 0.979 | 0.986 | 0.991 |
| 0.447 | 0.447 | 0.585 | 0.699 | 0.788 | 0.853 | 0.899 | 0.932 | 0.954 | 0.969 | 0.979 | 0.986 | 0.991 |
| 0.4475 | 0.448 | 0.585 | 0.7 | 0.788 | 0.853 | 0.9 | 0.932 | 0.954 | 0.969 | 0.979 | 0.986 | 0.991 |
| 0.448 | 0.448 | 0.585 | 0.7 | 0.788 | 0.853 | 0.9 | 0.932 | 0.954 | 0.969 | 0.979 | 0.986 | 0.991 |
| 0.4485 | 0.448 | 0.586 | 0.7 | 0.789 | 0.854 | 0.9 | 0.932 | 0.954 | 0.969 | 0.979 | 0.986 | 0.991 |
| 0.449 | 0.449 | 0.586 | 0.701 | 0.789 | 0.854 | 0.9 | 0.932 | 0.954 | 0.969 | 0.979 | 0.986 | 0.991 |
| 0.4495 | 0.45 | 0.587 | 0.701 | 0.789 | 0.854 | 0.9 | 0.932 | 0.954 | 0.969 | 0.979 | 0.986 | 0.991 |
| 0.45 | 0.45 | 0.587 | 0.701 | 0.789 | 0.854 | 0.9 | 0.932 | 0.954 | 0.969 | 0.979 | 0.986 | 0.991 |
| 0.4505 | 0.45 | 0.588 | 0.702 | 0.79 | 0.854 | 0.9 | 0.932 | 0.954 | 0.969 | 0.979 | 0.986 | 0.991 |
| 0.451 | 0.451 | 0.588 | 0.702 | 0.79 | 0.854 | 0.9 | 0.932 | 0.954 | 0.969 | 0.979 | 0.986 | 0.991 |
| 0.4515 | 0.452 | 0.589 | 0.702 | 0.79 | 0.855 | 0.901 | 0.933 | 0.955 | 0.969 | 0.98 | 0.986 | 0.991 |
| 0.452 | 0.452 | 0.589 | 0.703 | 0.79 | 0.855 | 0.901 | 0.933 | 0.955 | 0.969 | 0.98 | 0.986 | 0.991 |
| 0.4525 | 0.452 | 0.589 | 0.703 | 0.791 | 0.855 | 0.901 | 0.933 | 0.955 | 0.97 | 0.98 | 0.986 | 0.991 |
| 0.453 | 0.453 | 0.59 | 0.703 | 0.791 | 0.855 | 0.901 | 0.933 | 0.955 | 0.97 | 0.98 | 0.986 | 0.991 |
| 0.4535 | 0.454 | 0.59 | 0.704 | 0.791 | 0.855 | 0.901 | 0.933 | 0.955 | 0.97 | 0.98 | 0.986 | 0.991 |
| 0.454 | 0.454 | 0.591 | 0.704 | 0.791 | 0.856 | 0.901 | 0.933 | 0.955 | 0.97 | 0.98 | 0.986 | 0.991 |
| 0.4545 | 0.454 | 0.591 | 0.704 | 0.792 | 0.856 | 0.901 | 0.933 | 0.955 | 0.97 | 0.98 | 0.986 | 0.991 |
| 0.455 | 0.455 | 0.592 | 0.705 | 0.792 | 0.856 | 0.901 | 0.933 | 0.955 | 0.97 | 0.98 | 0.986 | 0.991 |
| 0.4555 | 0.456 | 0.592 | 0.705 | 0.792 | 0.856 | 0.902 | 0.933 | 0.955 | 0.97 | 0.98 | 0.986 | 0.991 |
| 0.456 | 0.456 | 0.592 | 0.705 | 0.792 | 0.856 | 0.902 | 0.933 | 0.955 | 0.97 | 0.98 | 0.986 | 0.991 |
| 0.4565 | 0.456 | 0.593 | 0.706 | 0.793 | 0.857 | 0.902 | 0.933 | 0.955 | 0.97 | 0.98 | 0.986 | 0.991 |
| 0.457 | 0.457 | 0.593 | 0.706 | 0.793 | 0.857 | 0.902 | 0.934 | 0.955 | 0.97 | 0.98 | 0.987 | 0.991 |
| 0.4575 | 0.458 | 0.594 | 0.706 | 0.793 | 0.857 | 0.902 | 0.934 | 0.955 | 0.97 | 0.98 | 0.987 | 0.991 |
| 0.458 | 0.458 | 0.594 | 0.707 | 0.793 | 0.857 | 0.902 | 0.934 | 0.955 | 0.97 | 0.98 | 0.987 | 0.991 |
| 0.4585 | 0.458 | 0.595 | 0.707 | 0.794 | 0.857 | 0.902 | 0.934 | 0.955 | 0.97 | 0.98 | 0.987 | 0.991 |
| 0.459 | 0.459 | 0.595 | 0.707 | 0.794 | 0.857 | 0.903 | 0.934 | 0.955 | 0.97 | 0.98 | 0.987 | 0.991 |
| 0.4595 | 0.46 | 0.595 | 0.708 | 0.794 | 0.858 | 0.903 | 0.934 | 0.956 | 0.97 | 0.98 | 0.987 | 0.991 |
| 0.46 | 0.46 | 0.596 | 0.708 | 0.794 | 0.858 | 0.903 | 0.934 | 0.956 | 0.97 | 0.98 | 0.987 | 0.991 |
| 0.4605 | 0.46 | 0.596 | 0.708 | 0.795 | 0.858 | 0.903 | 0.934 | 0.956 | 0.97 | 0.98 | 0.987 | 0.991 |
| 0.461 | 0.461 | 0.597 | 0.709 | 0.795 | 0.858 | 0.903 | 0.934 | 0.956 | 0.97 | 0.98 | 0.987 | 0.991 |
| 0.4615 | 0.462 | 0.597 | 0.709 | 0.795 | 0.858 | 0.903 | 0.934 | 0.956 | 0.97 | 0.98 | 0.987 | 0.991 |
| 0.462 | 0.462 | 0.598 | 0.709 | 0.795 | 0.859 | 0.903 | 0.934 | 0.956 | 0.97 | 0.98 | 0.987 | 0.991 |
| 0.4625 | 0.462 | 0.598 | 0.71 | 0.796 | 0.859 | 0.903 | 0.935 | 0.956 | 0.97 | 0.98 | 0.987 | 0.991 |
| 0.463 | 0.463 | 0.598 | 0.71 | 0.796 | 0.859 | 0.904 | 0.935 | 0.956 | 0.97 | 0.98 | 0.987 | 0.991 |
| 0.4635 | 0.464 | 0.599 | 0.711 | 0.796 | 0.859 | 0.904 | 0.935 | 0.956 | 0.97 | 0.98 | 0.987 | 0.991 |
| 0.464 | 0.464 | 0.599 | 0.711 | 0.797 | 0.859 | 0.904 | 0.935 | 0.956 | 0.97 | 0.98 | 0.987 | 0.991 |
| 0.4645 | 0.464 | 0.6 | 0.711 | 0.797 | 0.859 | 0.904 | 0.935 | 0.956 | 0.971 | 0.98 | 0.987 | 0.991 |
| 0.465 | 0.465 | 0.6 | 0.712 | 0.797 | 0.86 | 0.904 | 0.935 | 0.956 | 0.971 | 0.98 | 0.987 | 0.991 |
| 0.4655 | 0.466 | 0.601 | 0.712 | 0.797 | 0.86 | 0.904 | 0.935 | 0.956 | 0.971 | 0.98 | 0.987 | 0.991 |
| 0.466 | 0.466 | 0.601 | 0.712 | 0.798 | 0.86 | 0.904 | 0.935 | 0.956 | 0.971 | 0.98 | 0.987 | 0.991 |
| 0.4665 | 0.466 | 0.601 | 0.713 | 0.798 | 0.86 | 0.904 | 0.935 | 0.956 | 0.971 | 0.98 | 0.987 | 0.991 |
| 0.467 | 0.467 | 0.602 | 0.713 | 0.798 | 0.86 | 0.905 | 0.935 | 0.956 | 0.971 | 0.98 | 0.987 | 0.991 |
| 0.4675 | 0.468 | 0.602 | 0.713 | 0.798 | 0.861 | 0.905 | 0.935 | 0.956 | 0.971 | 0.98 | 0.987 | 0.991 |
| 0.468 | 0.468 | 0.603 | 0.714 | 0.799 | 0.861 | 0.905 | 0.936 | 0.957 | 0.971 | 0.98 | 0.987 | 0.991 |
| 0.4685 | 0.468 | 0.603 | 0.714 | 0.799 | 0.861 | 0.905 | 0.936 | 0.957 | 0.971 | 0.98 | 0.987 | 0.991 |
| 0.469 | 0.469 | 0.604 | 0.714 | 0.799 | 0.861 | 0.905 | 0.936 | 0.957 | 0.971 | 0.98 | 0.987 | 0.991 |
| 0.4695 | 0.47 | 0.604 | 0.715 | 0.799 | 0.861 | 0.905 | 0.936 | 0.957 | 0.971 | 0.981 | 0.987 | 0.991 |
| 0.47 | 0.47 | 0.605 | 0.715 | 0.8 | 0.861 | 0.905 | 0.936 | 0.957 | 0.971 | 0.981 | 0.987 | 0.991 |
| 0.4705 | 0.47 | 0.605 | 0.715 | 0.8 | 0.862 | 0.905 | 0.936 | 0.957 | 0.971 | 0.981 | 0.987 | 0.991 |
| 0.471 | 0.471 | 0.605 | 0.716 | 0.8 | 0.862 | 0.906 | 0.936 | 0.957 | 0.971 | 0.981 | 0.987 | 0.991 |
| 0.4715 | 0.472 | 0.606 | 0.716 | 0.8 | 0.862 | 0.906 | 0.936 | 0.957 | 0.971 | 0.981 | 0.987 | 0.991 |
| 0.472 | 0.472 | 0.606 | 0.716 | 0.801 | 0.862 | 0.906 | 0.936 | 0.957 | 0.971 | 0.981 | 0.987 | 0.991 |
| 0.4725 | 0.472 | 0.607 | 0.717 | 0.801 | 0.862 | 0.906 | 0.936 | 0.957 | 0.971 | 0.981 | 0.987 | 0.991 |
| 0.473 | 0.473 | 0.607 | 0.717 | 0.801 | 0.863 | 0.906 | 0.936 | 0.957 | 0.971 | 0.981 | 0.987 | 0.991 |
| 0.4735 | 0.474 | 0.608 | 0.717 | 0.801 | 0.863 | 0.906 | 0.936 | 0.957 | 0.971 | 0.981 | 0.987 | 0.991 |
| 0.474 | 0.474 | 0.608 | 0.718 | 0.802 | 0.863 | 0.906 | 0.937 | 0.957 | 0.971 | 0.981 | 0.987 | 0.991 |
| 0.4745 | 0.474 | 0.608 | 0.718 | 0.802 | 0.863 | 0.906 | 0.937 | 0.957 | 0.971 | 0.981 | 0.987 | 0.991 |
| 0.475 | 0.475 | 0.609 | 0.718 | 0.802 | 0.863 | 0.907 | 0.937 | 0.957 | 0.971 | 0.981 | 0.987 | 0.991 |
| 0.4755 | 0.476 | 0.609 | 0.719 | 0.802 | 0.863 | 0.907 | 0.937 | 0.957 | 0.971 | 0.981 | 0.987 | 0.991 |
| 0.476 | 0.476 | 0.61 | 0.719 | 0.803 | 0.864 | 0.907 | 0.937 | 0.957 | 0.971 | 0.981 | 0.987 | 0.991 |
| 0.4765 | 0.476 | 0.61 | 0.719 | 0.803 | 0.864 | 0.907 | 0.937 | 0.958 | 0.971 | 0.981 | 0.987 | 0.991 |
| 0.477 | 0.477 | 0.61 | 0.72 | 0.803 | 0.864 | 0.907 | 0.937 | 0.958 | 0.972 | 0.981 | 0.987 | 0.991 |
| 0.4775 | 0.478 | 0.611 | 0.72 | 0.803 | 0.864 | 0.907 | 0.937 | 0.958 | 0.972 | 0.981 | 0.987 | 0.991 |
| 0.478 | 0.478 | 0.611 | 0.72 | 0.804 | 0.864 | 0.907 | 0.937 | 0.958 | 0.972 | 0.981 | 0.987 | 0.992 |
| 0.4785 | 0.478 | 0.612 | 0.721 | 0.804 | 0.865 | 0.907 | 0.937 | 0.958 | 0.972 | 0.981 | 0.987 | 0.992 |
| 0.479 | 0.479 | 0.612 | 0.721 | 0.804 | 0.865 | 0.908 | 0.937 | 0.958 | 0.972 | 0.981 | 0.987 | 0.992 |
| 0.4795 | 0.48 | 0.613 | 0.721 | 0.804 | 0.865 | 0.908 | 0.938 | 0.958 | 0.972 | 0.981 | 0.987 | 0.992 |
| 0.48 | 0.48 | 0.613 | 0.722 | 0.805 | 0.865 | 0.908 | 0.938 | 0.958 | 0.972 | 0.981 | 0.987 | 0.992 |
| 0.4805 | 0.48 | 0.613 | 0.722 | 0.805 | 0.865 | 0.908 | 0.938 | 0.958 | 0.972 | 0.981 | 0.987 | 0.992 |
| 0.481 | 0.481 | 0.614 | 0.722 | 0.805 | 0.865 | 0.908 | 0.938 | 0.958 | 0.972 | 0.981 | 0.987 | 0.992 |
| 0.4815 | 0.482 | 0.614 | 0.723 | 0.805 | 0.866 | 0.908 | 0.938 | 0.958 | 0.972 | 0.981 | 0.987 | 0.992 |
| 0.482 | 0.482 | 0.615 | 0.723 | 0.806 | 0.866 | 0.908 | 0.938 | 0.958 | 0.972 | 0.981 | 0.987 | 0.992 |
| 0.4825 | 0.482 | 0.615 | 0.723 | 0.806 | 0.866 | 0.908 | 0.938 | 0.958 | 0.972 | 0.981 | 0.987 | 0.992 |
| 0.483 | 0.483 | 0.616 | 0.724 | 0.806 | 0.866 | 0.909 | 0.938 | 0.958 | 0.972 | 0.981 | 0.987 | 0.992 |
| 0.4835 | 0.484 | 0.616 | 0.724 | 0.806 | 0.866 | 0.909 | 0.938 | 0.958 | 0.972 | 0.981 | 0.987 | 0.992 |
| 0.484 | 0.484 | 0.616 | 0.724 | 0.807 | 0.866 | 0.909 | 0.938 | 0.958 | 0.972 | 0.981 | 0.987 | 0.992 |
| 0.4845 | 0.484 | 0.617 | 0.725 | 0.807 | 0.867 | 0.909 | 0.938 | 0.958 | 0.972 | 0.981 | 0.988 | 0.992 |
| 0.485 | 0.485 | 0.617 | 0.725 | 0.807 | 0.867 | 0.909 | 0.938 | 0.959 | 0.972 | 0.981 | 0.988 | 0.992 |
| 0.4855 | 0.486 | 0.618 | 0.725 | 0.807 | 0.867 | 0.909 | 0.939 | 0.959 | 0.972 | 0.981 | 0.988 | 0.992 |
| 0.486 | 0.486 | 0.618 | 0.726 | 0.808 | 0.867 | 0.909 | 0.939 | 0.959 | 0.972 | 0.981 | 0.988 | 0.992 |
| 0.4865 | 0.486 | 0.619 | 0.726 | 0.808 | 0.867 | 0.909 | 0.939 | 0.959 | 0.972 | 0.981 | 0.988 | 0.992 |
| 0.487 | 0.487 | 0.619 | 0.726 | 0.808 | 0.868 | 0.91 | 0.939 | 0.959 | 0.972 | 0.981 | 0.988 | 0.992 |
| 0.4875 | 0.488 | 0.619 | 0.727 | 0.808 | 0.868 | 0.91 | 0.939 | 0.959 | 0.972 | 0.981 | 0.988 | 0.992 |
| 0.488 | 0.488 | 0.62 | 0.727 | 0.808 | 0.868 | 0.91 | 0.939 | 0.959 | 0.972 | 0.982 | 0.988 | 0.992 |
| 0.4885 | 0.488 | 0.62 | 0.727 | 0.809 | 0.868 | 0.91 | 0.939 | 0.959 | 0.972 | 0.982 | 0.988 | 0.992 |
| 0.489 | 0.489 | 0.621 | 0.728 | 0.809 | 0.868 | 0.91 | 0.939 | 0.959 | 0.972 | 0.982 | 0.988 | 0.992 |
| 0.4895 | 0.49 | 0.621 | 0.728 | 0.809 | 0.868 | 0.91 | 0.939 | 0.959 | 0.973 | 0.982 | 0.988 | 0.992 |
| 0.49 | 0.49 | 0.622 | 0.728 | 0.809 | 0.869 | 0.91 | 0.939 | 0.959 | 0.973 | 0.982 | 0.988 | 0.992 |
| 0.4905 | 0.49 | 0.622 | 0.729 | 0.81 | 0.869 | 0.91 | 0.939 | 0.959 | 0.973 | 0.982 | 0.988 | 0.992 |
| 0.491 | 0.491 | 0.622 | 0.729 | 0.81 | 0.869 | 0.911 | 0.939 | 0.959 | 0.973 | 0.982 | 0.988 | 0.992 |
| 0.4915 | 0.492 | 0.623 | 0.729 | 0.81 | 0.869 | 0.911 | 0.94 | 0.959 | 0.973 | 0.982 | 0.988 | 0.992 |
| 0.492 | 0.492 | 0.623 | 0.73 | 0.81 | 0.869 | 0.911 | 0.94 | 0.959 | 0.973 | 0.982 | 0.988 | 0.992 |
| 0.4925 | 0.492 | 0.624 | 0.73 | 0.811 | 0.869 | 0.911 | 0.94 | 0.959 | 0.973 | 0.982 | 0.988 | 0.992 |
| 0.493 | 0.493 | 0.624 | 0.73 | 0.811 | 0.87 | 0.911 | 0.94 | 0.959 | 0.973 | 0.982 | 0.988 | 0.992 |
| 0.4935 | 0.494 | 0.624 | 0.731 | 0.811 | 0.87 | 0.911 | 0.94 | 0.96 | 0.973 | 0.982 | 0.988 | 0.992 |
| 0.494 | 0.494 | 0.625 | 0.731 | 0.811 | 0.87 | 0.911 | 0.94 | 0.96 | 0.973 | 0.982 | 0.988 | 0.992 |
| 0.4945 | 0.494 | 0.625 | 0.731 | 0.812 | 0.87 | 0.911 | 0.94 | 0.96 | 0.973 | 0.982 | 0.988 | 0.992 |
| 0.495 | 0.495 | 0.626 | 0.732 | 0.812 | 0.87 | 0.912 | 0.94 | 0.96 | 0.973 | 0.982 | 0.988 | 0.992 |
| 0.4955 | 0.496 | 0.626 | 0.732 | 0.812 | 0.87 | 0.912 | 0.94 | 0.96 | 0.973 | 0.982 | 0.988 | 0.992 |
| 0.496 | 0.496 | 0.627 | 0.732 | 0.812 | 0.871 | 0.912 | 0.94 | 0.96 | 0.973 | 0.982 | 0.988 | 0.992 |
| 0.4965 | 0.496 | 0.627 | 0.733 | 0.813 | 0.871 | 0.912 | 0.94 | 0.96 | 0.973 | 0.982 | 0.988 | 0.992 |
| 0.497 | 0.497 | 0.627 | 0.733 | 0.813 | 0.871 | 0.912 | 0.94 | 0.96 | 0.973 | 0.982 | 0.988 | 0.992 |
| 0.4975 | 0.498 | 0.628 | 0.733 | 0.813 | 0.871 | 0.912 | 0.941 | 0.96 | 0.973 | 0.982 | 0.988 | 0.992 |
| 0.498 | 0.498 | 0.628 | 0.734 | 0.813 | 0.871 | 0.912 | 0.941 | 0.96 | 0.973 | 0.982 | 0.988 | 0.992 |
| 0.4985 | 0.498 | 0.629 | 0.734 | 0.814 | 0.872 | 0.912 | 0.941 | 0.96 | 0.973 | 0.982 | 0.988 | 0.992 |
| 0.499 | 0.499 | 0.629 | 0.734 | 0.814 | 0.872 | 0.913 | 0.941 | 0.96 | 0.973 | 0.982 | 0.988 | 0.992 |
| 0.4995 | 0.5 | 0.63 | 0.735 | 0.814 | 0.872 | 0.913 | 0.941 | 0.96 | 0.973 | 0.982 | 0.988 | 0.992 |
| 0.5 | 0.5 | 0.63 | 0.735 | 0.814 | 0.872 | 0.913 | 0.941 | 0.96 | 0.973 | 0.982 | 0.988 | 0.992 |
| 0.5005 | 0.5 | 0.63 | 0.735 | 0.815 | 0.872 | 0.913 | 0.941 | 0.96 | 0.973 | 0.982 | 0.988 | 0.992 |
| 0.501 | 0.501 | 0.631 | 0.736 | 0.815 | 0.872 | 0.913 | 0.941 | 0.96 | 0.973 | 0.982 | 0.988 | 0.992 |
| 0.5015 | 0.501 | 0.631 | 0.736 | 0.815 | 0.873 | 0.913 | 0.941 | 0.96 | 0.973 | 0.982 | 0.988 | 0.992 |
| 0.502 | 0.502 | 0.632 | 0.736 | 0.815 | 0.873 | 0.913 | 0.941 | 0.96 | 0.973 | 0.982 | 0.988 | 0.992 |
| 0.5025 | 0.502 | 0.632 | 0.736 | 0.816 | 0.873 | 0.913 | 0.941 | 0.961 | 0.974 | 0.982 | 0.988 | 0.992 |
| 0.503 | 0.503 | 0.632 | 0.737 | 0.816 | 0.873 | 0.913 | 0.941 | 0.961 | 0.974 | 0.982 | 0.988 | 0.992 |
| 0.5035 | 0.503 | 0.633 | 0.737 | 0.816 | 0.873 | 0.914 | 0.942 | 0.961 | 0.974 | 0.982 | 0.988 | 0.992 |
| 0.504 | 0.504 | 0.633 | 0.737 | 0.816 | 0.873 | 0.914 | 0.942 | 0.961 | 0.974 | 0.982 | 0.988 | 0.992 |
| 0.5045 | 0.504 | 0.634 | 0.738 | 0.817 | 0.874 | 0.914 | 0.942 | 0.961 | 0.974 | 0.982 | 0.988 | 0.992 |
| 0.505 | 0.505 | 0.634 | 0.738 | 0.817 | 0.874 | 0.914 | 0.942 | 0.961 | 0.974 | 0.982 | 0.988 | 0.992 |
| 0.5055 | 0.505 | 0.635 | 0.738 | 0.817 | 0.874 | 0.914 | 0.942 | 0.961 | 0.974 | 0.982 | 0.988 | 0.992 |
| 0.506 | 0.506 | 0.635 | 0.739 | 0.817 | 0.874 | 0.914 | 0.942 | 0.961 | 0.974 | 0.982 | 0.988 | 0.992 |
| 0.5065 | 0.506 | 0.635 | 0.739 | 0.817 | 0.874 | 0.914 | 0.942 | 0.961 | 0.974 | 0.982 | 0.988 | 0.992 |
| 0.507 | 0.507 | 0.636 | 0.739 | 0.818 | 0.874 | 0.914 | 0.942 | 0.961 | 0.974 | 0.982 | 0.988 | 0.992 |
| 0.5075 | 0.507 | 0.636 | 0.74 | 0.818 | 0.875 | 0.915 | 0.942 | 0.961 | 0.974 | 0.983 | 0.988 | 0.992 |
| 0.507999999999999 | 0.508 | 0.637 | 0.74 | 0.818 | 0.875 | 0.915 | 0.942 | 0.961 | 0.974 | 0.983 | 0.988 | 0.992 |
| 0.508499999999999 | 0.508 | 0.637 | 0.74 | 0.818 | 0.875 | 0.915 | 0.942 | 0.961 | 0.974 | 0.983 | 0.988 | 0.992 |
| 0.508999999999999 | 0.509 | 0.637 | 0.741 | 0.819 | 0.875 | 0.915 | 0.942 | 0.961 | 0.974 | 0.983 | 0.988 | 0.992 |
| 0.509499999999999 | 0.509 | 0.638 | 0.741 | 0.819 | 0.875 | 0.915 | 0.943 | 0.961 | 0.974 | 0.983 | 0.988 | 0.992 |
| 0.509999999999999 | 0.51 | 0.638 | 0.741 | 0.819 | 0.875 | 0.915 | 0.943 | 0.961 | 0.974 | 0.983 | 0.988 | 0.992 |
| 0.510499999999999 | 0.51 | 0.639 | 0.742 | 0.819 | 0.876 | 0.915 | 0.943 | 0.961 | 0.974 | 0.983 | 0.988 | 0.992 |
| 0.510999999999999 | 0.511 | 0.639 | 0.742 | 0.82 | 0.876 | 0.915 | 0.943 | 0.961 | 0.974 | 0.983 | 0.988 | 0.992 |
| 0.511499999999999 | 0.511 | 0.64 | 0.742 | 0.82 | 0.876 | 0.916 | 0.943 | 0.962 | 0.974 | 0.983 | 0.988 | 0.992 |
| 0.511999999999999 | 0.512 | 0.64 | 0.743 | 0.82 | 0.876 | 0.916 | 0.943 | 0.962 | 0.974 | 0.983 | 0.988 | 0.992 |
| 0.512499999999999 | 0.512 | 0.64 | 0.743 | 0.82 | 0.876 | 0.916 | 0.943 | 0.962 | 0.974 | 0.983 | 0.988 | 0.992 |
| 0.512999999999999 | 0.513 | 0.641 | 0.743 | 0.821 | 0.876 | 0.916 | 0.943 | 0.962 | 0.974 | 0.983 | 0.988 | 0.992 |
| 0.513499999999999 | 0.513 | 0.641 | 0.744 | 0.821 | 0.877 | 0.916 | 0.943 | 0.962 | 0.974 | 0.983 | 0.989 | 0.992 |
| 0.513999999999999 | 0.514 | 0.642 | 0.744 | 0.821 | 0.877 | 0.916 | 0.943 | 0.962 | 0.974 | 0.983 | 0.989 | 0.992 |
| 0.514499999999999 | 0.514 | 0.642 | 0.744 | 0.821 | 0.877 | 0.916 | 0.943 | 0.962 | 0.974 | 0.983 | 0.989 | 0.992 |
| 0.514999999999999 | 0.515 | 0.642 | 0.745 | 0.822 | 0.877 | 0.916 | 0.943 | 0.962 | 0.974 | 0.983 | 0.989 | 0.992 |
| 0.515499999999999 | 0.515 | 0.643 | 0.745 | 0.822 | 0.877 | 0.916 | 0.943 | 0.962 | 0.974 | 0.983 | 0.989 | 0.992 |
| 0.515999999999999 | 0.516 | 0.643 | 0.745 | 0.822 | 0.877 | 0.917 | 0.944 | 0.962 | 0.975 | 0.983 | 0.989 | 0.992 |
| 0.516499999999999 | 0.516 | 0.644 | 0.746 | 0.822 | 0.878 | 0.917 | 0.944 | 0.962 | 0.975 | 0.983 | 0.989 | 0.992 |
| 0.516999999999998 | 0.517 | 0.644 | 0.746 | 0.822 | 0.878 | 0.917 | 0.944 | 0.962 | 0.975 | 0.983 | 0.989 | 0.992 |
| 0.517499999999998 | 0.517 | 0.645 | 0.746 | 0.823 | 0.878 | 0.917 | 0.944 | 0.962 | 0.975 | 0.983 | 0.989 | 0.992 |
| 0.517999999999998 | 0.518 | 0.645 | 0.747 | 0.823 | 0.878 | 0.917 | 0.944 | 0.962 | 0.975 | 0.983 | 0.989 | 0.992 |
| 0.518499999999998 | 0.518 | 0.645 | 0.747 | 0.823 | 0.878 | 0.917 | 0.944 | 0.962 | 0.975 | 0.983 | 0.989 | 0.992 |
| 0.518999999999998 | 0.519 | 0.646 | 0.747 | 0.823 | 0.878 | 0.917 | 0.944 | 0.962 | 0.975 | 0.983 | 0.989 | 0.992 |
| 0.519499999999998 | 0.519 | 0.646 | 0.747 | 0.824 | 0.879 | 0.917 | 0.944 | 0.962 | 0.975 | 0.983 | 0.989 | 0.992 |
| 0.519999999999998 | 0.52 | 0.647 | 0.748 | 0.824 | 0.879 | 0.917 | 0.944 | 0.962 | 0.975 | 0.983 | 0.989 | 0.992 |
| 0.520499999999998 | 0.52 | 0.647 | 0.748 | 0.824 | 0.879 | 0.918 | 0.944 | 0.963 | 0.975 | 0.983 | 0.989 | 0.992 |
| 0.520999999999998 | 0.521 | 0.647 | 0.748 | 0.824 | 0.879 | 0.918 | 0.944 | 0.963 | 0.975 | 0.983 | 0.989 | 0.992 |
| 0.521499999999998 | 0.521 | 0.648 | 0.749 | 0.825 | 0.879 | 0.918 | 0.944 | 0.963 | 0.975 | 0.983 | 0.989 | 0.993 |
| 0.521999999999998 | 0.522 | 0.648 | 0.749 | 0.825 | 0.879 | 0.918 | 0.945 | 0.963 | 0.975 | 0.983 | 0.989 | 0.993 |
| 0.522499999999998 | 0.522 | 0.649 | 0.749 | 0.825 | 0.88 | 0.918 | 0.945 | 0.963 | 0.975 | 0.983 | 0.989 | 0.993 |
| 0.522999999999998 | 0.523 | 0.649 | 0.75 | 0.825 | 0.88 | 0.918 | 0.945 | 0.963 | 0.975 | 0.983 | 0.989 | 0.993 |
| 0.523499999999998 | 0.523 | 0.65 | 0.75 | 0.825 | 0.88 | 0.918 | 0.945 | 0.963 | 0.975 | 0.983 | 0.989 | 0.993 |
| 0.523999999999998 | 0.524 | 0.65 | 0.75 | 0.826 | 0.88 | 0.918 | 0.945 | 0.963 | 0.975 | 0.983 | 0.989 | 0.993 |
| 0.524499999999998 | 0.524 | 0.65 | 0.751 | 0.826 | 0.88 | 0.919 | 0.945 | 0.963 | 0.975 | 0.983 | 0.989 | 0.993 |
| 0.524999999999998 | 0.525 | 0.651 | 0.751 | 0.826 | 0.88 | 0.919 | 0.945 | 0.963 | 0.975 | 0.983 | 0.989 | 0.993 |
| 0.525499999999998 | 0.525 | 0.651 | 0.751 | 0.826 | 0.881 | 0.919 | 0.945 | 0.963 | 0.975 | 0.983 | 0.989 | 0.993 |
| 0.525999999999997 | 0.526 | 0.652 | 0.752 | 0.827 | 0.881 | 0.919 | 0.945 | 0.963 | 0.975 | 0.983 | 0.989 | 0.993 |
| 0.526499999999997 | 0.526 | 0.652 | 0.752 | 0.827 | 0.881 | 0.919 | 0.945 | 0.963 | 0.975 | 0.983 | 0.989 | 0.993 |
| 0.526999999999997 | 0.527 | 0.652 | 0.752 | 0.827 | 0.881 | 0.919 | 0.945 | 0.963 | 0.975 | 0.983 | 0.989 | 0.993 |
| 0.527499999999997 | 0.527 | 0.653 | 0.753 | 0.827 | 0.881 | 0.919 | 0.945 | 0.963 | 0.975 | 0.984 | 0.989 | 0.993 |
| 0.527999999999997 | 0.528 | 0.653 | 0.753 | 0.828 | 0.881 | 0.919 | 0.945 | 0.963 | 0.975 | 0.984 | 0.989 | 0.993 |
| 0.528499999999997 | 0.528 | 0.654 | 0.753 | 0.828 | 0.882 | 0.919 | 0.946 | 0.963 | 0.975 | 0.984 | 0.989 | 0.993 |
| 0.528999999999997 | 0.529 | 0.654 | 0.754 | 0.828 | 0.882 | 0.92 | 0.946 | 0.963 | 0.975 | 0.984 | 0.989 | 0.993 |
| 0.529499999999997 | 0.529 | 0.655 | 0.754 | 0.828 | 0.882 | 0.92 | 0.946 | 0.963 | 0.975 | 0.984 | 0.989 | 0.993 |
| 0.529999999999997 | 0.53 | 0.655 | 0.754 | 0.829 | 0.882 | 0.92 | 0.946 | 0.964 | 0.976 | 0.984 | 0.989 | 0.993 |
| 0.530499999999997 | 0.53 | 0.655 | 0.754 | 0.829 | 0.882 | 0.92 | 0.946 | 0.964 | 0.976 | 0.984 | 0.989 | 0.993 |
| 0.530999999999997 | 0.531 | 0.656 | 0.755 | 0.829 | 0.882 | 0.92 | 0.946 | 0.964 | 0.976 | 0.984 | 0.989 | 0.993 |
| 0.531499999999997 | 0.531 | 0.656 | 0.755 | 0.829 | 0.883 | 0.92 | 0.946 | 0.964 | 0.976 | 0.984 | 0.989 | 0.993 |
| 0.531999999999997 | 0.532 | 0.657 | 0.755 | 0.829 | 0.883 | 0.92 | 0.946 | 0.964 | 0.976 | 0.984 | 0.989 | 0.993 |
| 0.532499999999997 | 0.532 | 0.657 | 0.756 | 0.83 | 0.883 | 0.92 | 0.946 | 0.964 | 0.976 | 0.984 | 0.989 | 0.993 |
| 0.532999999999997 | 0.533 | 0.657 | 0.756 | 0.83 | 0.883 | 0.92 | 0.946 | 0.964 | 0.976 | 0.984 | 0.989 | 0.993 |
| 0.533499999999997 | 0.533 | 0.658 | 0.756 | 0.83 | 0.883 | 0.921 | 0.946 | 0.964 | 0.976 | 0.984 | 0.989 | 0.993 |
| 0.533999999999997 | 0.534 | 0.658 | 0.757 | 0.83 | 0.883 | 0.921 | 0.946 | 0.964 | 0.976 | 0.984 | 0.989 | 0.993 |
| 0.534499999999997 | 0.534 | 0.659 | 0.757 | 0.831 | 0.884 | 0.921 | 0.946 | 0.964 | 0.976 | 0.984 | 0.989 | 0.993 |
| 0.534999999999996 | 0.535 | 0.659 | 0.757 | 0.831 | 0.884 | 0.921 | 0.947 | 0.964 | 0.976 | 0.984 | 0.989 | 0.993 |
| 0.535499999999996 | 0.535 | 0.659 | 0.758 | 0.831 | 0.884 | 0.921 | 0.947 | 0.964 | 0.976 | 0.984 | 0.989 | 0.993 |
| 0.535999999999996 | 0.536 | 0.66 | 0.758 | 0.831 | 0.884 | 0.921 | 0.947 | 0.964 | 0.976 | 0.984 | 0.989 | 0.993 |
| 0.536499999999996 | 0.536 | 0.66 | 0.758 | 0.832 | 0.884 | 0.921 | 0.947 | 0.964 | 0.976 | 0.984 | 0.989 | 0.993 |
| 0.536999999999996 | 0.537 | 0.661 | 0.759 | 0.832 | 0.884 | 0.921 | 0.947 | 0.964 | 0.976 | 0.984 | 0.989 | 0.993 |
| 0.537499999999996 | 0.537 | 0.661 | 0.759 | 0.832 | 0.885 | 0.921 | 0.947 | 0.964 | 0.976 | 0.984 | 0.989 | 0.993 |
| 0.537999999999996 | 0.538 | 0.661 | 0.759 | 0.832 | 0.885 | 0.922 | 0.947 | 0.964 | 0.976 | 0.984 | 0.989 | 0.993 |
| 0.538499999999996 | 0.538 | 0.662 | 0.759 | 0.832 | 0.885 | 0.922 | 0.947 | 0.964 | 0.976 | 0.984 | 0.989 | 0.993 |
| 0.538999999999996 | 0.539 | 0.662 | 0.76 | 0.833 | 0.885 | 0.922 | 0.947 | 0.964 | 0.976 | 0.984 | 0.989 | 0.993 |
| 0.539499999999996 | 0.539 | 0.663 | 0.76 | 0.833 | 0.885 | 0.922 | 0.947 | 0.965 | 0.976 | 0.984 | 0.989 | 0.993 |
| 0.539999999999996 | 0.54 | 0.663 | 0.76 | 0.833 | 0.885 | 0.922 | 0.947 | 0.965 | 0.976 | 0.984 | 0.989 | 0.993 |
| 0.540499999999996 | 0.54 | 0.664 | 0.761 | 0.833 | 0.886 | 0.922 | 0.947 | 0.965 | 0.976 | 0.984 | 0.989 | 0.993 |
| 0.540999999999996 | 0.541 | 0.664 | 0.761 | 0.834 | 0.886 | 0.922 | 0.947 | 0.965 | 0.976 | 0.984 | 0.989 | 0.993 |
| 0.541499999999996 | 0.541 | 0.664 | 0.761 | 0.834 | 0.886 | 0.922 | 0.948 | 0.965 | 0.976 | 0.984 | 0.989 | 0.993 |
| 0.541999999999996 | 0.542 | 0.665 | 0.762 | 0.834 | 0.886 | 0.923 | 0.948 | 0.965 | 0.976 | 0.984 | 0.989 | 0.993 |
| 0.542499999999996 | 0.542 | 0.665 | 0.762 | 0.834 | 0.886 | 0.923 | 0.948 | 0.965 | 0.976 | 0.984 | 0.989 | 0.993 |
| 0.542999999999996 | 0.543 | 0.666 | 0.762 | 0.834 | 0.886 | 0.923 | 0.948 | 0.965 | 0.976 | 0.984 | 0.989 | 0.993 |
| 0.543499999999996 | 0.543 | 0.666 | 0.763 | 0.835 | 0.887 | 0.923 | 0.948 | 0.965 | 0.976 | 0.984 | 0.989 | 0.993 |
| 0.543999999999995 | 0.544 | 0.666 | 0.763 | 0.835 | 0.887 | 0.923 | 0.948 | 0.965 | 0.977 | 0.984 | 0.989 | 0.993 |
| 0.544499999999995 | 0.544 | 0.667 | 0.763 | 0.835 | 0.887 | 0.923 | 0.948 | 0.965 | 0.977 | 0.984 | 0.99 | 0.993 |
| 0.544999999999995 | 0.545 | 0.667 | 0.764 | 0.835 | 0.887 | 0.923 | 0.948 | 0.965 | 0.977 | 0.984 | 0.99 | 0.993 |
| 0.545499999999995 | 0.545 | 0.668 | 0.764 | 0.836 | 0.887 | 0.923 | 0.948 | 0.965 | 0.977 | 0.984 | 0.99 | 0.993 |
| 0.545999999999995 | 0.546 | 0.668 | 0.764 | 0.836 | 0.887 | 0.923 | 0.948 | 0.965 | 0.977 | 0.984 | 0.99 | 0.993 |
| 0.546499999999995 | 0.546 | 0.668 | 0.764 | 0.836 | 0.887 | 0.924 | 0.948 | 0.965 | 0.977 | 0.984 | 0.99 | 0.993 |
| 0.546999999999995 | 0.547 | 0.669 | 0.765 | 0.836 | 0.888 | 0.924 | 0.948 | 0.965 | 0.977 | 0.984 | 0.99 | 0.993 |
| 0.547499999999995 | 0.547 | 0.669 | 0.765 | 0.837 | 0.888 | 0.924 | 0.948 | 0.965 | 0.977 | 0.984 | 0.99 | 0.993 |
| 0.547999999999995 | 0.548 | 0.67 | 0.765 | 0.837 | 0.888 | 0.924 | 0.949 | 0.965 | 0.977 | 0.984 | 0.99 | 0.993 |
| 0.548499999999995 | 0.548 | 0.67 | 0.766 | 0.837 | 0.888 | 0.924 | 0.949 | 0.965 | 0.977 | 0.984 | 0.99 | 0.993 |
| 0.548999999999995 | 0.549 | 0.67 | 0.766 | 0.837 | 0.888 | 0.924 | 0.949 | 0.966 | 0.977 | 0.985 | 0.99 | 0.993 |
| 0.549499999999995 | 0.549 | 0.671 | 0.766 | 0.837 | 0.888 | 0.924 | 0.949 | 0.966 | 0.977 | 0.985 | 0.99 | 0.993 |
| 0.549999999999995 | 0.55 | 0.671 | 0.767 | 0.838 | 0.889 | 0.924 | 0.949 | 0.966 | 0.977 | 0.985 | 0.99 | 0.993 |
| 0.550499999999995 | 0.55 | 0.672 | 0.767 | 0.838 | 0.889 | 0.924 | 0.949 | 0.966 | 0.977 | 0.985 | 0.99 | 0.993 |
| 0.550999999999995 | 0.551 | 0.672 | 0.767 | 0.838 | 0.889 | 0.925 | 0.949 | 0.966 | 0.977 | 0.985 | 0.99 | 0.993 |
| 0.551499999999995 | 0.551 | 0.673 | 0.768 | 0.838 | 0.889 | 0.925 | 0.949 | 0.966 | 0.977 | 0.985 | 0.99 | 0.993 |
| 0.551999999999995 | 0.552 | 0.673 | 0.768 | 0.839 | 0.889 | 0.925 | 0.949 | 0.966 | 0.977 | 0.985 | 0.99 | 0.993 |
| 0.552499999999995 | 0.552 | 0.673 | 0.768 | 0.839 | 0.889 | 0.925 | 0.949 | 0.966 | 0.977 | 0.985 | 0.99 | 0.993 |
| 0.552999999999994 | 0.553 | 0.674 | 0.769 | 0.839 | 0.89 | 0.925 | 0.949 | 0.966 | 0.977 | 0.985 | 0.99 | 0.993 |
| 0.553499999999994 | 0.553 | 0.674 | 0.769 | 0.839 | 0.89 | 0.925 | 0.949 | 0.966 | 0.977 | 0.985 | 0.99 | 0.993 |
| 0.553999999999994 | 0.554 | 0.675 | 0.769 | 0.839 | 0.89 | 0.925 | 0.949 | 0.966 | 0.977 | 0.985 | 0.99 | 0.993 |
| 0.554499999999994 | 0.554 | 0.675 | 0.769 | 0.84 | 0.89 | 0.925 | 0.95 | 0.966 | 0.977 | 0.985 | 0.99 | 0.993 |
| 0.554999999999994 | 0.555 | 0.675 | 0.77 | 0.84 | 0.89 | 0.925 | 0.95 | 0.966 | 0.977 | 0.985 | 0.99 | 0.993 |
| 0.555499999999994 | 0.555 | 0.676 | 0.77 | 0.84 | 0.89 | 0.926 | 0.95 | 0.966 | 0.977 | 0.985 | 0.99 | 0.993 |
| 0.555999999999994 | 0.556 | 0.676 | 0.77 | 0.84 | 0.891 | 0.926 | 0.95 | 0.966 | 0.977 | 0.985 | 0.99 | 0.993 |
| 0.556499999999994 | 0.556 | 0.677 | 0.771 | 0.841 | 0.891 | 0.926 | 0.95 | 0.966 | 0.977 | 0.985 | 0.99 | 0.993 |
| 0.556999999999994 | 0.557 | 0.677 | 0.771 | 0.841 | 0.891 | 0.926 | 0.95 | 0.966 | 0.977 | 0.985 | 0.99 | 0.993 |
| 0.557499999999994 | 0.557 | 0.677 | 0.771 | 0.841 | 0.891 | 0.926 | 0.95 | 0.966 | 0.977 | 0.985 | 0.99 | 0.993 |
| 0.557999999999994 | 0.558 | 0.678 | 0.772 | 0.841 | 0.891 | 0.926 | 0.95 | 0.966 | 0.977 | 0.985 | 0.99 | 0.993 |
| 0.558499999999994 | 0.558 | 0.678 | 0.772 | 0.841 | 0.891 | 0.926 | 0.95 | 0.966 | 0.978 | 0.985 | 0.99 | 0.993 |
| 0.558999999999994 | 0.559 | 0.679 | 0.772 | 0.842 | 0.891 | 0.926 | 0.95 | 0.967 | 0.978 | 0.985 | 0.99 | 0.993 |
| 0.559499999999994 | 0.559 | 0.679 | 0.773 | 0.842 | 0.892 | 0.926 | 0.95 | 0.967 | 0.978 | 0.985 | 0.99 | 0.993 |
| 0.559999999999994 | 0.56 | 0.679 | 0.773 | 0.842 | 0.892 | 0.926 | 0.95 | 0.967 | 0.978 | 0.985 | 0.99 | 0.993 |
| 0.560499999999994 | 0.56 | 0.68 | 0.773 | 0.842 | 0.892 | 0.927 | 0.95 | 0.967 | 0.978 | 0.985 | 0.99 | 0.993 |
| 0.560999999999994 | 0.561 | 0.68 | 0.773 | 0.843 | 0.892 | 0.927 | 0.951 | 0.967 | 0.978 | 0.985 | 0.99 | 0.993 |
| 0.561499999999994 | 0.561 | 0.681 | 0.774 | 0.843 | 0.892 | 0.927 | 0.951 | 0.967 | 0.978 | 0.985 | 0.99 | 0.993 |
| 0.561999999999993 | 0.562 | 0.681 | 0.774 | 0.843 | 0.892 | 0.927 | 0.951 | 0.967 | 0.978 | 0.985 | 0.99 | 0.993 |
| 0.562499999999993 | 0.562 | 0.681 | 0.774 | 0.843 | 0.893 | 0.927 | 0.951 | 0.967 | 0.978 | 0.985 | 0.99 | 0.993 |
| 0.562999999999993 | 0.563 | 0.682 | 0.775 | 0.843 | 0.893 | 0.927 | 0.951 | 0.967 | 0.978 | 0.985 | 0.99 | 0.993 |
| 0.563499999999993 | 0.563 | 0.682 | 0.775 | 0.844 | 0.893 | 0.927 | 0.951 | 0.967 | 0.978 | 0.985 | 0.99 | 0.993 |
| 0.563999999999993 | 0.564 | 0.683 | 0.775 | 0.844 | 0.893 | 0.927 | 0.951 | 0.967 | 0.978 | 0.985 | 0.99 | 0.993 |
| 0.564499999999993 | 0.564 | 0.683 | 0.776 | 0.844 | 0.893 | 0.927 | 0.951 | 0.967 | 0.978 | 0.985 | 0.99 | 0.993 |
| 0.564999999999993 | 0.565 | 0.683 | 0.776 | 0.844 | 0.893 | 0.928 | 0.951 | 0.967 | 0.978 | 0.985 | 0.99 | 0.993 |
| 0.565499999999993 | 0.565 | 0.684 | 0.776 | 0.845 | 0.894 | 0.928 | 0.951 | 0.967 | 0.978 | 0.985 | 0.99 | 0.993 |
| 0.565999999999993 | 0.566 | 0.684 | 0.776 | 0.845 | 0.894 | 0.928 | 0.951 | 0.967 | 0.978 | 0.985 | 0.99 | 0.993 |
| 0.566499999999993 | 0.566 | 0.685 | 0.777 | 0.845 | 0.894 | 0.928 | 0.951 | 0.967 | 0.978 | 0.985 | 0.99 | 0.993 |
| 0.566999999999993 | 0.567 | 0.685 | 0.777 | 0.845 | 0.894 | 0.928 | 0.951 | 0.967 | 0.978 | 0.985 | 0.99 | 0.993 |
| 0.567499999999993 | 0.567 | 0.685 | 0.777 | 0.845 | 0.894 | 0.928 | 0.951 | 0.967 | 0.978 | 0.985 | 0.99 | 0.993 |
| 0.567999999999993 | 0.568 | 0.686 | 0.778 | 0.846 | 0.894 | 0.928 | 0.952 | 0.967 | 0.978 | 0.985 | 0.99 | 0.993 |
| 0.568499999999993 | 0.568 | 0.686 | 0.778 | 0.846 | 0.894 | 0.928 | 0.952 | 0.967 | 0.978 | 0.985 | 0.99 | 0.993 |
| 0.568999999999993 | 0.569 | 0.687 | 0.778 | 0.846 | 0.895 | 0.928 | 0.952 | 0.968 | 0.978 | 0.985 | 0.99 | 0.994 |
| 0.569499999999993 | 0.569 | 0.687 | 0.779 | 0.846 | 0.895 | 0.929 | 0.952 | 0.968 | 0.978 | 0.985 | 0.99 | 0.994 |
| 0.569999999999993 | 0.57 | 0.687 | 0.779 | 0.847 | 0.895 | 0.929 | 0.952 | 0.968 | 0.978 | 0.985 | 0.99 | 0.994 |
| 0.570499999999993 | 0.57 | 0.688 | 0.779 | 0.847 | 0.895 | 0.929 | 0.952 | 0.968 | 0.978 | 0.986 | 0.99 | 0.994 |
| 0.570999999999993 | 0.571 | 0.688 | 0.78 | 0.847 | 0.895 | 0.929 | 0.952 | 0.968 | 0.978 | 0.986 | 0.99 | 0.994 |
| 0.571499999999992 | 0.571 | 0.689 | 0.78 | 0.847 | 0.895 | 0.929 | 0.952 | 0.968 | 0.978 | 0.986 | 0.99 | 0.994 |
| 0.571999999999992 | 0.572 | 0.689 | 0.78 | 0.847 | 0.896 | 0.929 | 0.952 | 0.968 | 0.978 | 0.986 | 0.99 | 0.994 |
| 0.572499999999992 | 0.572 | 0.689 | 0.78 | 0.848 | 0.896 | 0.929 | 0.952 | 0.968 | 0.978 | 0.986 | 0.99 | 0.994 |
| 0.572999999999992 | 0.573 | 0.69 | 0.781 | 0.848 | 0.896 | 0.929 | 0.952 | 0.968 | 0.979 | 0.986 | 0.99 | 0.994 |
| 0.573499999999992 | 0.573 | 0.69 | 0.781 | 0.848 | 0.896 | 0.929 | 0.952 | 0.968 | 0.979 | 0.986 | 0.99 | 0.994 |
| 0.573999999999992 | 0.574 | 0.691 | 0.781 | 0.848 | 0.896 | 0.93 | 0.952 | 0.968 | 0.979 | 0.986 | 0.99 | 0.994 |
| 0.574499999999992 | 0.574 | 0.691 | 0.782 | 0.849 | 0.896 | 0.93 | 0.953 | 0.968 | 0.979 | 0.986 | 0.99 | 0.994 |
| 0.574999999999992 | 0.575 | 0.691 | 0.782 | 0.849 | 0.896 | 0.93 | 0.953 | 0.968 | 0.979 | 0.986 | 0.99 | 0.994 |
| 0.575499999999992 | 0.575 | 0.692 | 0.782 | 0.849 | 0.897 | 0.93 | 0.953 | 0.968 | 0.979 | 0.986 | 0.99 | 0.994 |
| 0.575999999999992 | 0.576 | 0.692 | 0.783 | 0.849 | 0.897 | 0.93 | 0.953 | 0.968 | 0.979 | 0.986 | 0.99 | 0.994 |
| 0.576499999999992 | 0.576 | 0.693 | 0.783 | 0.849 | 0.897 | 0.93 | 0.953 | 0.968 | 0.979 | 0.986 | 0.99 | 0.994 |
| 0.576999999999992 | 0.577 | 0.693 | 0.783 | 0.85 | 0.897 | 0.93 | 0.953 | 0.968 | 0.979 | 0.986 | 0.991 | 0.994 |
| 0.577499999999992 | 0.577 | 0.693 | 0.783 | 0.85 | 0.897 | 0.93 | 0.953 | 0.968 | 0.979 | 0.986 | 0.991 | 0.994 |
| 0.577999999999992 | 0.578 | 0.694 | 0.784 | 0.85 | 0.897 | 0.93 | 0.953 | 0.968 | 0.979 | 0.986 | 0.991 | 0.994 |
| 0.578499999999992 | 0.578 | 0.694 | 0.784 | 0.85 | 0.898 | 0.93 | 0.953 | 0.968 | 0.979 | 0.986 | 0.991 | 0.994 |
| 0.578999999999992 | 0.579 | 0.695 | 0.784 | 0.851 | 0.898 | 0.931 | 0.953 | 0.969 | 0.979 | 0.986 | 0.991 | 0.994 |
| 0.579499999999992 | 0.579 | 0.695 | 0.785 | 0.851 | 0.898 | 0.931 | 0.953 | 0.969 | 0.979 | 0.986 | 0.991 | 0.994 |
| 0.579999999999992 | 0.58 | 0.695 | 0.785 | 0.851 | 0.898 | 0.931 | 0.953 | 0.969 | 0.979 | 0.986 | 0.991 | 0.994 |
| 0.580499999999991 | 0.58 | 0.696 | 0.785 | 0.851 | 0.898 | 0.931 | 0.953 | 0.969 | 0.979 | 0.986 | 0.991 | 0.994 |
| 0.580999999999991 | 0.581 | 0.696 | 0.786 | 0.851 | 0.898 | 0.931 | 0.953 | 0.969 | 0.979 | 0.986 | 0.991 | 0.994 |
| 0.581499999999991 | 0.581 | 0.697 | 0.786 | 0.852 | 0.898 | 0.931 | 0.954 | 0.969 | 0.979 | 0.986 | 0.991 | 0.994 |
| 0.581999999999991 | 0.582 | 0.697 | 0.786 | 0.852 | 0.899 | 0.931 | 0.954 | 0.969 | 0.979 | 0.986 | 0.991 | 0.994 |
| 0.582499999999991 | 0.582 | 0.697 | 0.786 | 0.852 | 0.899 | 0.931 | 0.954 | 0.969 | 0.979 | 0.986 | 0.991 | 0.994 |
| 0.582999999999991 | 0.583 | 0.698 | 0.787 | 0.852 | 0.899 | 0.931 | 0.954 | 0.969 | 0.979 | 0.986 | 0.991 | 0.994 |
| 0.583499999999991 | 0.583 | 0.698 | 0.787 | 0.852 | 0.899 | 0.932 | 0.954 | 0.969 | 0.979 | 0.986 | 0.991 | 0.994 |
| 0.583999999999991 | 0.584 | 0.699 | 0.787 | 0.853 | 0.899 | 0.932 | 0.954 | 0.969 | 0.979 | 0.986 | 0.991 | 0.994 |
| 0.584499999999991 | 0.584 | 0.699 | 0.788 | 0.853 | 0.899 | 0.932 | 0.954 | 0.969 | 0.979 | 0.986 | 0.991 | 0.994 |
| 0.584999999999991 | 0.585 | 0.699 | 0.788 | 0.853 | 0.9 | 0.932 | 0.954 | 0.969 | 0.979 | 0.986 | 0.991 | 0.994 |
| 0.585499999999991 | 0.585 | 0.7 | 0.788 | 0.853 | 0.9 | 0.932 | 0.954 | 0.969 | 0.979 | 0.986 | 0.991 | 0.994 |
| 0.585999999999991 | 0.586 | 0.7 | 0.789 | 0.854 | 0.9 | 0.932 | 0.954 | 0.969 | 0.979 | 0.986 | 0.991 | 0.994 |
| 0.586499999999991 | 0.586 | 0.701 | 0.789 | 0.854 | 0.9 | 0.932 | 0.954 | 0.969 | 0.979 | 0.986 | 0.991 | 0.994 |
| 0.586999999999991 | 0.587 | 0.701 | 0.789 | 0.854 | 0.9 | 0.932 | 0.954 | 0.969 | 0.979 | 0.986 | 0.991 | 0.994 |
| 0.587499999999991 | 0.587 | 0.701 | 0.789 | 0.854 | 0.9 | 0.932 | 0.954 | 0.969 | 0.979 | 0.986 | 0.991 | 0.994 |
| 0.587999999999991 | 0.588 | 0.702 | 0.79 | 0.854 | 0.9 | 0.932 | 0.954 | 0.969 | 0.979 | 0.986 | 0.991 | 0.994 |
| 0.588499999999991 | 0.588 | 0.702 | 0.79 | 0.855 | 0.901 | 0.933 | 0.955 | 0.969 | 0.98 | 0.986 | 0.991 | 0.994 |
| 0.588999999999991 | 0.589 | 0.703 | 0.79 | 0.855 | 0.901 | 0.933 | 0.955 | 0.969 | 0.98 | 0.986 | 0.991 | 0.994 |
| 0.58949999999999 | 0.589 | 0.703 | 0.791 | 0.855 | 0.901 | 0.933 | 0.955 | 0.97 | 0.98 | 0.986 | 0.991 | 0.994 |
| 0.58999999999999 | 0.59 | 0.703 | 0.791 | 0.855 | 0.901 | 0.933 | 0.955 | 0.97 | 0.98 | 0.986 | 0.991 | 0.994 |
| 0.59049999999999 | 0.59 | 0.704 | 0.791 | 0.855 | 0.901 | 0.933 | 0.955 | 0.97 | 0.98 | 0.986 | 0.991 | 0.994 |
| 0.59099999999999 | 0.591 | 0.704 | 0.792 | 0.856 | 0.901 | 0.933 | 0.955 | 0.97 | 0.98 | 0.986 | 0.991 | 0.994 |
| 0.59149999999999 | 0.591 | 0.705 | 0.792 | 0.856 | 0.901 | 0.933 | 0.955 | 0.97 | 0.98 | 0.986 | 0.991 | 0.994 |
| 0.59199999999999 | 0.592 | 0.705 | 0.792 | 0.856 | 0.902 | 0.933 | 0.955 | 0.97 | 0.98 | 0.986 | 0.991 | 0.994 |
| 0.59249999999999 | 0.592 | 0.705 | 0.792 | 0.856 | 0.902 | 0.933 | 0.955 | 0.97 | 0.98 | 0.986 | 0.991 | 0.994 |
| 0.59299999999999 | 0.593 | 0.706 | 0.793 | 0.857 | 0.902 | 0.933 | 0.955 | 0.97 | 0.98 | 0.986 | 0.991 | 0.994 |
| 0.59349999999999 | 0.593 | 0.706 | 0.793 | 0.857 | 0.902 | 0.934 | 0.955 | 0.97 | 0.98 | 0.987 | 0.991 | 0.994 |
| 0.59399999999999 | 0.594 | 0.707 | 0.793 | 0.857 | 0.902 | 0.934 | 0.955 | 0.97 | 0.98 | 0.987 | 0.991 | 0.994 |
| 0.59449999999999 | 0.594 | 0.707 | 0.794 | 0.857 | 0.902 | 0.934 | 0.955 | 0.97 | 0.98 | 0.987 | 0.991 | 0.994 |
| 0.59499999999999 | 0.595 | 0.707 | 0.794 | 0.857 | 0.903 | 0.934 | 0.955 | 0.97 | 0.98 | 0.987 | 0.991 | 0.994 |
| 0.59549999999999 | 0.595 | 0.708 | 0.794 | 0.858 | 0.903 | 0.934 | 0.956 | 0.97 | 0.98 | 0.987 | 0.991 | 0.994 |
| 0.59599999999999 | 0.596 | 0.708 | 0.795 | 0.858 | 0.903 | 0.934 | 0.956 | 0.97 | 0.98 | 0.987 | 0.991 | 0.994 |
| 0.59649999999999 | 0.596 | 0.709 | 0.795 | 0.858 | 0.903 | 0.934 | 0.956 | 0.97 | 0.98 | 0.987 | 0.991 | 0.994 |
| 0.59699999999999 | 0.597 | 0.709 | 0.795 | 0.858 | 0.903 | 0.934 | 0.956 | 0.97 | 0.98 | 0.987 | 0.991 | 0.994 |
| 0.59749999999999 | 0.597 | 0.709 | 0.795 | 0.858 | 0.903 | 0.934 | 0.956 | 0.97 | 0.98 | 0.987 | 0.991 | 0.994 |
| 0.59799999999999 | 0.598 | 0.71 | 0.796 | 0.859 | 0.903 | 0.935 | 0.956 | 0.97 | 0.98 | 0.987 | 0.991 | 0.994 |
| 0.598499999999989 | 0.598 | 0.71 | 0.796 | 0.859 | 0.904 | 0.935 | 0.956 | 0.97 | 0.98 | 0.987 | 0.991 | 0.994 |
| 0.598999999999989 | 0.599 | 0.711 | 0.796 | 0.859 | 0.904 | 0.935 | 0.956 | 0.97 | 0.98 | 0.987 | 0.991 | 0.994 |
| 0.599499999999989 | 0.599 | 0.711 | 0.797 | 0.859 | 0.904 | 0.935 | 0.956 | 0.97 | 0.98 | 0.987 | 0.991 | 0.994 |
| 0.599999999999989 | 0.6 | 0.711 | 0.797 | 0.86 | 0.904 | 0.935 | 0.956 | 0.971 | 0.98 | 0.987 | 0.991 | 0.994 |
| 0.600499999999989 | 0.6 | 0.712 | 0.797 | 0.86 | 0.904 | 0.935 | 0.956 | 0.971 | 0.98 | 0.987 | 0.991 | 0.994 |
| 0.600999999999989 | 0.601 | 0.712 | 0.797 | 0.86 | 0.904 | 0.935 | 0.956 | 0.971 | 0.98 | 0.987 | 0.991 | 0.994 |
| 0.601499999999989 | 0.601 | 0.713 | 0.798 | 0.86 | 0.904 | 0.935 | 0.956 | 0.971 | 0.98 | 0.987 | 0.991 | 0.994 |
| 0.601999999999989 | 0.602 | 0.713 | 0.798 | 0.86 | 0.905 | 0.935 | 0.956 | 0.971 | 0.98 | 0.987 | 0.991 | 0.994 |
| 0.602499999999989 | 0.602 | 0.713 | 0.798 | 0.861 | 0.905 | 0.935 | 0.956 | 0.971 | 0.98 | 0.987 | 0.991 | 0.994 |
| 0.602999999999989 | 0.603 | 0.714 | 0.799 | 0.861 | 0.905 | 0.936 | 0.957 | 0.971 | 0.98 | 0.987 | 0.991 | 0.994 |
| 0.603499999999989 | 0.603 | 0.714 | 0.799 | 0.861 | 0.905 | 0.936 | 0.957 | 0.971 | 0.98 | 0.987 | 0.991 | 0.994 |
| 0.603999999999989 | 0.604 | 0.715 | 0.799 | 0.861 | 0.905 | 0.936 | 0.957 | 0.971 | 0.981 | 0.987 | 0.991 | 0.994 |
| 0.604499999999989 | 0.604 | 0.715 | 0.8 | 0.861 | 0.905 | 0.936 | 0.957 | 0.971 | 0.981 | 0.987 | 0.991 | 0.994 |
| 0.604999999999989 | 0.605 | 0.715 | 0.8 | 0.862 | 0.906 | 0.936 | 0.957 | 0.971 | 0.981 | 0.987 | 0.991 | 0.994 |
| 0.605499999999989 | 0.605 | 0.716 | 0.8 | 0.862 | 0.906 | 0.936 | 0.957 | 0.971 | 0.981 | 0.987 | 0.991 | 0.994 |
| 0.605999999999989 | 0.606 | 0.716 | 0.8 | 0.862 | 0.906 | 0.936 | 0.957 | 0.971 | 0.981 | 0.987 | 0.991 | 0.994 |
| 0.606499999999989 | 0.606 | 0.717 | 0.801 | 0.862 | 0.906 | 0.936 | 0.957 | 0.971 | 0.981 | 0.987 | 0.991 | 0.994 |
| 0.606999999999988 | 0.607 | 0.717 | 0.801 | 0.863 | 0.906 | 0.936 | 0.957 | 0.971 | 0.981 | 0.987 | 0.991 | 0.994 |
| 0.607499999999988 | 0.607 | 0.717 | 0.801 | 0.863 | 0.906 | 0.936 | 0.957 | 0.971 | 0.981 | 0.987 | 0.991 | 0.994 |
| 0.607999999999988 | 0.608 | 0.718 | 0.802 | 0.863 | 0.906 | 0.937 | 0.957 | 0.971 | 0.981 | 0.987 | 0.991 | 0.994 |
| 0.608499999999988 | 0.608 | 0.718 | 0.802 | 0.863 | 0.907 | 0.937 | 0.957 | 0.971 | 0.981 | 0.987 | 0.991 | 0.994 |
| 0.608999999999988 | 0.609 | 0.718 | 0.802 | 0.863 | 0.907 | 0.937 | 0.957 | 0.971 | 0.981 | 0.987 | 0.991 | 0.994 |
| 0.609499999999988 | 0.609 | 0.719 | 0.802 | 0.864 | 0.907 | 0.937 | 0.957 | 0.971 | 0.981 | 0.987 | 0.991 | 0.994 |
| 0.609999999999988 | 0.61 | 0.719 | 0.803 | 0.864 | 0.907 | 0.937 | 0.958 | 0.971 | 0.981 | 0.987 | 0.991 | 0.994 |
| 0.610499999999988 | 0.61 | 0.72 | 0.803 | 0.864 | 0.907 | 0.937 | 0.958 | 0.972 | 0.981 | 0.987 | 0.991 | 0.994 |
| 0.610999999999988 | 0.611 | 0.72 | 0.803 | 0.864 | 0.907 | 0.937 | 0.958 | 0.972 | 0.981 | 0.987 | 0.991 | 0.994 |
| 0.611499999999988 | 0.611 | 0.72 | 0.804 | 0.864 | 0.907 | 0.937 | 0.958 | 0.972 | 0.981 | 0.987 | 0.992 | 0.994 |
| 0.611999999999988 | 0.612 | 0.721 | 0.804 | 0.865 | 0.908 | 0.937 | 0.958 | 0.972 | 0.981 | 0.987 | 0.992 | 0.994 |
| 0.612499999999988 | 0.612 | 0.721 | 0.804 | 0.865 | 0.908 | 0.937 | 0.958 | 0.972 | 0.981 | 0.987 | 0.992 | 0.994 |
| 0.612999999999988 | 0.613 | 0.722 | 0.805 | 0.865 | 0.908 | 0.938 | 0.958 | 0.972 | 0.981 | 0.987 | 0.992 | 0.994 |
| 0.613499999999988 | 0.613 | 0.722 | 0.805 | 0.865 | 0.908 | 0.938 | 0.958 | 0.972 | 0.981 | 0.987 | 0.992 | 0.994 |
| 0.613999999999988 | 0.614 | 0.722 | 0.805 | 0.865 | 0.908 | 0.938 | 0.958 | 0.972 | 0.981 | 0.987 | 0.992 | 0.994 |
| 0.614499999999988 | 0.614 | 0.723 | 0.805 | 0.866 | 0.908 | 0.938 | 0.958 | 0.972 | 0.981 | 0.987 | 0.992 | 0.994 |
| 0.614999999999988 | 0.615 | 0.723 | 0.806 | 0.866 | 0.908 | 0.938 | 0.958 | 0.972 | 0.981 | 0.987 | 0.992 | 0.994 |
| 0.615499999999988 | 0.615 | 0.724 | 0.806 | 0.866 | 0.909 | 0.938 | 0.958 | 0.972 | 0.981 | 0.987 | 0.992 | 0.994 |
| 0.615999999999987 | 0.616 | 0.724 | 0.806 | 0.866 | 0.909 | 0.938 | 0.958 | 0.972 | 0.981 | 0.987 | 0.992 | 0.994 |
| 0.616499999999987 | 0.616 | 0.724 | 0.807 | 0.866 | 0.909 | 0.938 | 0.958 | 0.972 | 0.981 | 0.987 | 0.992 | 0.994 |
| 0.616999999999987 | 0.617 | 0.725 | 0.807 | 0.867 | 0.909 | 0.938 | 0.958 | 0.972 | 0.981 | 0.988 | 0.992 | 0.994 |
| 0.617499999999987 | 0.617 | 0.725 | 0.807 | 0.867 | 0.909 | 0.938 | 0.959 | 0.972 | 0.981 | 0.988 | 0.992 | 0.994 |
| 0.617999999999987 | 0.618 | 0.726 | 0.807 | 0.867 | 0.909 | 0.939 | 0.959 | 0.972 | 0.981 | 0.988 | 0.992 | 0.994 |
| 0.618499999999987 | 0.618 | 0.726 | 0.808 | 0.867 | 0.909 | 0.939 | 0.959 | 0.972 | 0.981 | 0.988 | 0.992 | 0.994 |
| 0.618999999999987 | 0.619 | 0.726 | 0.808 | 0.868 | 0.91 | 0.939 | 0.959 | 0.972 | 0.981 | 0.988 | 0.992 | 0.994 |
| 0.619499999999987 | 0.619 | 0.727 | 0.808 | 0.868 | 0.91 | 0.939 | 0.959 | 0.972 | 0.981 | 0.988 | 0.992 | 0.994 |
| 0.619999999999987 | 0.62 | 0.727 | 0.809 | 0.868 | 0.91 | 0.939 | 0.959 | 0.972 | 0.982 | 0.988 | 0.992 | 0.994 |
| 0.620499999999987 | 0.62 | 0.727 | 0.809 | 0.868 | 0.91 | 0.939 | 0.959 | 0.972 | 0.982 | 0.988 | 0.992 | 0.994 |
| 0.620999999999987 | 0.621 | 0.728 | 0.809 | 0.868 | 0.91 | 0.939 | 0.959 | 0.973 | 0.982 | 0.988 | 0.992 | 0.995 |
| 0.621499999999987 | 0.621 | 0.728 | 0.809 | 0.869 | 0.91 | 0.939 | 0.959 | 0.973 | 0.982 | 0.988 | 0.992 | 0.995 |
| 0.621999999999987 | 0.622 | 0.729 | 0.81 | 0.869 | 0.91 | 0.939 | 0.959 | 0.973 | 0.982 | 0.988 | 0.992 | 0.995 |
| 0.622499999999987 | 0.622 | 0.729 | 0.81 | 0.869 | 0.911 | 0.939 | 0.959 | 0.973 | 0.982 | 0.988 | 0.992 | 0.995 |
| 0.622999999999987 | 0.623 | 0.729 | 0.81 | 0.869 | 0.911 | 0.94 | 0.959 | 0.973 | 0.982 | 0.988 | 0.992 | 0.995 |
| 0.623499999999987 | 0.623 | 0.73 | 0.811 | 0.869 | 0.911 | 0.94 | 0.959 | 0.973 | 0.982 | 0.988 | 0.992 | 0.995 |
| 0.623999999999987 | 0.624 | 0.73 | 0.811 | 0.87 | 0.911 | 0.94 | 0.959 | 0.973 | 0.982 | 0.988 | 0.992 | 0.995 |
| 0.624499999999987 | 0.624 | 0.731 | 0.811 | 0.87 | 0.911 | 0.94 | 0.96 | 0.973 | 0.982 | 0.988 | 0.992 | 0.995 |
| 0.624999999999986 | 0.625 | 0.731 | 0.811 | 0.87 | 0.911 | 0.94 | 0.96 | 0.973 | 0.982 | 0.988 | 0.992 | 0.995 |
| 0.625499999999986 | 0.625 | 0.731 | 0.812 | 0.87 | 0.911 | 0.94 | 0.96 | 0.973 | 0.982 | 0.988 | 0.992 | 0.995 |
| 0.625999999999986 | 0.626 | 0.732 | 0.812 | 0.87 | 0.912 | 0.94 | 0.96 | 0.973 | 0.982 | 0.988 | 0.992 | 0.995 |
| 0.626499999999986 | 0.626 | 0.732 | 0.812 | 0.871 | 0.912 | 0.94 | 0.96 | 0.973 | 0.982 | 0.988 | 0.992 | 0.995 |
| 0.626999999999986 | 0.627 | 0.733 | 0.813 | 0.871 | 0.912 | 0.94 | 0.96 | 0.973 | 0.982 | 0.988 | 0.992 | 0.995 |
| 0.627499999999986 | 0.627 | 0.733 | 0.813 | 0.871 | 0.912 | 0.94 | 0.96 | 0.973 | 0.982 | 0.988 | 0.992 | 0.995 |
| 0.627999999999986 | 0.628 | 0.733 | 0.813 | 0.871 | 0.912 | 0.941 | 0.96 | 0.973 | 0.982 | 0.988 | 0.992 | 0.995 |
| 0.628499999999986 | 0.628 | 0.734 | 0.814 | 0.871 | 0.912 | 0.941 | 0.96 | 0.973 | 0.982 | 0.988 | 0.992 | 0.995 |
| 0.628999999999986 | 0.629 | 0.734 | 0.814 | 0.872 | 0.912 | 0.941 | 0.96 | 0.973 | 0.982 | 0.988 | 0.992 | 0.995 |
| 0.629499999999986 | 0.629 | 0.735 | 0.814 | 0.872 | 0.913 | 0.941 | 0.96 | 0.973 | 0.982 | 0.988 | 0.992 | 0.995 |
| 0.629999999999986 | 0.63 | 0.735 | 0.814 | 0.872 | 0.913 | 0.941 | 0.96 | 0.973 | 0.982 | 0.988 | 0.992 | 0.995 |
| 0.630499999999986 | 0.63 | 0.735 | 0.815 | 0.872 | 0.913 | 0.941 | 0.96 | 0.973 | 0.982 | 0.988 | 0.992 | 0.995 |
| 0.630999999999986 | 0.631 | 0.736 | 0.815 | 0.872 | 0.913 | 0.941 | 0.96 | 0.973 | 0.982 | 0.988 | 0.992 | 0.995 |
| 0.631499999999986 | 0.631 | 0.736 | 0.815 | 0.873 | 0.913 | 0.941 | 0.96 | 0.973 | 0.982 | 0.988 | 0.992 | 0.995 |
| 0.631999999999986 | 0.632 | 0.736 | 0.816 | 0.873 | 0.913 | 0.941 | 0.961 | 0.974 | 0.982 | 0.988 | 0.992 | 0.995 |
| 0.632499999999986 | 0.632 | 0.737 | 0.816 | 0.873 | 0.913 | 0.941 | 0.961 | 0.974 | 0.982 | 0.988 | 0.992 | 0.995 |
| 0.632999999999986 | 0.633 | 0.737 | 0.816 | 0.873 | 0.914 | 0.942 | 0.961 | 0.974 | 0.982 | 0.988 | 0.992 | 0.995 |
| 0.633499999999986 | 0.633 | 0.738 | 0.816 | 0.873 | 0.914 | 0.942 | 0.961 | 0.974 | 0.982 | 0.988 | 0.992 | 0.995 |
| 0.633999999999985 | 0.634 | 0.738 | 0.817 | 0.874 | 0.914 | 0.942 | 0.961 | 0.974 | 0.982 | 0.988 | 0.992 | 0.995 |
| 0.634499999999985 | 0.634 | 0.738 | 0.817 | 0.874 | 0.914 | 0.942 | 0.961 | 0.974 | 0.982 | 0.988 | 0.992 | 0.995 |
| 0.634999999999985 | 0.635 | 0.739 | 0.817 | 0.874 | 0.914 | 0.942 | 0.961 | 0.974 | 0.982 | 0.988 | 0.992 | 0.995 |
| 0.635499999999985 | 0.635 | 0.739 | 0.818 | 0.874 | 0.914 | 0.942 | 0.961 | 0.974 | 0.982 | 0.988 | 0.992 | 0.995 |
| 0.635999999999985 | 0.636 | 0.74 | 0.818 | 0.875 | 0.914 | 0.942 | 0.961 | 0.974 | 0.982 | 0.988 | 0.992 | 0.995 |
| 0.636499999999985 | 0.636 | 0.74 | 0.818 | 0.875 | 0.915 | 0.942 | 0.961 | 0.974 | 0.983 | 0.988 | 0.992 | 0.995 |
| 0.636999999999985 | 0.637 | 0.74 | 0.818 | 0.875 | 0.915 | 0.942 | 0.961 | 0.974 | 0.983 | 0.988 | 0.992 | 0.995 |
| 0.637499999999985 | 0.637 | 0.741 | 0.819 | 0.875 | 0.915 | 0.942 | 0.961 | 0.974 | 0.983 | 0.988 | 0.992 | 0.995 |
| 0.637999999999985 | 0.638 | 0.741 | 0.819 | 0.875 | 0.915 | 0.943 | 0.961 | 0.974 | 0.983 | 0.988 | 0.992 | 0.995 |
| 0.638499999999985 | 0.638 | 0.741 | 0.819 | 0.876 | 0.915 | 0.943 | 0.961 | 0.974 | 0.983 | 0.988 | 0.992 | 0.995 |
| 0.638999999999985 | 0.639 | 0.742 | 0.82 | 0.876 | 0.915 | 0.943 | 0.961 | 0.974 | 0.983 | 0.988 | 0.992 | 0.995 |
| 0.639499999999985 | 0.639 | 0.742 | 0.82 | 0.876 | 0.915 | 0.943 | 0.962 | 0.974 | 0.983 | 0.988 | 0.992 | 0.995 |
| 0.639999999999985 | 0.64 | 0.743 | 0.82 | 0.876 | 0.916 | 0.943 | 0.962 | 0.974 | 0.983 | 0.988 | 0.992 | 0.995 |
| 0.640499999999985 | 0.64 | 0.743 | 0.82 | 0.876 | 0.916 | 0.943 | 0.962 | 0.974 | 0.983 | 0.988 | 0.992 | 0.995 |
| 0.640999999999985 | 0.641 | 0.743 | 0.821 | 0.877 | 0.916 | 0.943 | 0.962 | 0.974 | 0.983 | 0.988 | 0.992 | 0.995 |
| 0.641499999999985 | 0.641 | 0.744 | 0.821 | 0.877 | 0.916 | 0.943 | 0.962 | 0.974 | 0.983 | 0.989 | 0.992 | 0.995 |
| 0.641999999999985 | 0.642 | 0.744 | 0.821 | 0.877 | 0.916 | 0.943 | 0.962 | 0.974 | 0.983 | 0.989 | 0.992 | 0.995 |
| 0.642499999999985 | 0.642 | 0.745 | 0.822 | 0.877 | 0.916 | 0.943 | 0.962 | 0.974 | 0.983 | 0.989 | 0.992 | 0.995 |
| 0.642999999999984 | 0.643 | 0.745 | 0.822 | 0.877 | 0.916 | 0.944 | 0.962 | 0.974 | 0.983 | 0.989 | 0.992 | 0.995 |
| 0.643499999999984 | 0.643 | 0.745 | 0.822 | 0.878 | 0.917 | 0.944 | 0.962 | 0.975 | 0.983 | 0.989 | 0.992 | 0.995 |
| 0.643999999999984 | 0.644 | 0.746 | 0.822 | 0.878 | 0.917 | 0.944 | 0.962 | 0.975 | 0.983 | 0.989 | 0.992 | 0.995 |
| 0.644499999999984 | 0.644 | 0.746 | 0.823 | 0.878 | 0.917 | 0.944 | 0.962 | 0.975 | 0.983 | 0.989 | 0.992 | 0.995 |
| 0.644999999999984 | 0.645 | 0.747 | 0.823 | 0.878 | 0.917 | 0.944 | 0.962 | 0.975 | 0.983 | 0.989 | 0.992 | 0.995 |
| 0.645499999999984 | 0.645 | 0.747 | 0.823 | 0.878 | 0.917 | 0.944 | 0.962 | 0.975 | 0.983 | 0.989 | 0.992 | 0.995 |
| 0.645999999999984 | 0.646 | 0.747 | 0.823 | 0.879 | 0.917 | 0.944 | 0.962 | 0.975 | 0.983 | 0.989 | 0.992 | 0.995 |
| 0.646499999999984 | 0.646 | 0.748 | 0.824 | 0.879 | 0.917 | 0.944 | 0.962 | 0.975 | 0.983 | 0.989 | 0.992 | 0.995 |
| 0.646999999999984 | 0.647 | 0.748 | 0.824 | 0.879 | 0.918 | 0.944 | 0.962 | 0.975 | 0.983 | 0.989 | 0.992 | 0.995 |
| 0.647499999999984 | 0.647 | 0.748 | 0.824 | 0.879 | 0.918 | 0.944 | 0.963 | 0.975 | 0.983 | 0.989 | 0.992 | 0.995 |
| 0.647999999999984 | 0.648 | 0.749 | 0.825 | 0.879 | 0.918 | 0.944 | 0.963 | 0.975 | 0.983 | 0.989 | 0.993 | 0.995 |
| 0.648499999999984 | 0.648 | 0.749 | 0.825 | 0.88 | 0.918 | 0.945 | 0.963 | 0.975 | 0.983 | 0.989 | 0.993 | 0.995 |
| 0.648999999999984 | 0.649 | 0.75 | 0.825 | 0.88 | 0.918 | 0.945 | 0.963 | 0.975 | 0.983 | 0.989 | 0.993 | 0.995 |
| 0.649499999999984 | 0.649 | 0.75 | 0.825 | 0.88 | 0.918 | 0.945 | 0.963 | 0.975 | 0.983 | 0.989 | 0.993 | 0.995 |
| 0.649999999999984 | 0.65 | 0.75 | 0.826 | 0.88 | 0.918 | 0.945 | 0.963 | 0.975 | 0.983 | 0.989 | 0.993 | 0.995 |
| 0.650499999999984 | 0.65 | 0.751 | 0.826 | 0.88 | 0.919 | 0.945 | 0.963 | 0.975 | 0.983 | 0.989 | 0.993 | 0.995 |
| 0.650999999999984 | 0.651 | 0.751 | 0.826 | 0.881 | 0.919 | 0.945 | 0.963 | 0.975 | 0.983 | 0.989 | 0.993 | 0.995 |
| 0.651499999999984 | 0.651 | 0.752 | 0.827 | 0.881 | 0.919 | 0.945 | 0.963 | 0.975 | 0.983 | 0.989 | 0.993 | 0.995 |
| 0.651999999999983 | 0.652 | 0.752 | 0.827 | 0.881 | 0.919 | 0.945 | 0.963 | 0.975 | 0.983 | 0.989 | 0.993 | 0.995 |
| 0.652499999999983 | 0.652 | 0.752 | 0.827 | 0.881 | 0.919 | 0.945 | 0.963 | 0.975 | 0.983 | 0.989 | 0.993 | 0.995 |
| 0.652999999999983 | 0.653 | 0.753 | 0.827 | 0.881 | 0.919 | 0.945 | 0.963 | 0.975 | 0.984 | 0.989 | 0.993 | 0.995 |
| 0.653499999999983 | 0.653 | 0.753 | 0.828 | 0.882 | 0.919 | 0.946 | 0.963 | 0.975 | 0.984 | 0.989 | 0.993 | 0.995 |
| 0.653999999999983 | 0.654 | 0.753 | 0.828 | 0.882 | 0.92 | 0.946 | 0.963 | 0.975 | 0.984 | 0.989 | 0.993 | 0.995 |
| 0.654499999999983 | 0.654 | 0.754 | 0.828 | 0.882 | 0.92 | 0.946 | 0.963 | 0.975 | 0.984 | 0.989 | 0.993 | 0.995 |
| 0.654999999999983 | 0.655 | 0.754 | 0.829 | 0.882 | 0.92 | 0.946 | 0.964 | 0.976 | 0.984 | 0.989 | 0.993 | 0.995 |
| 0.655499999999983 | 0.655 | 0.755 | 0.829 | 0.882 | 0.92 | 0.946 | 0.964 | 0.976 | 0.984 | 0.989 | 0.993 | 0.995 |
| 0.655999999999983 | 0.656 | 0.755 | 0.829 | 0.883 | 0.92 | 0.946 | 0.964 | 0.976 | 0.984 | 0.989 | 0.993 | 0.995 |
| 0.656499999999983 | 0.656 | 0.755 | 0.829 | 0.883 | 0.92 | 0.946 | 0.964 | 0.976 | 0.984 | 0.989 | 0.993 | 0.995 |
| 0.656999999999983 | 0.657 | 0.756 | 0.83 | 0.883 | 0.92 | 0.946 | 0.964 | 0.976 | 0.984 | 0.989 | 0.993 | 0.995 |
| 0.657499999999983 | 0.657 | 0.756 | 0.83 | 0.883 | 0.921 | 0.946 | 0.964 | 0.976 | 0.984 | 0.989 | 0.993 | 0.995 |
| 0.657999999999983 | 0.658 | 0.757 | 0.83 | 0.883 | 0.921 | 0.946 | 0.964 | 0.976 | 0.984 | 0.989 | 0.993 | 0.995 |
| 0.658499999999983 | 0.658 | 0.757 | 0.831 | 0.884 | 0.921 | 0.946 | 0.964 | 0.976 | 0.984 | 0.989 | 0.993 | 0.995 |
| 0.658999999999983 | 0.659 | 0.757 | 0.831 | 0.884 | 0.921 | 0.947 | 0.964 | 0.976 | 0.984 | 0.989 | 0.993 | 0.995 |
| 0.659499999999983 | 0.659 | 0.758 | 0.831 | 0.884 | 0.921 | 0.947 | 0.964 | 0.976 | 0.984 | 0.989 | 0.993 | 0.995 |
| 0.659999999999983 | 0.66 | 0.758 | 0.831 | 0.884 | 0.921 | 0.947 | 0.964 | 0.976 | 0.984 | 0.989 | 0.993 | 0.995 |
| 0.660499999999983 | 0.66 | 0.758 | 0.832 | 0.884 | 0.921 | 0.947 | 0.964 | 0.976 | 0.984 | 0.989 | 0.993 | 0.995 |
| 0.660999999999983 | 0.661 | 0.759 | 0.832 | 0.885 | 0.921 | 0.947 | 0.964 | 0.976 | 0.984 | 0.989 | 0.993 | 0.995 |
| 0.661499999999982 | 0.661 | 0.759 | 0.832 | 0.885 | 0.922 | 0.947 | 0.964 | 0.976 | 0.984 | 0.989 | 0.993 | 0.995 |
| 0.661999999999982 | 0.662 | 0.76 | 0.832 | 0.885 | 0.922 | 0.947 | 0.964 | 0.976 | 0.984 | 0.989 | 0.993 | 0.995 |
| 0.662499999999982 | 0.662 | 0.76 | 0.833 | 0.885 | 0.922 | 0.947 | 0.964 | 0.976 | 0.984 | 0.989 | 0.993 | 0.995 |
| 0.662999999999982 | 0.663 | 0.76 | 0.833 | 0.885 | 0.922 | 0.947 | 0.965 | 0.976 | 0.984 | 0.989 | 0.993 | 0.995 |
| 0.663499999999982 | 0.663 | 0.761 | 0.833 | 0.886 | 0.922 | 0.947 | 0.965 | 0.976 | 0.984 | 0.989 | 0.993 | 0.995 |
| 0.663999999999982 | 0.664 | 0.761 | 0.834 | 0.886 | 0.922 | 0.948 | 0.965 | 0.976 | 0.984 | 0.989 | 0.993 | 0.995 |
| 0.664499999999982 | 0.664 | 0.761 | 0.834 | 0.886 | 0.922 | 0.948 | 0.965 | 0.976 | 0.984 | 0.989 | 0.993 | 0.995 |
| 0.664999999999982 | 0.665 | 0.762 | 0.834 | 0.886 | 0.923 | 0.948 | 0.965 | 0.976 | 0.984 | 0.989 | 0.993 | 0.995 |
| 0.665499999999982 | 0.665 | 0.762 | 0.834 | 0.886 | 0.923 | 0.948 | 0.965 | 0.976 | 0.984 | 0.989 | 0.993 | 0.995 |
| 0.665999999999982 | 0.666 | 0.763 | 0.835 | 0.887 | 0.923 | 0.948 | 0.965 | 0.976 | 0.984 | 0.989 | 0.993 | 0.995 |
| 0.666499999999982 | 0.666 | 0.763 | 0.835 | 0.887 | 0.923 | 0.948 | 0.965 | 0.977 | 0.984 | 0.99 | 0.993 | 0.995 |
| 0.666999999999982 | 0.667 | 0.763 | 0.835 | 0.887 | 0.923 | 0.948 | 0.965 | 0.977 | 0.984 | 0.99 | 0.993 | 0.995 |
| 0.667499999999982 | 0.667 | 0.764 | 0.836 | 0.887 | 0.923 | 0.948 | 0.965 | 0.977 | 0.984 | 0.99 | 0.993 | 0.995 |
| 0.667999999999982 | 0.668 | 0.764 | 0.836 | 0.887 | 0.923 | 0.948 | 0.965 | 0.977 | 0.984 | 0.99 | 0.993 | 0.995 |
| 0.668499999999982 | 0.668 | 0.765 | 0.836 | 0.888 | 0.924 | 0.948 | 0.965 | 0.977 | 0.984 | 0.99 | 0.993 | 0.995 |
| 0.668999999999982 | 0.669 | 0.765 | 0.836 | 0.888 | 0.924 | 0.948 | 0.965 | 0.977 | 0.984 | 0.99 | 0.993 | 0.995 |
| 0.669499999999982 | 0.669 | 0.765 | 0.837 | 0.888 | 0.924 | 0.949 | 0.965 | 0.977 | 0.984 | 0.99 | 0.993 | 0.995 |
| 0.669999999999982 | 0.67 | 0.766 | 0.837 | 0.888 | 0.924 | 0.949 | 0.965 | 0.977 | 0.984 | 0.99 | 0.993 | 0.995 |
| 0.670499999999981 | 0.67 | 0.766 | 0.837 | 0.888 | 0.924 | 0.949 | 0.966 | 0.977 | 0.985 | 0.99 | 0.993 | 0.995 |
| 0.670999999999981 | 0.671 | 0.766 | 0.838 | 0.889 | 0.924 | 0.949 | 0.966 | 0.977 | 0.985 | 0.99 | 0.993 | 0.995 |
| 0.671499999999981 | 0.671 | 0.767 | 0.838 | 0.889 | 0.924 | 0.949 | 0.966 | 0.977 | 0.985 | 0.99 | 0.993 | 0.995 |
| 0.671999999999981 | 0.672 | 0.767 | 0.838 | 0.889 | 0.924 | 0.949 | 0.966 | 0.977 | 0.985 | 0.99 | 0.993 | 0.995 |
| 0.672499999999981 | 0.672 | 0.768 | 0.838 | 0.889 | 0.925 | 0.949 | 0.966 | 0.977 | 0.985 | 0.99 | 0.993 | 0.995 |
| 0.672999999999981 | 0.673 | 0.768 | 0.839 | 0.889 | 0.925 | 0.949 | 0.966 | 0.977 | 0.985 | 0.99 | 0.993 | 0.995 |
| 0.673499999999981 | 0.673 | 0.768 | 0.839 | 0.889 | 0.925 | 0.949 | 0.966 | 0.977 | 0.985 | 0.99 | 0.993 | 0.995 |
| 0.673999999999981 | 0.674 | 0.769 | 0.839 | 0.89 | 0.925 | 0.949 | 0.966 | 0.977 | 0.985 | 0.99 | 0.993 | 0.995 |
| 0.674499999999981 | 0.674 | 0.769 | 0.839 | 0.89 | 0.925 | 0.949 | 0.966 | 0.977 | 0.985 | 0.99 | 0.993 | 0.995 |
| 0.674999999999981 | 0.675 | 0.769 | 0.84 | 0.89 | 0.925 | 0.95 | 0.966 | 0.977 | 0.985 | 0.99 | 0.993 | 0.995 |
| 0.675499999999981 | 0.675 | 0.77 | 0.84 | 0.89 | 0.925 | 0.95 | 0.966 | 0.977 | 0.985 | 0.99 | 0.993 | 0.995 |
| 0.675999999999981 | 0.676 | 0.77 | 0.84 | 0.89 | 0.926 | 0.95 | 0.966 | 0.977 | 0.985 | 0.99 | 0.993 | 0.995 |
| 0.676499999999981 | 0.676 | 0.771 | 0.841 | 0.891 | 0.926 | 0.95 | 0.966 | 0.977 | 0.985 | 0.99 | 0.993 | 0.995 |
| 0.676999999999981 | 0.677 | 0.771 | 0.841 | 0.891 | 0.926 | 0.95 | 0.966 | 0.977 | 0.985 | 0.99 | 0.993 | 0.996 |
| 0.677499999999981 | 0.677 | 0.771 | 0.841 | 0.891 | 0.926 | 0.95 | 0.966 | 0.977 | 0.985 | 0.99 | 0.993 | 0.996 |
| 0.677999999999981 | 0.678 | 0.772 | 0.841 | 0.891 | 0.926 | 0.95 | 0.966 | 0.978 | 0.985 | 0.99 | 0.993 | 0.996 |
| 0.678499999999981 | 0.678 | 0.772 | 0.842 | 0.891 | 0.926 | 0.95 | 0.967 | 0.978 | 0.985 | 0.99 | 0.993 | 0.996 |
| 0.678999999999981 | 0.679 | 0.773 | 0.842 | 0.892 | 0.926 | 0.95 | 0.967 | 0.978 | 0.985 | 0.99 | 0.993 | 0.996 |
| 0.67949999999998 | 0.679 | 0.773 | 0.842 | 0.892 | 0.927 | 0.95 | 0.967 | 0.978 | 0.985 | 0.99 | 0.993 | 0.996 |
| 0.67999999999998 | 0.68 | 0.773 | 0.842 | 0.892 | 0.927 | 0.95 | 0.967 | 0.978 | 0.985 | 0.99 | 0.993 | 0.996 |
| 0.68049999999998 | 0.68 | 0.774 | 0.843 | 0.892 | 0.927 | 0.951 | 0.967 | 0.978 | 0.985 | 0.99 | 0.993 | 0.996 |
| 0.68099999999998 | 0.681 | 0.774 | 0.843 | 0.892 | 0.927 | 0.951 | 0.967 | 0.978 | 0.985 | 0.99 | 0.993 | 0.996 |
| 0.68149999999998 | 0.681 | 0.774 | 0.843 | 0.893 | 0.927 | 0.951 | 0.967 | 0.978 | 0.985 | 0.99 | 0.993 | 0.996 |
| 0.68199999999998 | 0.682 | 0.775 | 0.844 | 0.893 | 0.927 | 0.951 | 0.967 | 0.978 | 0.985 | 0.99 | 0.993 | 0.996 |
| 0.68249999999998 | 0.682 | 0.775 | 0.844 | 0.893 | 0.927 | 0.951 | 0.967 | 0.978 | 0.985 | 0.99 | 0.993 | 0.996 |
| 0.68299999999998 | 0.683 | 0.776 | 0.844 | 0.893 | 0.927 | 0.951 | 0.967 | 0.978 | 0.985 | 0.99 | 0.993 | 0.996 |
| 0.68349999999998 | 0.683 | 0.776 | 0.844 | 0.893 | 0.928 | 0.951 | 0.967 | 0.978 | 0.985 | 0.99 | 0.993 | 0.996 |
| 0.68399999999998 | 0.684 | 0.776 | 0.845 | 0.894 | 0.928 | 0.951 | 0.967 | 0.978 | 0.985 | 0.99 | 0.993 | 0.996 |
| 0.68449999999998 | 0.684 | 0.777 | 0.845 | 0.894 | 0.928 | 0.951 | 0.967 | 0.978 | 0.985 | 0.99 | 0.993 | 0.996 |
| 0.68499999999998 | 0.685 | 0.777 | 0.845 | 0.894 | 0.928 | 0.951 | 0.967 | 0.978 | 0.985 | 0.99 | 0.993 | 0.996 |
| 0.68549999999998 | 0.685 | 0.777 | 0.846 | 0.894 | 0.928 | 0.951 | 0.967 | 0.978 | 0.985 | 0.99 | 0.993 | 0.996 |
| 0.68599999999998 | 0.686 | 0.778 | 0.846 | 0.894 | 0.928 | 0.952 | 0.967 | 0.978 | 0.985 | 0.99 | 0.993 | 0.996 |
| 0.68649999999998 | 0.686 | 0.778 | 0.846 | 0.895 | 0.928 | 0.952 | 0.968 | 0.978 | 0.985 | 0.99 | 0.993 | 0.996 |
| 0.68699999999998 | 0.687 | 0.779 | 0.846 | 0.895 | 0.929 | 0.952 | 0.968 | 0.978 | 0.985 | 0.99 | 0.994 | 0.996 |
| 0.68749999999998 | 0.687 | 0.779 | 0.847 | 0.895 | 0.929 | 0.952 | 0.968 | 0.978 | 0.985 | 0.99 | 0.994 | 0.996 |
| 0.68799999999998 | 0.688 | 0.779 | 0.847 | 0.895 | 0.929 | 0.952 | 0.968 | 0.978 | 0.986 | 0.99 | 0.994 | 0.996 |
| 0.688499999999979 | 0.688 | 0.78 | 0.847 | 0.895 | 0.929 | 0.952 | 0.968 | 0.978 | 0.986 | 0.99 | 0.994 | 0.996 |
| 0.688999999999979 | 0.689 | 0.78 | 0.847 | 0.895 | 0.929 | 0.952 | 0.968 | 0.978 | 0.986 | 0.99 | 0.994 | 0.996 |
| 0.689499999999979 | 0.689 | 0.78 | 0.848 | 0.896 | 0.929 | 0.952 | 0.968 | 0.978 | 0.986 | 0.99 | 0.994 | 0.996 |
| 0.689999999999979 | 0.69 | 0.781 | 0.848 | 0.896 | 0.929 | 0.952 | 0.968 | 0.979 | 0.986 | 0.99 | 0.994 | 0.996 |
| 0.690499999999979 | 0.69 | 0.781 | 0.848 | 0.896 | 0.929 | 0.952 | 0.968 | 0.979 | 0.986 | 0.99 | 0.994 | 0.996 |
| 0.690999999999979 | 0.691 | 0.782 | 0.849 | 0.896 | 0.93 | 0.952 | 0.968 | 0.979 | 0.986 | 0.99 | 0.994 | 0.996 |
| 0.691499999999979 | 0.691 | 0.782 | 0.849 | 0.896 | 0.93 | 0.953 | 0.968 | 0.979 | 0.986 | 0.99 | 0.994 | 0.996 |
| 0.691999999999979 | 0.692 | 0.782 | 0.849 | 0.897 | 0.93 | 0.953 | 0.968 | 0.979 | 0.986 | 0.99 | 0.994 | 0.996 |
| 0.692499999999979 | 0.692 | 0.783 | 0.849 | 0.897 | 0.93 | 0.953 | 0.968 | 0.979 | 0.986 | 0.99 | 0.994 | 0.996 |
| 0.692999999999979 | 0.693 | 0.783 | 0.85 | 0.897 | 0.93 | 0.953 | 0.968 | 0.979 | 0.986 | 0.991 | 0.994 | 0.996 |
| 0.693499999999979 | 0.693 | 0.783 | 0.85 | 0.897 | 0.93 | 0.953 | 0.968 | 0.979 | 0.986 | 0.991 | 0.994 | 0.996 |
| 0.693999999999979 | 0.694 | 0.784 | 0.85 | 0.897 | 0.93 | 0.953 | 0.968 | 0.979 | 0.986 | 0.991 | 0.994 | 0.996 |
| 0.694499999999979 | 0.694 | 0.784 | 0.85 | 0.898 | 0.931 | 0.953 | 0.969 | 0.979 | 0.986 | 0.991 | 0.994 | 0.996 |
| 0.694999999999979 | 0.695 | 0.785 | 0.851 | 0.898 | 0.931 | 0.953 | 0.969 | 0.979 | 0.986 | 0.991 | 0.994 | 0.996 |
| 0.695499999999979 | 0.695 | 0.785 | 0.851 | 0.898 | 0.931 | 0.953 | 0.969 | 0.979 | 0.986 | 0.991 | 0.994 | 0.996 |
| 0.695999999999979 | 0.696 | 0.785 | 0.851 | 0.898 | 0.931 | 0.953 | 0.969 | 0.979 | 0.986 | 0.991 | 0.994 | 0.996 |
| 0.696499999999979 | 0.696 | 0.786 | 0.852 | 0.898 | 0.931 | 0.953 | 0.969 | 0.979 | 0.986 | 0.991 | 0.994 | 0.996 |
| 0.696999999999979 | 0.697 | 0.786 | 0.852 | 0.899 | 0.931 | 0.954 | 0.969 | 0.979 | 0.986 | 0.991 | 0.994 | 0.996 |
| 0.697499999999978 | 0.697 | 0.786 | 0.852 | 0.899 | 0.931 | 0.954 | 0.969 | 0.979 | 0.986 | 0.991 | 0.994 | 0.996 |
| 0.697999999999978 | 0.698 | 0.787 | 0.852 | 0.899 | 0.931 | 0.954 | 0.969 | 0.979 | 0.986 | 0.991 | 0.994 | 0.996 |
| 0.698499999999978 | 0.698 | 0.787 | 0.853 | 0.899 | 0.932 | 0.954 | 0.969 | 0.979 | 0.986 | 0.991 | 0.994 | 0.996 |
| 0.698999999999978 | 0.699 | 0.788 | 0.853 | 0.899 | 0.932 | 0.954 | 0.969 | 0.979 | 0.986 | 0.991 | 0.994 | 0.996 |
| 0.699499999999978 | 0.699 | 0.788 | 0.853 | 0.9 | 0.932 | 0.954 | 0.969 | 0.979 | 0.986 | 0.991 | 0.994 | 0.996 |
| 0.699999999999978 | 0.7 | 0.788 | 0.853 | 0.9 | 0.932 | 0.954 | 0.969 | 0.979 | 0.986 | 0.991 | 0.994 | 0.996 |
| 0.700499999999978 | 0.7 | 0.789 | 0.854 | 0.9 | 0.932 | 0.954 | 0.969 | 0.979 | 0.986 | 0.991 | 0.994 | 0.996 |
| 0.700999999999978 | 0.701 | 0.789 | 0.854 | 0.9 | 0.932 | 0.954 | 0.969 | 0.979 | 0.986 | 0.991 | 0.994 | 0.996 |
| 0.701499999999978 | 0.701 | 0.789 | 0.854 | 0.9 | 0.932 | 0.954 | 0.969 | 0.979 | 0.986 | 0.991 | 0.994 | 0.996 |
| 0.701999999999978 | 0.702 | 0.79 | 0.854 | 0.9 | 0.932 | 0.954 | 0.969 | 0.98 | 0.986 | 0.991 | 0.994 | 0.996 |
| 0.702499999999978 | 0.702 | 0.79 | 0.855 | 0.901 | 0.933 | 0.955 | 0.969 | 0.98 | 0.986 | 0.991 | 0.994 | 0.996 |
| 0.702999999999978 | 0.703 | 0.791 | 0.855 | 0.901 | 0.933 | 0.955 | 0.97 | 0.98 | 0.986 | 0.991 | 0.994 | 0.996 |
| 0.703499999999978 | 0.703 | 0.791 | 0.855 | 0.901 | 0.933 | 0.955 | 0.97 | 0.98 | 0.986 | 0.991 | 0.994 | 0.996 |
| 0.703999999999978 | 0.704 | 0.791 | 0.856 | 0.901 | 0.933 | 0.955 | 0.97 | 0.98 | 0.986 | 0.991 | 0.994 | 0.996 |
| 0.704499999999978 | 0.704 | 0.792 | 0.856 | 0.901 | 0.933 | 0.955 | 0.97 | 0.98 | 0.986 | 0.991 | 0.994 | 0.996 |
| 0.704999999999978 | 0.705 | 0.792 | 0.856 | 0.902 | 0.933 | 0.955 | 0.97 | 0.98 | 0.986 | 0.991 | 0.994 | 0.996 |
| 0.705499999999978 | 0.705 | 0.792 | 0.856 | 0.902 | 0.933 | 0.955 | 0.97 | 0.98 | 0.986 | 0.991 | 0.994 | 0.996 |
| 0.705999999999978 | 0.706 | 0.793 | 0.857 | 0.902 | 0.934 | 0.955 | 0.97 | 0.98 | 0.987 | 0.991 | 0.994 | 0.996 |
| 0.706499999999978 | 0.706 | 0.793 | 0.857 | 0.902 | 0.934 | 0.955 | 0.97 | 0.98 | 0.987 | 0.991 | 0.994 | 0.996 |
| 0.706999999999977 | 0.707 | 0.794 | 0.857 | 0.902 | 0.934 | 0.955 | 0.97 | 0.98 | 0.987 | 0.991 | 0.994 | 0.996 |
| 0.707499999999977 | 0.707 | 0.794 | 0.857 | 0.903 | 0.934 | 0.955 | 0.97 | 0.98 | 0.987 | 0.991 | 0.994 | 0.996 |
| 0.707999999999977 | 0.708 | 0.794 | 0.858 | 0.903 | 0.934 | 0.956 | 0.97 | 0.98 | 0.987 | 0.991 | 0.994 | 0.996 |
| 0.708499999999977 | 0.708 | 0.795 | 0.858 | 0.903 | 0.934 | 0.956 | 0.97 | 0.98 | 0.987 | 0.991 | 0.994 | 0.996 |
| 0.708999999999977 | 0.709 | 0.795 | 0.858 | 0.903 | 0.934 | 0.956 | 0.97 | 0.98 | 0.987 | 0.991 | 0.994 | 0.996 |
| 0.709499999999977 | 0.709 | 0.795 | 0.859 | 0.903 | 0.934 | 0.956 | 0.97 | 0.98 | 0.987 | 0.991 | 0.994 | 0.996 |
| 0.709999999999977 | 0.71 | 0.796 | 0.859 | 0.904 | 0.935 | 0.956 | 0.97 | 0.98 | 0.987 | 0.991 | 0.994 | 0.996 |
| 0.710499999999977 | 0.71 | 0.796 | 0.859 | 0.904 | 0.935 | 0.956 | 0.97 | 0.98 | 0.987 | 0.991 | 0.994 | 0.996 |
| 0.710999999999977 | 0.711 | 0.797 | 0.859 | 0.904 | 0.935 | 0.956 | 0.97 | 0.98 | 0.987 | 0.991 | 0.994 | 0.996 |
| 0.711499999999977 | 0.711 | 0.797 | 0.86 | 0.904 | 0.935 | 0.956 | 0.971 | 0.98 | 0.987 | 0.991 | 0.994 | 0.996 |
| 0.711999999999977 | 0.712 | 0.797 | 0.86 | 0.904 | 0.935 | 0.956 | 0.971 | 0.98 | 0.987 | 0.991 | 0.994 | 0.996 |
| 0.712499999999977 | 0.712 | 0.798 | 0.86 | 0.904 | 0.935 | 0.956 | 0.971 | 0.98 | 0.987 | 0.991 | 0.994 | 0.996 |
| 0.712999999999977 | 0.713 | 0.798 | 0.86 | 0.905 | 0.935 | 0.956 | 0.971 | 0.98 | 0.987 | 0.991 | 0.994 | 0.996 |
| 0.713499999999977 | 0.713 | 0.798 | 0.861 | 0.905 | 0.935 | 0.957 | 0.971 | 0.98 | 0.987 | 0.991 | 0.994 | 0.996 |
| 0.713999999999977 | 0.714 | 0.799 | 0.861 | 0.905 | 0.936 | 0.957 | 0.971 | 0.98 | 0.987 | 0.991 | 0.994 | 0.996 |
| 0.714499999999977 | 0.714 | 0.799 | 0.861 | 0.905 | 0.936 | 0.957 | 0.971 | 0.981 | 0.987 | 0.991 | 0.994 | 0.996 |
| 0.714999999999977 | 0.715 | 0.8 | 0.861 | 0.905 | 0.936 | 0.957 | 0.971 | 0.981 | 0.987 | 0.991 | 0.994 | 0.996 |
| 0.715499999999977 | 0.715 | 0.8 | 0.862 | 0.906 | 0.936 | 0.957 | 0.971 | 0.981 | 0.987 | 0.991 | 0.994 | 0.996 |
| 0.715999999999976 | 0.716 | 0.8 | 0.862 | 0.906 | 0.936 | 0.957 | 0.971 | 0.981 | 0.987 | 0.991 | 0.994 | 0.996 |
| 0.716499999999976 | 0.716 | 0.801 | 0.862 | 0.906 | 0.936 | 0.957 | 0.971 | 0.981 | 0.987 | 0.991 | 0.994 | 0.996 |
| 0.716999999999976 | 0.717 | 0.801 | 0.863 | 0.906 | 0.936 | 0.957 | 0.971 | 0.981 | 0.987 | 0.991 | 0.994 | 0.996 |
| 0.717499999999976 | 0.717 | 0.801 | 0.863 | 0.906 | 0.937 | 0.957 | 0.971 | 0.981 | 0.987 | 0.991 | 0.994 | 0.996 |
| 0.717999999999976 | 0.718 | 0.802 | 0.863 | 0.907 | 0.937 | 0.957 | 0.971 | 0.981 | 0.987 | 0.991 | 0.994 | 0.996 |
| 0.718499999999976 | 0.718 | 0.802 | 0.863 | 0.907 | 0.937 | 0.957 | 0.971 | 0.981 | 0.987 | 0.991 | 0.994 | 0.996 |
| 0.718999999999976 | 0.719 | 0.803 | 0.864 | 0.907 | 0.937 | 0.957 | 0.971 | 0.981 | 0.987 | 0.991 | 0.994 | 0.996 |
| 0.719499999999976 | 0.719 | 0.803 | 0.864 | 0.907 | 0.937 | 0.958 | 0.972 | 0.981 | 0.987 | 0.991 | 0.994 | 0.996 |
| 0.719999999999976 | 0.72 | 0.803 | 0.864 | 0.907 | 0.937 | 0.958 | 0.972 | 0.981 | 0.987 | 0.991 | 0.994 | 0.996 |
| 0.720499999999976 | 0.72 | 0.804 | 0.864 | 0.907 | 0.937 | 0.958 | 0.972 | 0.981 | 0.987 | 0.992 | 0.994 | 0.996 |
| 0.720999999999976 | 0.721 | 0.804 | 0.865 | 0.908 | 0.937 | 0.958 | 0.972 | 0.981 | 0.987 | 0.992 | 0.994 | 0.996 |
| 0.721499999999976 | 0.721 | 0.804 | 0.865 | 0.908 | 0.938 | 0.958 | 0.972 | 0.981 | 0.987 | 0.992 | 0.994 | 0.996 |
| 0.721999999999976 | 0.722 | 0.805 | 0.865 | 0.908 | 0.938 | 0.958 | 0.972 | 0.981 | 0.987 | 0.992 | 0.994 | 0.996 |
| 0.722499999999976 | 0.722 | 0.805 | 0.865 | 0.908 | 0.938 | 0.958 | 0.972 | 0.981 | 0.987 | 0.992 | 0.994 | 0.996 |
| 0.722999999999976 | 0.723 | 0.806 | 0.866 | 0.908 | 0.938 | 0.958 | 0.972 | 0.981 | 0.987 | 0.992 | 0.994 | 0.996 |
| 0.723499999999976 | 0.723 | 0.806 | 0.866 | 0.909 | 0.938 | 0.958 | 0.972 | 0.981 | 0.987 | 0.992 | 0.994 | 0.996 |
| 0.723999999999976 | 0.724 | 0.806 | 0.866 | 0.909 | 0.938 | 0.958 | 0.972 | 0.981 | 0.987 | 0.992 | 0.994 | 0.996 |
| 0.724499999999976 | 0.724 | 0.807 | 0.867 | 0.909 | 0.938 | 0.958 | 0.972 | 0.981 | 0.988 | 0.992 | 0.994 | 0.996 |
| 0.724999999999975 | 0.725 | 0.807 | 0.867 | 0.909 | 0.938 | 0.959 | 0.972 | 0.981 | 0.988 | 0.992 | 0.994 | 0.996 |
| 0.725499999999975 | 0.725 | 0.807 | 0.867 | 0.909 | 0.939 | 0.959 | 0.972 | 0.981 | 0.988 | 0.992 | 0.994 | 0.996 |
| 0.725999999999975 | 0.726 | 0.808 | 0.867 | 0.909 | 0.939 | 0.959 | 0.972 | 0.981 | 0.988 | 0.992 | 0.994 | 0.996 |
| 0.726499999999975 | 0.726 | 0.808 | 0.868 | 0.91 | 0.939 | 0.959 | 0.972 | 0.981 | 0.988 | 0.992 | 0.994 | 0.996 |
| 0.726999999999975 | 0.727 | 0.809 | 0.868 | 0.91 | 0.939 | 0.959 | 0.972 | 0.982 | 0.988 | 0.992 | 0.994 | 0.996 |
| 0.727499999999975 | 0.727 | 0.809 | 0.868 | 0.91 | 0.939 | 0.959 | 0.972 | 0.982 | 0.988 | 0.992 | 0.994 | 0.996 |
| 0.727999999999975 | 0.728 | 0.809 | 0.868 | 0.91 | 0.939 | 0.959 | 0.973 | 0.982 | 0.988 | 0.992 | 0.995 | 0.996 |
| 0.728499999999975 | 0.728 | 0.81 | 0.869 | 0.91 | 0.939 | 0.959 | 0.973 | 0.982 | 0.988 | 0.992 | 0.995 | 0.996 |
| 0.728999999999975 | 0.729 | 0.81 | 0.869 | 0.911 | 0.939 | 0.959 | 0.973 | 0.982 | 0.988 | 0.992 | 0.995 | 0.996 |
| 0.729499999999975 | 0.729 | 0.81 | 0.869 | 0.911 | 0.94 | 0.959 | 0.973 | 0.982 | 0.988 | 0.992 | 0.995 | 0.996 |
| 0.729999999999975 | 0.73 | 0.811 | 0.869 | 0.911 | 0.94 | 0.959 | 0.973 | 0.982 | 0.988 | 0.992 | 0.995 | 0.996 |
| 0.730499999999975 | 0.73 | 0.811 | 0.87 | 0.911 | 0.94 | 0.959 | 0.973 | 0.982 | 0.988 | 0.992 | 0.995 | 0.996 |
| 0.730999999999975 | 0.731 | 0.811 | 0.87 | 0.911 | 0.94 | 0.96 | 0.973 | 0.982 | 0.988 | 0.992 | 0.995 | 0.996 |
| 0.731499999999975 | 0.731 | 0.812 | 0.87 | 0.912 | 0.94 | 0.96 | 0.973 | 0.982 | 0.988 | 0.992 | 0.995 | 0.996 |
| 0.731999999999975 | 0.732 | 0.812 | 0.871 | 0.912 | 0.94 | 0.96 | 0.973 | 0.982 | 0.988 | 0.992 | 0.995 | 0.996 |
| 0.732499999999975 | 0.732 | 0.813 | 0.871 | 0.912 | 0.94 | 0.96 | 0.973 | 0.982 | 0.988 | 0.992 | 0.995 | 0.996 |
| 0.732999999999975 | 0.733 | 0.813 | 0.871 | 0.912 | 0.94 | 0.96 | 0.973 | 0.982 | 0.988 | 0.992 | 0.995 | 0.996 |
| 0.733499999999975 | 0.733 | 0.813 | 0.871 | 0.912 | 0.941 | 0.96 | 0.973 | 0.982 | 0.988 | 0.992 | 0.995 | 0.996 |
| 0.733999999999974 | 0.734 | 0.814 | 0.872 | 0.912 | 0.941 | 0.96 | 0.973 | 0.982 | 0.988 | 0.992 | 0.995 | 0.996 |
| 0.734499999999974 | 0.734 | 0.814 | 0.872 | 0.913 | 0.941 | 0.96 | 0.973 | 0.982 | 0.988 | 0.992 | 0.995 | 0.996 |
| 0.734999999999974 | 0.735 | 0.814 | 0.872 | 0.913 | 0.941 | 0.96 | 0.973 | 0.982 | 0.988 | 0.992 | 0.995 | 0.996 |
| 0.735499999999974 | 0.735 | 0.815 | 0.872 | 0.913 | 0.941 | 0.96 | 0.973 | 0.982 | 0.988 | 0.992 | 0.995 | 0.996 |
| 0.735999999999974 | 0.736 | 0.815 | 0.873 | 0.913 | 0.941 | 0.96 | 0.973 | 0.982 | 0.988 | 0.992 | 0.995 | 0.996 |
| 0.736499999999974 | 0.736 | 0.816 | 0.873 | 0.913 | 0.941 | 0.961 | 0.974 | 0.982 | 0.988 | 0.992 | 0.995 | 0.996 |
| 0.736999999999974 | 0.737 | 0.816 | 0.873 | 0.914 | 0.942 | 0.961 | 0.974 | 0.982 | 0.988 | 0.992 | 0.995 | 0.996 |
| 0.737499999999974 | 0.737 | 0.816 | 0.873 | 0.914 | 0.942 | 0.961 | 0.974 | 0.982 | 0.988 | 0.992 | 0.995 | 0.996 |
| 0.737999999999974 | 0.738 | 0.817 | 0.874 | 0.914 | 0.942 | 0.961 | 0.974 | 0.982 | 0.988 | 0.992 | 0.995 | 0.996 |
| 0.738499999999974 | 0.738 | 0.817 | 0.874 | 0.914 | 0.942 | 0.961 | 0.974 | 0.982 | 0.988 | 0.992 | 0.995 | 0.997 |
| 0.738999999999974 | 0.739 | 0.817 | 0.874 | 0.914 | 0.942 | 0.961 | 0.974 | 0.982 | 0.988 | 0.992 | 0.995 | 0.997 |
| 0.739499999999974 | 0.739 | 0.818 | 0.874 | 0.914 | 0.942 | 0.961 | 0.974 | 0.982 | 0.988 | 0.992 | 0.995 | 0.997 |
| 0.739999999999974 | 0.74 | 0.818 | 0.875 | 0.915 | 0.942 | 0.961 | 0.974 | 0.983 | 0.988 | 0.992 | 0.995 | 0.997 |
| 0.740499999999974 | 0.74 | 0.818 | 0.875 | 0.915 | 0.942 | 0.961 | 0.974 | 0.983 | 0.988 | 0.992 | 0.995 | 0.997 |
| 0.740999999999974 | 0.741 | 0.819 | 0.875 | 0.915 | 0.943 | 0.961 | 0.974 | 0.983 | 0.988 | 0.992 | 0.995 | 0.997 |
| 0.741499999999974 | 0.741 | 0.819 | 0.876 | 0.915 | 0.943 | 0.961 | 0.974 | 0.983 | 0.988 | 0.992 | 0.995 | 0.997 |
| 0.741999999999974 | 0.742 | 0.82 | 0.876 | 0.915 | 0.943 | 0.961 | 0.974 | 0.983 | 0.988 | 0.992 | 0.995 | 0.997 |
| 0.742499999999974 | 0.742 | 0.82 | 0.876 | 0.916 | 0.943 | 0.962 | 0.974 | 0.983 | 0.988 | 0.992 | 0.995 | 0.997 |
| 0.742999999999973 | 0.743 | 0.82 | 0.876 | 0.916 | 0.943 | 0.962 | 0.974 | 0.983 | 0.988 | 0.992 | 0.995 | 0.997 |
| 0.743499999999973 | 0.743 | 0.821 | 0.877 | 0.916 | 0.943 | 0.962 | 0.974 | 0.983 | 0.989 | 0.992 | 0.995 | 0.997 |
| 0.743999999999973 | 0.744 | 0.821 | 0.877 | 0.916 | 0.943 | 0.962 | 0.974 | 0.983 | 0.989 | 0.992 | 0.995 | 0.997 |
| 0.744499999999973 | 0.744 | 0.821 | 0.877 | 0.916 | 0.943 | 0.962 | 0.974 | 0.983 | 0.989 | 0.992 | 0.995 | 0.997 |
| 0.744999999999973 | 0.745 | 0.822 | 0.877 | 0.916 | 0.944 | 0.962 | 0.974 | 0.983 | 0.989 | 0.992 | 0.995 | 0.997 |
| 0.745499999999973 | 0.745 | 0.822 | 0.878 | 0.917 | 0.944 | 0.962 | 0.975 | 0.983 | 0.989 | 0.992 | 0.995 | 0.997 |
| 0.745999999999973 | 0.746 | 0.823 | 0.878 | 0.917 | 0.944 | 0.962 | 0.975 | 0.983 | 0.989 | 0.992 | 0.995 | 0.997 |
| 0.746499999999973 | 0.746 | 0.823 | 0.878 | 0.917 | 0.944 | 0.962 | 0.975 | 0.983 | 0.989 | 0.992 | 0.995 | 0.997 |
| 0.746999999999973 | 0.747 | 0.823 | 0.878 | 0.917 | 0.944 | 0.962 | 0.975 | 0.983 | 0.989 | 0.992 | 0.995 | 0.997 |
| 0.747499999999973 | 0.747 | 0.824 | 0.879 | 0.917 | 0.944 | 0.962 | 0.975 | 0.983 | 0.989 | 0.992 | 0.995 | 0.997 |
| 0.747999999999973 | 0.748 | 0.824 | 0.879 | 0.918 | 0.944 | 0.962 | 0.975 | 0.983 | 0.989 | 0.992 | 0.995 | 0.997 |
| 0.748499999999973 | 0.748 | 0.824 | 0.879 | 0.918 | 0.944 | 0.963 | 0.975 | 0.983 | 0.989 | 0.992 | 0.995 | 0.997 |
| 0.748999999999973 | 0.749 | 0.825 | 0.879 | 0.918 | 0.945 | 0.963 | 0.975 | 0.983 | 0.989 | 0.993 | 0.995 | 0.997 |
| 0.749499999999973 | 0.749 | 0.825 | 0.88 | 0.918 | 0.945 | 0.963 | 0.975 | 0.983 | 0.989 | 0.993 | 0.995 | 0.997 |
| 0.749999999999973 | 0.75 | 0.825 | 0.88 | 0.918 | 0.945 | 0.963 | 0.975 | 0.983 | 0.989 | 0.993 | 0.995 | 0.997 |
| 0.750499999999973 | 0.75 | 0.826 | 0.88 | 0.918 | 0.945 | 0.963 | 0.975 | 0.983 | 0.989 | 0.993 | 0.995 | 0.997 |
| 0.750999999999973 | 0.751 | 0.826 | 0.88 | 0.919 | 0.945 | 0.963 | 0.975 | 0.983 | 0.989 | 0.993 | 0.995 | 0.997 |
| 0.751499999999973 | 0.751 | 0.827 | 0.881 | 0.919 | 0.945 | 0.963 | 0.975 | 0.983 | 0.989 | 0.993 | 0.995 | 0.997 |
| 0.751999999999973 | 0.752 | 0.827 | 0.881 | 0.919 | 0.945 | 0.963 | 0.975 | 0.983 | 0.989 | 0.993 | 0.995 | 0.997 |
| 0.752499999999972 | 0.752 | 0.827 | 0.881 | 0.919 | 0.945 | 0.963 | 0.975 | 0.983 | 0.989 | 0.993 | 0.995 | 0.997 |
| 0.752999999999972 | 0.753 | 0.828 | 0.882 | 0.919 | 0.946 | 0.963 | 0.975 | 0.984 | 0.989 | 0.993 | 0.995 | 0.997 |
| 0.753499999999972 | 0.753 | 0.828 | 0.882 | 0.92 | 0.946 | 0.963 | 0.975 | 0.984 | 0.989 | 0.993 | 0.995 | 0.997 |
| 0.753999999999972 | 0.754 | 0.828 | 0.882 | 0.92 | 0.946 | 0.963 | 0.976 | 0.984 | 0.989 | 0.993 | 0.995 | 0.997 |
| 0.754499999999972 | 0.754 | 0.829 | 0.882 | 0.92 | 0.946 | 0.964 | 0.976 | 0.984 | 0.989 | 0.993 | 0.995 | 0.997 |
| 0.754999999999972 | 0.755 | 0.829 | 0.883 | 0.92 | 0.946 | 0.964 | 0.976 | 0.984 | 0.989 | 0.993 | 0.995 | 0.997 |
| 0.755499999999972 | 0.755 | 0.83 | 0.883 | 0.92 | 0.946 | 0.964 | 0.976 | 0.984 | 0.989 | 0.993 | 0.995 | 0.997 |
| 0.755999999999972 | 0.756 | 0.83 | 0.883 | 0.92 | 0.946 | 0.964 | 0.976 | 0.984 | 0.989 | 0.993 | 0.995 | 0.997 |
| 0.756499999999972 | 0.756 | 0.83 | 0.883 | 0.921 | 0.946 | 0.964 | 0.976 | 0.984 | 0.989 | 0.993 | 0.995 | 0.997 |
| 0.756999999999972 | 0.757 | 0.831 | 0.884 | 0.921 | 0.946 | 0.964 | 0.976 | 0.984 | 0.989 | 0.993 | 0.995 | 0.997 |
| 0.757499999999972 | 0.757 | 0.831 | 0.884 | 0.921 | 0.947 | 0.964 | 0.976 | 0.984 | 0.989 | 0.993 | 0.995 | 0.997 |
| 0.757999999999972 | 0.758 | 0.831 | 0.884 | 0.921 | 0.947 | 0.964 | 0.976 | 0.984 | 0.989 | 0.993 | 0.995 | 0.997 |
| 0.758499999999972 | 0.758 | 0.832 | 0.884 | 0.921 | 0.947 | 0.964 | 0.976 | 0.984 | 0.989 | 0.993 | 0.995 | 0.997 |
| 0.758999999999972 | 0.759 | 0.832 | 0.885 | 0.922 | 0.947 | 0.964 | 0.976 | 0.984 | 0.989 | 0.993 | 0.995 | 0.997 |
| 0.759499999999972 | 0.759 | 0.832 | 0.885 | 0.922 | 0.947 | 0.964 | 0.976 | 0.984 | 0.989 | 0.993 | 0.995 | 0.997 |
| 0.759999999999972 | 0.76 | 0.833 | 0.885 | 0.922 | 0.947 | 0.965 | 0.976 | 0.984 | 0.989 | 0.993 | 0.995 | 0.997 |
| 0.760499999999972 | 0.76 | 0.833 | 0.885 | 0.922 | 0.947 | 0.965 | 0.976 | 0.984 | 0.989 | 0.993 | 0.995 | 0.997 |
| 0.760999999999972 | 0.761 | 0.834 | 0.886 | 0.922 | 0.947 | 0.965 | 0.976 | 0.984 | 0.989 | 0.993 | 0.995 | 0.997 |
| 0.761499999999971 | 0.761 | 0.834 | 0.886 | 0.922 | 0.948 | 0.965 | 0.976 | 0.984 | 0.989 | 0.993 | 0.995 | 0.997 |
| 0.761999999999971 | 0.762 | 0.834 | 0.886 | 0.923 | 0.948 | 0.965 | 0.976 | 0.984 | 0.989 | 0.993 | 0.995 | 0.997 |
| 0.762499999999971 | 0.762 | 0.835 | 0.886 | 0.923 | 0.948 | 0.965 | 0.976 | 0.984 | 0.989 | 0.993 | 0.995 | 0.997 |
| 0.762999999999971 | 0.763 | 0.835 | 0.887 | 0.923 | 0.948 | 0.965 | 0.977 | 0.984 | 0.99 | 0.993 | 0.995 | 0.997 |
| 0.763499999999971 | 0.763 | 0.835 | 0.887 | 0.923 | 0.948 | 0.965 | 0.977 | 0.984 | 0.99 | 0.993 | 0.995 | 0.997 |
| 0.763999999999971 | 0.764 | 0.836 | 0.887 | 0.923 | 0.948 | 0.965 | 0.977 | 0.984 | 0.99 | 0.993 | 0.995 | 0.997 |
| 0.764499999999971 | 0.764 | 0.836 | 0.887 | 0.924 | 0.948 | 0.965 | 0.977 | 0.984 | 0.99 | 0.993 | 0.995 | 0.997 |
| 0.764999999999971 | 0.765 | 0.836 | 0.888 | 0.924 | 0.948 | 0.965 | 0.977 | 0.984 | 0.99 | 0.993 | 0.995 | 0.997 |
| 0.765499999999971 | 0.765 | 0.837 | 0.888 | 0.924 | 0.949 | 0.965 | 0.977 | 0.984 | 0.99 | 0.993 | 0.995 | 0.997 |
| 0.765999999999971 | 0.766 | 0.837 | 0.888 | 0.924 | 0.949 | 0.966 | 0.977 | 0.985 | 0.99 | 0.993 | 0.995 | 0.997 |
| 0.766499999999971 | 0.766 | 0.838 | 0.889 | 0.924 | 0.949 | 0.966 | 0.977 | 0.985 | 0.99 | 0.993 | 0.995 | 0.997 |
| 0.766999999999971 | 0.767 | 0.838 | 0.889 | 0.924 | 0.949 | 0.966 | 0.977 | 0.985 | 0.99 | 0.993 | 0.995 | 0.997 |
| 0.767499999999971 | 0.767 | 0.838 | 0.889 | 0.925 | 0.949 | 0.966 | 0.977 | 0.985 | 0.99 | 0.993 | 0.995 | 0.997 |
| 0.767999999999971 | 0.768 | 0.839 | 0.889 | 0.925 | 0.949 | 0.966 | 0.977 | 0.985 | 0.99 | 0.993 | 0.995 | 0.997 |
| 0.768499999999971 | 0.768 | 0.839 | 0.89 | 0.925 | 0.949 | 0.966 | 0.977 | 0.985 | 0.99 | 0.993 | 0.995 | 0.997 |
| 0.768999999999971 | 0.769 | 0.839 | 0.89 | 0.925 | 0.949 | 0.966 | 0.977 | 0.985 | 0.99 | 0.993 | 0.995 | 0.997 |
| 0.769499999999971 | 0.769 | 0.84 | 0.89 | 0.925 | 0.95 | 0.966 | 0.977 | 0.985 | 0.99 | 0.993 | 0.995 | 0.997 |
| 0.769999999999971 | 0.77 | 0.84 | 0.89 | 0.925 | 0.95 | 0.966 | 0.977 | 0.985 | 0.99 | 0.993 | 0.995 | 0.997 |
| 0.77049999999997 | 0.77 | 0.84 | 0.891 | 0.926 | 0.95 | 0.966 | 0.977 | 0.985 | 0.99 | 0.993 | 0.995 | 0.997 |
| 0.77099999999997 | 0.771 | 0.841 | 0.891 | 0.926 | 0.95 | 0.966 | 0.977 | 0.985 | 0.99 | 0.993 | 0.996 | 0.997 |
| 0.77149999999997 | 0.771 | 0.841 | 0.891 | 0.926 | 0.95 | 0.966 | 0.977 | 0.985 | 0.99 | 0.993 | 0.996 | 0.997 |
| 0.77199999999997 | 0.772 | 0.842 | 0.891 | 0.926 | 0.95 | 0.966 | 0.978 | 0.985 | 0.99 | 0.993 | 0.996 | 0.997 |
| 0.77249999999997 | 0.772 | 0.842 | 0.892 | 0.926 | 0.95 | 0.967 | 0.978 | 0.985 | 0.99 | 0.993 | 0.996 | 0.997 |
| 0.77299999999997 | 0.773 | 0.842 | 0.892 | 0.927 | 0.95 | 0.967 | 0.978 | 0.985 | 0.99 | 0.993 | 0.996 | 0.997 |
| 0.77349999999997 | 0.773 | 0.843 | 0.892 | 0.927 | 0.951 | 0.967 | 0.978 | 0.985 | 0.99 | 0.993 | 0.996 | 0.997 |
| 0.77399999999997 | 0.774 | 0.843 | 0.892 | 0.927 | 0.951 | 0.967 | 0.978 | 0.985 | 0.99 | 0.993 | 0.996 | 0.997 |
| 0.77449999999997 | 0.774 | 0.843 | 0.893 | 0.927 | 0.951 | 0.967 | 0.978 | 0.985 | 0.99 | 0.993 | 0.996 | 0.997 |
| 0.77499999999997 | 0.775 | 0.844 | 0.893 | 0.927 | 0.951 | 0.967 | 0.978 | 0.985 | 0.99 | 0.993 | 0.996 | 0.997 |
| 0.77549999999997 | 0.775 | 0.844 | 0.893 | 0.927 | 0.951 | 0.967 | 0.978 | 0.985 | 0.99 | 0.993 | 0.996 | 0.997 |
| 0.77599999999997 | 0.776 | 0.844 | 0.893 | 0.928 | 0.951 | 0.967 | 0.978 | 0.985 | 0.99 | 0.993 | 0.996 | 0.997 |
| 0.77649999999997 | 0.776 | 0.845 | 0.894 | 0.928 | 0.951 | 0.967 | 0.978 | 0.985 | 0.99 | 0.993 | 0.996 | 0.997 |
| 0.77699999999997 | 0.777 | 0.845 | 0.894 | 0.928 | 0.951 | 0.967 | 0.978 | 0.985 | 0.99 | 0.993 | 0.996 | 0.997 |
| 0.77749999999997 | 0.777 | 0.846 | 0.894 | 0.928 | 0.952 | 0.967 | 0.978 | 0.985 | 0.99 | 0.993 | 0.996 | 0.997 |
| 0.77799999999997 | 0.778 | 0.846 | 0.894 | 0.928 | 0.952 | 0.967 | 0.978 | 0.985 | 0.99 | 0.993 | 0.996 | 0.997 |
| 0.77849999999997 | 0.778 | 0.846 | 0.895 | 0.928 | 0.952 | 0.968 | 0.978 | 0.985 | 0.99 | 0.994 | 0.996 | 0.997 |
| 0.77899999999997 | 0.779 | 0.847 | 0.895 | 0.929 | 0.952 | 0.968 | 0.978 | 0.985 | 0.99 | 0.994 | 0.996 | 0.997 |
| 0.779499999999969 | 0.779 | 0.847 | 0.895 | 0.929 | 0.952 | 0.968 | 0.978 | 0.986 | 0.99 | 0.994 | 0.996 | 0.997 |
| 0.779999999999969 | 0.78 | 0.847 | 0.895 | 0.929 | 0.952 | 0.968 | 0.978 | 0.986 | 0.99 | 0.994 | 0.996 | 0.997 |
| 0.780499999999969 | 0.78 | 0.848 | 0.896 | 0.929 | 0.952 | 0.968 | 0.978 | 0.986 | 0.99 | 0.994 | 0.996 | 0.997 |
| 0.780999999999969 | 0.781 | 0.848 | 0.896 | 0.929 | 0.952 | 0.968 | 0.979 | 0.986 | 0.99 | 0.994 | 0.996 | 0.997 |
| 0.781499999999969 | 0.781 | 0.848 | 0.896 | 0.93 | 0.952 | 0.968 | 0.979 | 0.986 | 0.99 | 0.994 | 0.996 | 0.997 |
| 0.781999999999969 | 0.782 | 0.849 | 0.896 | 0.93 | 0.953 | 0.968 | 0.979 | 0.986 | 0.99 | 0.994 | 0.996 | 0.997 |
| 0.782499999999969 | 0.782 | 0.849 | 0.897 | 0.93 | 0.953 | 0.968 | 0.979 | 0.986 | 0.99 | 0.994 | 0.996 | 0.997 |
| 0.782999999999969 | 0.783 | 0.85 | 0.897 | 0.93 | 0.953 | 0.968 | 0.979 | 0.986 | 0.991 | 0.994 | 0.996 | 0.997 |
| 0.783499999999969 | 0.783 | 0.85 | 0.897 | 0.93 | 0.953 | 0.968 | 0.979 | 0.986 | 0.991 | 0.994 | 0.996 | 0.997 |
| 0.783999999999969 | 0.784 | 0.85 | 0.897 | 0.93 | 0.953 | 0.968 | 0.979 | 0.986 | 0.991 | 0.994 | 0.996 | 0.997 |
| 0.784499999999969 | 0.784 | 0.851 | 0.898 | 0.931 | 0.953 | 0.969 | 0.979 | 0.986 | 0.991 | 0.994 | 0.996 | 0.997 |
| 0.784999999999969 | 0.785 | 0.851 | 0.898 | 0.931 | 0.953 | 0.969 | 0.979 | 0.986 | 0.991 | 0.994 | 0.996 | 0.997 |
| 0.785499999999969 | 0.785 | 0.851 | 0.898 | 0.931 | 0.953 | 0.969 | 0.979 | 0.986 | 0.991 | 0.994 | 0.996 | 0.997 |
| 0.785999999999969 | 0.786 | 0.852 | 0.899 | 0.931 | 0.954 | 0.969 | 0.979 | 0.986 | 0.991 | 0.994 | 0.996 | 0.997 |
| 0.786499999999969 | 0.786 | 0.852 | 0.899 | 0.931 | 0.954 | 0.969 | 0.979 | 0.986 | 0.991 | 0.994 | 0.996 | 0.997 |
| 0.786999999999969 | 0.787 | 0.852 | 0.899 | 0.931 | 0.954 | 0.969 | 0.979 | 0.986 | 0.991 | 0.994 | 0.996 | 0.997 |
| 0.787499999999969 | 0.787 | 0.853 | 0.899 | 0.932 | 0.954 | 0.969 | 0.979 | 0.986 | 0.991 | 0.994 | 0.996 | 0.997 |
| 0.787999999999969 | 0.788 | 0.853 | 0.9 | 0.932 | 0.954 | 0.969 | 0.979 | 0.986 | 0.991 | 0.994 | 0.996 | 0.997 |
| 0.788499999999968 | 0.788 | 0.853 | 0.9 | 0.932 | 0.954 | 0.969 | 0.979 | 0.986 | 0.991 | 0.994 | 0.996 | 0.997 |
| 0.788999999999968 | 0.789 | 0.854 | 0.9 | 0.932 | 0.954 | 0.969 | 0.979 | 0.986 | 0.991 | 0.994 | 0.996 | 0.997 |
| 0.789499999999968 | 0.789 | 0.854 | 0.9 | 0.932 | 0.954 | 0.969 | 0.979 | 0.986 | 0.991 | 0.994 | 0.996 | 0.997 |
| 0.789999999999968 | 0.79 | 0.855 | 0.901 | 0.933 | 0.955 | 0.969 | 0.98 | 0.986 | 0.991 | 0.994 | 0.996 | 0.997 |
| 0.790499999999968 | 0.79 | 0.855 | 0.901 | 0.933 | 0.955 | 0.97 | 0.98 | 0.986 | 0.991 | 0.994 | 0.996 | 0.997 |
| 0.790999999999968 | 0.791 | 0.855 | 0.901 | 0.933 | 0.955 | 0.97 | 0.98 | 0.986 | 0.991 | 0.994 | 0.996 | 0.997 |
| 0.791499999999968 | 0.791 | 0.856 | 0.901 | 0.933 | 0.955 | 0.97 | 0.98 | 0.986 | 0.991 | 0.994 | 0.996 | 0.997 |
| 0.791999999999968 | 0.792 | 0.856 | 0.902 | 0.933 | 0.955 | 0.97 | 0.98 | 0.986 | 0.991 | 0.994 | 0.996 | 0.997 |
| 0.792499999999968 | 0.792 | 0.856 | 0.902 | 0.933 | 0.955 | 0.97 | 0.98 | 0.986 | 0.991 | 0.994 | 0.996 | 0.997 |
| 0.792999999999968 | 0.793 | 0.857 | 0.902 | 0.934 | 0.955 | 0.97 | 0.98 | 0.987 | 0.991 | 0.994 | 0.996 | 0.997 |
| 0.793499999999968 | 0.793 | 0.857 | 0.902 | 0.934 | 0.955 | 0.97 | 0.98 | 0.987 | 0.991 | 0.994 | 0.996 | 0.997 |
| 0.793999999999968 | 0.794 | 0.857 | 0.903 | 0.934 | 0.955 | 0.97 | 0.98 | 0.987 | 0.991 | 0.994 | 0.996 | 0.997 |
| 0.794499999999968 | 0.794 | 0.858 | 0.903 | 0.934 | 0.956 | 0.97 | 0.98 | 0.987 | 0.991 | 0.994 | 0.996 | 0.997 |
| 0.794999999999968 | 0.795 | 0.858 | 0.903 | 0.934 | 0.956 | 0.97 | 0.98 | 0.987 | 0.991 | 0.994 | 0.996 | 0.997 |
| 0.795499999999968 | 0.795 | 0.859 | 0.903 | 0.934 | 0.956 | 0.97 | 0.98 | 0.987 | 0.991 | 0.994 | 0.996 | 0.997 |
| 0.795999999999968 | 0.796 | 0.859 | 0.904 | 0.935 | 0.956 | 0.97 | 0.98 | 0.987 | 0.991 | 0.994 | 0.996 | 0.997 |
| 0.796499999999968 | 0.796 | 0.859 | 0.904 | 0.935 | 0.956 | 0.97 | 0.98 | 0.987 | 0.991 | 0.994 | 0.996 | 0.997 |
| 0.796999999999968 | 0.797 | 0.86 | 0.904 | 0.935 | 0.956 | 0.971 | 0.98 | 0.987 | 0.991 | 0.994 | 0.996 | 0.997 |
| 0.797499999999967 | 0.797 | 0.86 | 0.904 | 0.935 | 0.956 | 0.971 | 0.98 | 0.987 | 0.991 | 0.994 | 0.996 | 0.997 |
| 0.797999999999967 | 0.798 | 0.86 | 0.905 | 0.935 | 0.956 | 0.971 | 0.98 | 0.987 | 0.991 | 0.994 | 0.996 | 0.997 |
| 0.798499999999967 | 0.798 | 0.861 | 0.905 | 0.936 | 0.957 | 0.971 | 0.98 | 0.987 | 0.991 | 0.994 | 0.996 | 0.997 |
| 0.798999999999967 | 0.799 | 0.861 | 0.905 | 0.936 | 0.957 | 0.971 | 0.98 | 0.987 | 0.991 | 0.994 | 0.996 | 0.997 |
| 0.799499999999967 | 0.799 | 0.861 | 0.905 | 0.936 | 0.957 | 0.971 | 0.981 | 0.987 | 0.991 | 0.994 | 0.996 | 0.997 |
| 0.799999999999967 | 0.8 | 0.862 | 0.906 | 0.936 | 0.957 | 0.971 | 0.981 | 0.987 | 0.991 | 0.994 | 0.996 | 0.997 |
| 0.800499999999967 | 0.8 | 0.862 | 0.906 | 0.936 | 0.957 | 0.971 | 0.981 | 0.987 | 0.991 | 0.994 | 0.996 | 0.997 |
| 0.800999999999967 | 0.801 | 0.862 | 0.906 | 0.936 | 0.957 | 0.971 | 0.981 | 0.987 | 0.991 | 0.994 | 0.996 | 0.997 |
| 0.801499999999967 | 0.801 | 0.863 | 0.906 | 0.937 | 0.957 | 0.971 | 0.981 | 0.987 | 0.991 | 0.994 | 0.996 | 0.997 |
| 0.801999999999967 | 0.802 | 0.863 | 0.907 | 0.937 | 0.957 | 0.971 | 0.981 | 0.987 | 0.991 | 0.994 | 0.996 | 0.997 |
| 0.802499999999967 | 0.802 | 0.864 | 0.907 | 0.937 | 0.957 | 0.971 | 0.981 | 0.987 | 0.991 | 0.994 | 0.996 | 0.997 |
| 0.802999999999967 | 0.803 | 0.864 | 0.907 | 0.937 | 0.958 | 0.972 | 0.981 | 0.987 | 0.991 | 0.994 | 0.996 | 0.997 |
| 0.803499999999967 | 0.803 | 0.864 | 0.907 | 0.937 | 0.958 | 0.972 | 0.981 | 0.987 | 0.991 | 0.994 | 0.996 | 0.997 |
| 0.803999999999967 | 0.804 | 0.865 | 0.908 | 0.937 | 0.958 | 0.972 | 0.981 | 0.987 | 0.992 | 0.994 | 0.996 | 0.997 |
| 0.804499999999967 | 0.804 | 0.865 | 0.908 | 0.938 | 0.958 | 0.972 | 0.981 | 0.987 | 0.992 | 0.994 | 0.996 | 0.997 |
| 0.804999999999967 | 0.805 | 0.865 | 0.908 | 0.938 | 0.958 | 0.972 | 0.981 | 0.987 | 0.992 | 0.994 | 0.996 | 0.997 |
| 0.805499999999967 | 0.805 | 0.866 | 0.908 | 0.938 | 0.958 | 0.972 | 0.981 | 0.987 | 0.992 | 0.994 | 0.996 | 0.998 |
| 0.805999999999967 | 0.806 | 0.866 | 0.909 | 0.938 | 0.958 | 0.972 | 0.981 | 0.987 | 0.992 | 0.994 | 0.996 | 0.998 |
| 0.806499999999967 | 0.806 | 0.866 | 0.909 | 0.938 | 0.958 | 0.972 | 0.981 | 0.987 | 0.992 | 0.994 | 0.996 | 0.998 |
| 0.806999999999966 | 0.807 | 0.867 | 0.909 | 0.938 | 0.959 | 0.972 | 0.981 | 0.988 | 0.992 | 0.994 | 0.996 | 0.998 |
| 0.807499999999966 | 0.807 | 0.867 | 0.909 | 0.939 | 0.959 | 0.972 | 0.981 | 0.988 | 0.992 | 0.994 | 0.996 | 0.998 |
| 0.807999999999966 | 0.808 | 0.868 | 0.91 | 0.939 | 0.959 | 0.972 | 0.981 | 0.988 | 0.992 | 0.994 | 0.996 | 0.998 |
| 0.808499999999966 | 0.808 | 0.868 | 0.91 | 0.939 | 0.959 | 0.972 | 0.982 | 0.988 | 0.992 | 0.994 | 0.996 | 0.998 |
| 0.808999999999966 | 0.809 | 0.868 | 0.91 | 0.939 | 0.959 | 0.972 | 0.982 | 0.988 | 0.992 | 0.995 | 0.996 | 0.998 |
| 0.809499999999966 | 0.809 | 0.869 | 0.91 | 0.939 | 0.959 | 0.973 | 0.982 | 0.988 | 0.992 | 0.995 | 0.996 | 0.998 |
| 0.809999999999966 | 0.81 | 0.869 | 0.911 | 0.939 | 0.959 | 0.973 | 0.982 | 0.988 | 0.992 | 0.995 | 0.996 | 0.998 |
| 0.810499999999966 | 0.81 | 0.869 | 0.911 | 0.94 | 0.959 | 0.973 | 0.982 | 0.988 | 0.992 | 0.995 | 0.996 | 0.998 |
| 0.810999999999966 | 0.811 | 0.87 | 0.911 | 0.94 | 0.959 | 0.973 | 0.982 | 0.988 | 0.992 | 0.995 | 0.996 | 0.998 |
| 0.811499999999966 | 0.811 | 0.87 | 0.911 | 0.94 | 0.96 | 0.973 | 0.982 | 0.988 | 0.992 | 0.995 | 0.996 | 0.998 |
| 0.811999999999966 | 0.812 | 0.87 | 0.912 | 0.94 | 0.96 | 0.973 | 0.982 | 0.988 | 0.992 | 0.995 | 0.996 | 0.998 |
| 0.812499999999966 | 0.812 | 0.871 | 0.912 | 0.94 | 0.96 | 0.973 | 0.982 | 0.988 | 0.992 | 0.995 | 0.996 | 0.998 |
| 0.812999999999966 | 0.813 | 0.871 | 0.912 | 0.941 | 0.96 | 0.973 | 0.982 | 0.988 | 0.992 | 0.995 | 0.996 | 0.998 |
| 0.813499999999966 | 0.813 | 0.871 | 0.912 | 0.941 | 0.96 | 0.973 | 0.982 | 0.988 | 0.992 | 0.995 | 0.996 | 0.998 |
| 0.813999999999966 | 0.814 | 0.872 | 0.913 | 0.941 | 0.96 | 0.973 | 0.982 | 0.988 | 0.992 | 0.995 | 0.996 | 0.998 |
| 0.814499999999966 | 0.814 | 0.872 | 0.913 | 0.941 | 0.96 | 0.973 | 0.982 | 0.988 | 0.992 | 0.995 | 0.996 | 0.998 |
| 0.814999999999966 | 0.815 | 0.873 | 0.913 | 0.941 | 0.96 | 0.973 | 0.982 | 0.988 | 0.992 | 0.995 | 0.996 | 0.998 |
| 0.815499999999966 | 0.815 | 0.873 | 0.913 | 0.941 | 0.961 | 0.973 | 0.982 | 0.988 | 0.992 | 0.995 | 0.996 | 0.998 |
| 0.815999999999965 | 0.816 | 0.873 | 0.914 | 0.942 | 0.961 | 0.974 | 0.982 | 0.988 | 0.992 | 0.995 | 0.996 | 0.998 |
| 0.816499999999965 | 0.816 | 0.874 | 0.914 | 0.942 | 0.961 | 0.974 | 0.982 | 0.988 | 0.992 | 0.995 | 0.996 | 0.998 |
| 0.816999999999965 | 0.817 | 0.874 | 0.914 | 0.942 | 0.961 | 0.974 | 0.982 | 0.988 | 0.992 | 0.995 | 0.997 | 0.998 |
| 0.817499999999965 | 0.817 | 0.874 | 0.914 | 0.942 | 0.961 | 0.974 | 0.982 | 0.988 | 0.992 | 0.995 | 0.997 | 0.998 |
| 0.817999999999965 | 0.818 | 0.875 | 0.915 | 0.942 | 0.961 | 0.974 | 0.983 | 0.988 | 0.992 | 0.995 | 0.997 | 0.998 |
| 0.818499999999965 | 0.818 | 0.875 | 0.915 | 0.942 | 0.961 | 0.974 | 0.983 | 0.988 | 0.992 | 0.995 | 0.997 | 0.998 |
| 0.818999999999965 | 0.819 | 0.875 | 0.915 | 0.943 | 0.961 | 0.974 | 0.983 | 0.988 | 0.992 | 0.995 | 0.997 | 0.998 |
| 0.819499999999965 | 0.819 | 0.876 | 0.915 | 0.943 | 0.961 | 0.974 | 0.983 | 0.988 | 0.992 | 0.995 | 0.997 | 0.998 |
| 0.819999999999965 | 0.82 | 0.876 | 0.916 | 0.943 | 0.962 | 0.974 | 0.983 | 0.988 | 0.992 | 0.995 | 0.997 | 0.998 |
| 0.820499999999965 | 0.82 | 0.876 | 0.916 | 0.943 | 0.962 | 0.974 | 0.983 | 0.988 | 0.992 | 0.995 | 0.997 | 0.998 |
| 0.820999999999965 | 0.821 | 0.877 | 0.916 | 0.943 | 0.962 | 0.974 | 0.983 | 0.989 | 0.992 | 0.995 | 0.997 | 0.998 |
| 0.821499999999965 | 0.821 | 0.877 | 0.916 | 0.943 | 0.962 | 0.974 | 0.983 | 0.989 | 0.992 | 0.995 | 0.997 | 0.998 |
| 0.821999999999965 | 0.822 | 0.878 | 0.917 | 0.944 | 0.962 | 0.975 | 0.983 | 0.989 | 0.992 | 0.995 | 0.997 | 0.998 |
| 0.822499999999965 | 0.822 | 0.878 | 0.917 | 0.944 | 0.962 | 0.975 | 0.983 | 0.989 | 0.992 | 0.995 | 0.997 | 0.998 |
| 0.822999999999965 | 0.823 | 0.878 | 0.917 | 0.944 | 0.962 | 0.975 | 0.983 | 0.989 | 0.992 | 0.995 | 0.997 | 0.998 |
| 0.823499999999965 | 0.823 | 0.879 | 0.917 | 0.944 | 0.962 | 0.975 | 0.983 | 0.989 | 0.992 | 0.995 | 0.997 | 0.998 |
| 0.823999999999965 | 0.824 | 0.879 | 0.918 | 0.944 | 0.962 | 0.975 | 0.983 | 0.989 | 0.992 | 0.995 | 0.997 | 0.998 |
| 0.824499999999965 | 0.824 | 0.879 | 0.918 | 0.944 | 0.963 | 0.975 | 0.983 | 0.989 | 0.992 | 0.995 | 0.997 | 0.998 |
| 0.824999999999964 | 0.825 | 0.88 | 0.918 | 0.945 | 0.963 | 0.975 | 0.983 | 0.989 | 0.993 | 0.995 | 0.997 | 0.998 |
| 0.825499999999964 | 0.825 | 0.88 | 0.918 | 0.945 | 0.963 | 0.975 | 0.983 | 0.989 | 0.993 | 0.995 | 0.997 | 0.998 |
| 0.825999999999964 | 0.826 | 0.88 | 0.919 | 0.945 | 0.963 | 0.975 | 0.983 | 0.989 | 0.993 | 0.995 | 0.997 | 0.998 |
| 0.826499999999964 | 0.826 | 0.881 | 0.919 | 0.945 | 0.963 | 0.975 | 0.983 | 0.989 | 0.993 | 0.995 | 0.997 | 0.998 |
| 0.826999999999964 | 0.827 | 0.881 | 0.919 | 0.945 | 0.963 | 0.975 | 0.983 | 0.989 | 0.993 | 0.995 | 0.997 | 0.998 |
| 0.827499999999964 | 0.827 | 0.881 | 0.919 | 0.945 | 0.963 | 0.975 | 0.984 | 0.989 | 0.993 | 0.995 | 0.997 | 0.998 |
| 0.827999999999964 | 0.828 | 0.882 | 0.92 | 0.946 | 0.963 | 0.975 | 0.984 | 0.989 | 0.993 | 0.995 | 0.997 | 0.998 |
| 0.828499999999964 | 0.828 | 0.882 | 0.92 | 0.946 | 0.964 | 0.976 | 0.984 | 0.989 | 0.993 | 0.995 | 0.997 | 0.998 |
| 0.828999999999964 | 0.829 | 0.882 | 0.92 | 0.946 | 0.964 | 0.976 | 0.984 | 0.989 | 0.993 | 0.995 | 0.997 | 0.998 |
| 0.829499999999964 | 0.829 | 0.883 | 0.92 | 0.946 | 0.964 | 0.976 | 0.984 | 0.989 | 0.993 | 0.995 | 0.997 | 0.998 |
| 0.829999999999964 | 0.83 | 0.883 | 0.921 | 0.946 | 0.964 | 0.976 | 0.984 | 0.989 | 0.993 | 0.995 | 0.997 | 0.998 |
| 0.830499999999964 | 0.83 | 0.884 | 0.921 | 0.946 | 0.964 | 0.976 | 0.984 | 0.989 | 0.993 | 0.995 | 0.997 | 0.998 |
| 0.830999999999964 | 0.831 | 0.884 | 0.921 | 0.947 | 0.964 | 0.976 | 0.984 | 0.989 | 0.993 | 0.995 | 0.997 | 0.998 |
| 0.831499999999964 | 0.831 | 0.884 | 0.921 | 0.947 | 0.964 | 0.976 | 0.984 | 0.989 | 0.993 | 0.995 | 0.997 | 0.998 |
| 0.831999999999964 | 0.832 | 0.885 | 0.922 | 0.947 | 0.964 | 0.976 | 0.984 | 0.989 | 0.993 | 0.995 | 0.997 | 0.998 |
| 0.832499999999964 | 0.832 | 0.885 | 0.922 | 0.947 | 0.964 | 0.976 | 0.984 | 0.989 | 0.993 | 0.995 | 0.997 | 0.998 |
| 0.832999999999964 | 0.833 | 0.885 | 0.922 | 0.947 | 0.965 | 0.976 | 0.984 | 0.989 | 0.993 | 0.995 | 0.997 | 0.998 |
| 0.833499999999964 | 0.833 | 0.886 | 0.922 | 0.947 | 0.965 | 0.976 | 0.984 | 0.989 | 0.993 | 0.995 | 0.997 | 0.998 |
| 0.833999999999963 | 0.834 | 0.886 | 0.922 | 0.948 | 0.965 | 0.976 | 0.984 | 0.989 | 0.993 | 0.995 | 0.997 | 0.998 |
| 0.834499999999963 | 0.834 | 0.886 | 0.923 | 0.948 | 0.965 | 0.976 | 0.984 | 0.989 | 0.993 | 0.995 | 0.997 | 0.998 |
| 0.834999999999963 | 0.835 | 0.887 | 0.923 | 0.948 | 0.965 | 0.977 | 0.984 | 0.99 | 0.993 | 0.995 | 0.997 | 0.998 |
| 0.835499999999963 | 0.835 | 0.887 | 0.923 | 0.948 | 0.965 | 0.977 | 0.984 | 0.99 | 0.993 | 0.995 | 0.997 | 0.998 |
| 0.835999999999963 | 0.836 | 0.887 | 0.923 | 0.948 | 0.965 | 0.977 | 0.984 | 0.99 | 0.993 | 0.995 | 0.997 | 0.998 |
| 0.836499999999963 | 0.836 | 0.888 | 0.924 | 0.948 | 0.965 | 0.977 | 0.984 | 0.99 | 0.993 | 0.995 | 0.997 | 0.998 |
| 0.836999999999963 | 0.837 | 0.888 | 0.924 | 0.949 | 0.965 | 0.977 | 0.985 | 0.99 | 0.993 | 0.995 | 0.997 | 0.998 |
| 0.837499999999963 | 0.837 | 0.888 | 0.924 | 0.949 | 0.966 | 0.977 | 0.985 | 0.99 | 0.993 | 0.995 | 0.997 | 0.998 |
| 0.837999999999963 | 0.838 | 0.889 | 0.924 | 0.949 | 0.966 | 0.977 | 0.985 | 0.99 | 0.993 | 0.995 | 0.997 | 0.998 |
| 0.838499999999963 | 0.838 | 0.889 | 0.925 | 0.949 | 0.966 | 0.977 | 0.985 | 0.99 | 0.993 | 0.995 | 0.997 | 0.998 |
| 0.838999999999963 | 0.839 | 0.89 | 0.925 | 0.949 | 0.966 | 0.977 | 0.985 | 0.99 | 0.993 | 0.995 | 0.997 | 0.998 |
| 0.839499999999963 | 0.839 | 0.89 | 0.925 | 0.949 | 0.966 | 0.977 | 0.985 | 0.99 | 0.993 | 0.995 | 0.997 | 0.998 |
| 0.839999999999963 | 0.84 | 0.89 | 0.925 | 0.95 | 0.966 | 0.977 | 0.985 | 0.99 | 0.993 | 0.995 | 0.997 | 0.998 |
| 0.840499999999963 | 0.84 | 0.891 | 0.926 | 0.95 | 0.966 | 0.977 | 0.985 | 0.99 | 0.993 | 0.995 | 0.997 | 0.998 |
| 0.840999999999963 | 0.841 | 0.891 | 0.926 | 0.95 | 0.966 | 0.977 | 0.985 | 0.99 | 0.993 | 0.996 | 0.997 | 0.998 |
| 0.841499999999963 | 0.841 | 0.891 | 0.926 | 0.95 | 0.966 | 0.978 | 0.985 | 0.99 | 0.993 | 0.996 | 0.997 | 0.998 |
| 0.841999999999963 | 0.842 | 0.892 | 0.926 | 0.95 | 0.967 | 0.978 | 0.985 | 0.99 | 0.993 | 0.996 | 0.997 | 0.998 |
| 0.842499999999963 | 0.842 | 0.892 | 0.927 | 0.95 | 0.967 | 0.978 | 0.985 | 0.99 | 0.993 | 0.996 | 0.997 | 0.998 |
| 0.842999999999963 | 0.843 | 0.892 | 0.927 | 0.951 | 0.967 | 0.978 | 0.985 | 0.99 | 0.993 | 0.996 | 0.997 | 0.998 |
| 0.843499999999962 | 0.843 | 0.893 | 0.927 | 0.951 | 0.967 | 0.978 | 0.985 | 0.99 | 0.993 | 0.996 | 0.997 | 0.998 |
| 0.843999999999962 | 0.844 | 0.893 | 0.927 | 0.951 | 0.967 | 0.978 | 0.985 | 0.99 | 0.993 | 0.996 | 0.997 | 0.998 |
| 0.844499999999962 | 0.844 | 0.893 | 0.928 | 0.951 | 0.967 | 0.978 | 0.985 | 0.99 | 0.993 | 0.996 | 0.997 | 0.998 |
| 0.844999999999962 | 0.845 | 0.894 | 0.928 | 0.951 | 0.967 | 0.978 | 0.985 | 0.99 | 0.993 | 0.996 | 0.997 | 0.998 |
| 0.845499999999962 | 0.845 | 0.894 | 0.928 | 0.951 | 0.967 | 0.978 | 0.985 | 0.99 | 0.993 | 0.996 | 0.997 | 0.998 |
| 0.845999999999962 | 0.846 | 0.894 | 0.928 | 0.952 | 0.968 | 0.978 | 0.985 | 0.99 | 0.993 | 0.996 | 0.997 | 0.998 |
| 0.846499999999962 | 0.846 | 0.895 | 0.929 | 0.952 | 0.968 | 0.978 | 0.985 | 0.99 | 0.994 | 0.996 | 0.997 | 0.998 |
| 0.846999999999962 | 0.847 | 0.895 | 0.929 | 0.952 | 0.968 | 0.978 | 0.986 | 0.99 | 0.994 | 0.996 | 0.997 | 0.998 |
| 0.847499999999962 | 0.847 | 0.896 | 0.929 | 0.952 | 0.968 | 0.978 | 0.986 | 0.99 | 0.994 | 0.996 | 0.997 | 0.998 |
| 0.847999999999962 | 0.848 | 0.896 | 0.929 | 0.952 | 0.968 | 0.979 | 0.986 | 0.99 | 0.994 | 0.996 | 0.997 | 0.998 |
| 0.848499999999962 | 0.848 | 0.896 | 0.93 | 0.952 | 0.968 | 0.979 | 0.986 | 0.99 | 0.994 | 0.996 | 0.997 | 0.998 |
| 0.848999999999962 | 0.849 | 0.897 | 0.93 | 0.953 | 0.968 | 0.979 | 0.986 | 0.99 | 0.994 | 0.996 | 0.997 | 0.998 |
| 0.849499999999962 | 0.849 | 0.897 | 0.93 | 0.953 | 0.968 | 0.979 | 0.986 | 0.99 | 0.994 | 0.996 | 0.997 | 0.998 |
| 0.849999999999962 | 0.85 | 0.897 | 0.93 | 0.953 | 0.968 | 0.979 | 0.986 | 0.991 | 0.994 | 0.996 | 0.997 | 0.998 |
| 0.850499999999962 | 0.85 | 0.898 | 0.931 | 0.953 | 0.969 | 0.979 | 0.986 | 0.991 | 0.994 | 0.996 | 0.997 | 0.998 |
| 0.850999999999962 | 0.851 | 0.898 | 0.931 | 0.953 | 0.969 | 0.979 | 0.986 | 0.991 | 0.994 | 0.996 | 0.997 | 0.998 |
| 0.851499999999962 | 0.851 | 0.898 | 0.931 | 0.953 | 0.969 | 0.979 | 0.986 | 0.991 | 0.994 | 0.996 | 0.997 | 0.998 |
| 0.851999999999962 | 0.852 | 0.899 | 0.931 | 0.954 | 0.969 | 0.979 | 0.986 | 0.991 | 0.994 | 0.996 | 0.997 | 0.998 |
| 0.852499999999961 | 0.852 | 0.899 | 0.932 | 0.954 | 0.969 | 0.979 | 0.986 | 0.991 | 0.994 | 0.996 | 0.997 | 0.998 |
| 0.852999999999961 | 0.853 | 0.899 | 0.932 | 0.954 | 0.969 | 0.979 | 0.986 | 0.991 | 0.994 | 0.996 | 0.997 | 0.998 |
| 0.853499999999961 | 0.853 | 0.9 | 0.932 | 0.954 | 0.969 | 0.979 | 0.986 | 0.991 | 0.994 | 0.996 | 0.997 | 0.998 |
| 0.853999999999961 | 0.854 | 0.9 | 0.932 | 0.954 | 0.969 | 0.979 | 0.986 | 0.991 | 0.994 | 0.996 | 0.997 | 0.998 |
| 0.854499999999961 | 0.854 | 0.9 | 0.933 | 0.954 | 0.969 | 0.98 | 0.986 | 0.991 | 0.994 | 0.996 | 0.997 | 0.998 |
| 0.854999999999961 | 0.855 | 0.901 | 0.933 | 0.955 | 0.97 | 0.98 | 0.986 | 0.991 | 0.994 | 0.996 | 0.997 | 0.998 |
| 0.855499999999961 | 0.855 | 0.901 | 0.933 | 0.955 | 0.97 | 0.98 | 0.986 | 0.991 | 0.994 | 0.996 | 0.997 | 0.998 |
| 0.855999999999961 | 0.856 | 0.902 | 0.933 | 0.955 | 0.97 | 0.98 | 0.986 | 0.991 | 0.994 | 0.996 | 0.997 | 0.998 |
| 0.856499999999961 | 0.856 | 0.902 | 0.933 | 0.955 | 0.97 | 0.98 | 0.986 | 0.991 | 0.994 | 0.996 | 0.997 | 0.998 |
| 0.856999999999961 | 0.857 | 0.902 | 0.934 | 0.955 | 0.97 | 0.98 | 0.987 | 0.991 | 0.994 | 0.996 | 0.997 | 0.998 |
| 0.857499999999961 | 0.857 | 0.903 | 0.934 | 0.955 | 0.97 | 0.98 | 0.987 | 0.991 | 0.994 | 0.996 | 0.997 | 0.998 |
| 0.857999999999961 | 0.858 | 0.903 | 0.934 | 0.956 | 0.97 | 0.98 | 0.987 | 0.991 | 0.994 | 0.996 | 0.997 | 0.998 |
| 0.858499999999961 | 0.858 | 0.903 | 0.934 | 0.956 | 0.97 | 0.98 | 0.987 | 0.991 | 0.994 | 0.996 | 0.997 | 0.998 |
| 0.858999999999961 | 0.859 | 0.904 | 0.935 | 0.956 | 0.97 | 0.98 | 0.987 | 0.991 | 0.994 | 0.996 | 0.997 | 0.998 |
| 0.859499999999961 | 0.859 | 0.904 | 0.935 | 0.956 | 0.971 | 0.98 | 0.987 | 0.991 | 0.994 | 0.996 | 0.997 | 0.998 |
| 0.859999999999961 | 0.86 | 0.904 | 0.935 | 0.956 | 0.971 | 0.98 | 0.987 | 0.991 | 0.994 | 0.996 | 0.997 | 0.998 |
| 0.860499999999961 | 0.86 | 0.905 | 0.935 | 0.956 | 0.971 | 0.98 | 0.987 | 0.991 | 0.994 | 0.996 | 0.997 | 0.998 |
| 0.860999999999961 | 0.861 | 0.905 | 0.936 | 0.957 | 0.971 | 0.98 | 0.987 | 0.991 | 0.994 | 0.996 | 0.997 | 0.998 |
| 0.86149999999996 | 0.861 | 0.905 | 0.936 | 0.957 | 0.971 | 0.981 | 0.987 | 0.991 | 0.994 | 0.996 | 0.997 | 0.998 |
| 0.86199999999996 | 0.862 | 0.906 | 0.936 | 0.957 | 0.971 | 0.981 | 0.987 | 0.991 | 0.994 | 0.996 | 0.997 | 0.998 |
| 0.86249999999996 | 0.862 | 0.906 | 0.936 | 0.957 | 0.971 | 0.981 | 0.987 | 0.991 | 0.994 | 0.996 | 0.997 | 0.998 |
| 0.86299999999996 | 0.863 | 0.906 | 0.937 | 0.957 | 0.971 | 0.981 | 0.987 | 0.991 | 0.994 | 0.996 | 0.997 | 0.998 |
| 0.86349999999996 | 0.863 | 0.907 | 0.937 | 0.957 | 0.971 | 0.981 | 0.987 | 0.991 | 0.994 | 0.996 | 0.997 | 0.998 |
| 0.86399999999996 | 0.864 | 0.907 | 0.937 | 0.958 | 0.972 | 0.981 | 0.987 | 0.991 | 0.994 | 0.996 | 0.997 | 0.998 |
| 0.86449999999996 | 0.864 | 0.907 | 0.937 | 0.958 | 0.972 | 0.981 | 0.987 | 0.992 | 0.994 | 0.996 | 0.997 | 0.998 |
| 0.86499999999996 | 0.865 | 0.908 | 0.938 | 0.958 | 0.972 | 0.981 | 0.987 | 0.992 | 0.994 | 0.996 | 0.997 | 0.998 |
| 0.86549999999996 | 0.865 | 0.908 | 0.938 | 0.958 | 0.972 | 0.981 | 0.987 | 0.992 | 0.994 | 0.996 | 0.997 | 0.998 |
| 0.86599999999996 | 0.866 | 0.909 | 0.938 | 0.958 | 0.972 | 0.981 | 0.987 | 0.992 | 0.994 | 0.996 | 0.998 | 0.998 |
| 0.86649999999996 | 0.866 | 0.909 | 0.938 | 0.958 | 0.972 | 0.981 | 0.987 | 0.992 | 0.994 | 0.996 | 0.998 | 0.998 |
| 0.86699999999996 | 0.867 | 0.909 | 0.939 | 0.959 | 0.972 | 0.981 | 0.988 | 0.992 | 0.994 | 0.996 | 0.998 | 0.998 |
| 0.86749999999996 | 0.867 | 0.91 | 0.939 | 0.959 | 0.972 | 0.981 | 0.988 | 0.992 | 0.994 | 0.996 | 0.998 | 0.998 |
| 0.86799999999996 | 0.868 | 0.91 | 0.939 | 0.959 | 0.972 | 0.982 | 0.988 | 0.992 | 0.994 | 0.996 | 0.998 | 0.998 |
| 0.86849999999996 | 0.868 | 0.91 | 0.939 | 0.959 | 0.973 | 0.982 | 0.988 | 0.992 | 0.995 | 0.996 | 0.998 | 0.998 |
| 0.86899999999996 | 0.869 | 0.911 | 0.94 | 0.959 | 0.973 | 0.982 | 0.988 | 0.992 | 0.995 | 0.996 | 0.998 | 0.998 |
| 0.86949999999996 | 0.869 | 0.911 | 0.94 | 0.959 | 0.973 | 0.982 | 0.988 | 0.992 | 0.995 | 0.996 | 0.998 | 0.998 |
| 0.86999999999996 | 0.87 | 0.911 | 0.94 | 0.96 | 0.973 | 0.982 | 0.988 | 0.992 | 0.995 | 0.996 | 0.998 | 0.998 |
| 0.870499999999959 | 0.87 | 0.912 | 0.94 | 0.96 | 0.973 | 0.982 | 0.988 | 0.992 | 0.995 | 0.996 | 0.998 | 0.998 |
| 0.870999999999959 | 0.871 | 0.912 | 0.94 | 0.96 | 0.973 | 0.982 | 0.988 | 0.992 | 0.995 | 0.996 | 0.998 | 0.998 |
| 0.871499999999959 | 0.871 | 0.912 | 0.941 | 0.96 | 0.973 | 0.982 | 0.988 | 0.992 | 0.995 | 0.996 | 0.998 | 0.998 |
| 0.871999999999959 | 0.872 | 0.913 | 0.941 | 0.96 | 0.973 | 0.982 | 0.988 | 0.992 | 0.995 | 0.996 | 0.998 | 0.998 |
| 0.872499999999959 | 0.872 | 0.913 | 0.941 | 0.96 | 0.973 | 0.982 | 0.988 | 0.992 | 0.995 | 0.996 | 0.998 | 0.998 |
| 0.872999999999959 | 0.873 | 0.913 | 0.941 | 0.961 | 0.974 | 0.982 | 0.988 | 0.992 | 0.995 | 0.996 | 0.998 | 0.998 |
| 0.873499999999959 | 0.873 | 0.914 | 0.942 | 0.961 | 0.974 | 0.982 | 0.988 | 0.992 | 0.995 | 0.996 | 0.998 | 0.998 |
| 0.873999999999959 | 0.874 | 0.914 | 0.942 | 0.961 | 0.974 | 0.982 | 0.988 | 0.992 | 0.995 | 0.997 | 0.998 | 0.998 |
| 0.874499999999959 | 0.874 | 0.914 | 0.942 | 0.961 | 0.974 | 0.982 | 0.988 | 0.992 | 0.995 | 0.997 | 0.998 | 0.998 |
| 0.874999999999959 | 0.875 | 0.915 | 0.942 | 0.961 | 0.974 | 0.983 | 0.988 | 0.992 | 0.995 | 0.997 | 0.998 | 0.998 |
| 0.875499999999959 | 0.875 | 0.915 | 0.943 | 0.961 | 0.974 | 0.983 | 0.988 | 0.992 | 0.995 | 0.997 | 0.998 | 0.998 |
| 0.875999999999959 | 0.876 | 0.916 | 0.943 | 0.962 | 0.974 | 0.983 | 0.988 | 0.992 | 0.995 | 0.997 | 0.998 | 0.998 |
| 0.876499999999959 | 0.876 | 0.916 | 0.943 | 0.962 | 0.974 | 0.983 | 0.988 | 0.992 | 0.995 | 0.997 | 0.998 | 0.998 |
| 0.876999999999959 | 0.877 | 0.916 | 0.943 | 0.962 | 0.974 | 0.983 | 0.989 | 0.992 | 0.995 | 0.997 | 0.998 | 0.998 |
| 0.877499999999959 | 0.877 | 0.917 | 0.944 | 0.962 | 0.975 | 0.983 | 0.989 | 0.992 | 0.995 | 0.997 | 0.998 | 0.998 |
| 0.877999999999959 | 0.878 | 0.917 | 0.944 | 0.962 | 0.975 | 0.983 | 0.989 | 0.992 | 0.995 | 0.997 | 0.998 | 0.998 |
| 0.878499999999959 | 0.878 | 0.917 | 0.944 | 0.962 | 0.975 | 0.983 | 0.989 | 0.992 | 0.995 | 0.997 | 0.998 | 0.999 |
| 0.878999999999959 | 0.879 | 0.918 | 0.944 | 0.963 | 0.975 | 0.983 | 0.989 | 0.992 | 0.995 | 0.997 | 0.998 | 0.999 |
| 0.879499999999958 | 0.879 | 0.918 | 0.945 | 0.963 | 0.975 | 0.983 | 0.989 | 0.993 | 0.995 | 0.997 | 0.998 | 0.999 |
| 0.879999999999958 | 0.88 | 0.918 | 0.945 | 0.963 | 0.975 | 0.983 | 0.989 | 0.993 | 0.995 | 0.997 | 0.998 | 0.999 |
| 0.880499999999958 | 0.88 | 0.919 | 0.945 | 0.963 | 0.975 | 0.983 | 0.989 | 0.993 | 0.995 | 0.997 | 0.998 | 0.999 |
| 0.880999999999958 | 0.881 | 0.919 | 0.945 | 0.963 | 0.975 | 0.983 | 0.989 | 0.993 | 0.995 | 0.997 | 0.998 | 0.999 |
| 0.881499999999958 | 0.881 | 0.919 | 0.945 | 0.963 | 0.975 | 0.984 | 0.989 | 0.993 | 0.995 | 0.997 | 0.998 | 0.999 |
| 0.881999999999958 | 0.882 | 0.92 | 0.946 | 0.963 | 0.976 | 0.984 | 0.989 | 0.993 | 0.995 | 0.997 | 0.998 | 0.999 |
| 0.882499999999958 | 0.882 | 0.92 | 0.946 | 0.964 | 0.976 | 0.984 | 0.989 | 0.993 | 0.995 | 0.997 | 0.998 | 0.999 |
| 0.882999999999958 | 0.883 | 0.92 | 0.946 | 0.964 | 0.976 | 0.984 | 0.989 | 0.993 | 0.995 | 0.997 | 0.998 | 0.999 |
| 0.883499999999958 | 0.883 | 0.921 | 0.946 | 0.964 | 0.976 | 0.984 | 0.989 | 0.993 | 0.995 | 0.997 | 0.998 | 0.999 |
| 0.883999999999958 | 0.884 | 0.921 | 0.947 | 0.964 | 0.976 | 0.984 | 0.989 | 0.993 | 0.995 | 0.997 | 0.998 | 0.999 |
| 0.884499999999958 | 0.884 | 0.921 | 0.947 | 0.964 | 0.976 | 0.984 | 0.989 | 0.993 | 0.995 | 0.997 | 0.998 | 0.999 |
| 0.884999999999958 | 0.885 | 0.922 | 0.947 | 0.964 | 0.976 | 0.984 | 0.989 | 0.993 | 0.995 | 0.997 | 0.998 | 0.999 |
| 0.885499999999958 | 0.885 | 0.922 | 0.947 | 0.965 | 0.976 | 0.984 | 0.989 | 0.993 | 0.995 | 0.997 | 0.998 | 0.999 |
| 0.885999999999958 | 0.886 | 0.922 | 0.948 | 0.965 | 0.976 | 0.984 | 0.989 | 0.993 | 0.995 | 0.997 | 0.998 | 0.999 |
| 0.886499999999958 | 0.886 | 0.923 | 0.948 | 0.965 | 0.976 | 0.984 | 0.989 | 0.993 | 0.995 | 0.997 | 0.998 | 0.999 |
| 0.886999999999958 | 0.887 | 0.923 | 0.948 | 0.965 | 0.977 | 0.984 | 0.99 | 0.993 | 0.995 | 0.997 | 0.998 | 0.999 |
| 0.887499999999958 | 0.887 | 0.924 | 0.948 | 0.965 | 0.977 | 0.984 | 0.99 | 0.993 | 0.995 | 0.997 | 0.998 | 0.999 |
| 0.887999999999958 | 0.888 | 0.924 | 0.949 | 0.965 | 0.977 | 0.984 | 0.99 | 0.993 | 0.995 | 0.997 | 0.998 | 0.999 |
| 0.888499999999957 | 0.888 | 0.924 | 0.949 | 0.966 | 0.977 | 0.985 | 0.99 | 0.993 | 0.995 | 0.997 | 0.998 | 0.999 |
| 0.888999999999957 | 0.889 | 0.925 | 0.949 | 0.966 | 0.977 | 0.985 | 0.99 | 0.993 | 0.995 | 0.997 | 0.998 | 0.999 |
| 0.889499999999957 | 0.889 | 0.925 | 0.949 | 0.966 | 0.977 | 0.985 | 0.99 | 0.993 | 0.995 | 0.997 | 0.998 | 0.999 |
| 0.889999999999957 | 0.89 | 0.925 | 0.95 | 0.966 | 0.977 | 0.985 | 0.99 | 0.993 | 0.995 | 0.997 | 0.998 | 0.999 |
| 0.890499999999957 | 0.89 | 0.926 | 0.95 | 0.966 | 0.977 | 0.985 | 0.99 | 0.993 | 0.995 | 0.997 | 0.998 | 0.999 |
| 0.890999999999957 | 0.891 | 0.926 | 0.95 | 0.966 | 0.977 | 0.985 | 0.99 | 0.993 | 0.996 | 0.997 | 0.998 | 0.999 |
| 0.891499999999957 | 0.891 | 0.926 | 0.95 | 0.967 | 0.978 | 0.985 | 0.99 | 0.993 | 0.996 | 0.997 | 0.998 | 0.999 |
| 0.891999999999957 | 0.892 | 0.927 | 0.95 | 0.967 | 0.978 | 0.985 | 0.99 | 0.993 | 0.996 | 0.997 | 0.998 | 0.999 |
| 0.892499999999957 | 0.892 | 0.927 | 0.951 | 0.967 | 0.978 | 0.985 | 0.99 | 0.993 | 0.996 | 0.997 | 0.998 | 0.999 |
| 0.892999999999957 | 0.893 | 0.927 | 0.951 | 0.967 | 0.978 | 0.985 | 0.99 | 0.993 | 0.996 | 0.997 | 0.998 | 0.999 |
| 0.893499999999957 | 0.893 | 0.928 | 0.951 | 0.967 | 0.978 | 0.985 | 0.99 | 0.993 | 0.996 | 0.997 | 0.998 | 0.999 |
| 0.893999999999957 | 0.894 | 0.928 | 0.951 | 0.967 | 0.978 | 0.985 | 0.99 | 0.993 | 0.996 | 0.997 | 0.998 | 0.999 |
| 0.894499999999957 | 0.894 | 0.928 | 0.952 | 0.968 | 0.978 | 0.985 | 0.99 | 0.993 | 0.996 | 0.997 | 0.998 | 0.999 |
| 0.894999999999957 | 0.895 | 0.929 | 0.952 | 0.968 | 0.978 | 0.985 | 0.99 | 0.994 | 0.996 | 0.997 | 0.998 | 0.999 |
| 0.895499999999957 | 0.895 | 0.929 | 0.952 | 0.968 | 0.978 | 0.986 | 0.99 | 0.994 | 0.996 | 0.997 | 0.998 | 0.999 |
| 0.895999999999957 | 0.896 | 0.929 | 0.952 | 0.968 | 0.979 | 0.986 | 0.99 | 0.994 | 0.996 | 0.997 | 0.998 | 0.999 |
| 0.896499999999957 | 0.896 | 0.93 | 0.953 | 0.968 | 0.979 | 0.986 | 0.99 | 0.994 | 0.996 | 0.997 | 0.998 | 0.999 |
| 0.896999999999957 | 0.897 | 0.93 | 0.953 | 0.968 | 0.979 | 0.986 | 0.991 | 0.994 | 0.996 | 0.997 | 0.998 | 0.999 |
| 0.897499999999956 | 0.897 | 0.93 | 0.953 | 0.968 | 0.979 | 0.986 | 0.991 | 0.994 | 0.996 | 0.997 | 0.998 | 0.999 |
| 0.897999999999956 | 0.898 | 0.931 | 0.953 | 0.969 | 0.979 | 0.986 | 0.991 | 0.994 | 0.996 | 0.997 | 0.998 | 0.999 |
| 0.898499999999956 | 0.898 | 0.931 | 0.954 | 0.969 | 0.979 | 0.986 | 0.991 | 0.994 | 0.996 | 0.997 | 0.998 | 0.999 |
| 0.898999999999956 | 0.899 | 0.931 | 0.954 | 0.969 | 0.979 | 0.986 | 0.991 | 0.994 | 0.996 | 0.997 | 0.998 | 0.999 |
| 0.899499999999956 | 0.899 | 0.932 | 0.954 | 0.969 | 0.979 | 0.986 | 0.991 | 0.994 | 0.996 | 0.997 | 0.998 | 0.999 |
| 0.899999999999956 | 0.9 | 0.932 | 0.954 | 0.969 | 0.979 | 0.986 | 0.991 | 0.994 | 0.996 | 0.997 | 0.998 | 0.999 |
| 0.900499999999956 | 0.9 | 0.933 | 0.954 | 0.969 | 0.98 | 0.986 | 0.991 | 0.994 | 0.996 | 0.997 | 0.998 | 0.999 |
| 0.900999999999956 | 0.901 | 0.933 | 0.955 | 0.97 | 0.98 | 0.986 | 0.991 | 0.994 | 0.996 | 0.997 | 0.998 | 0.999 |
| 0.901499999999956 | 0.901 | 0.933 | 0.955 | 0.97 | 0.98 | 0.986 | 0.991 | 0.994 | 0.996 | 0.997 | 0.998 | 0.999 |
| 0.901999999999956 | 0.902 | 0.934 | 0.955 | 0.97 | 0.98 | 0.987 | 0.991 | 0.994 | 0.996 | 0.997 | 0.998 | 0.999 |
| 0.902499999999956 | 0.902 | 0.934 | 0.955 | 0.97 | 0.98 | 0.987 | 0.991 | 0.994 | 0.996 | 0.997 | 0.998 | 0.999 |
| 0.902999999999956 | 0.903 | 0.934 | 0.956 | 0.97 | 0.98 | 0.987 | 0.991 | 0.994 | 0.996 | 0.997 | 0.998 | 0.999 |
| 0.903499999999956 | 0.903 | 0.935 | 0.956 | 0.97 | 0.98 | 0.987 | 0.991 | 0.994 | 0.996 | 0.997 | 0.998 | 0.999 |
| 0.903999999999956 | 0.904 | 0.935 | 0.956 | 0.971 | 0.98 | 0.987 | 0.991 | 0.994 | 0.996 | 0.997 | 0.998 | 0.999 |
| 0.904499999999956 | 0.904 | 0.935 | 0.956 | 0.971 | 0.98 | 0.987 | 0.991 | 0.994 | 0.996 | 0.997 | 0.998 | 0.999 |
| 0.904999999999956 | 0.905 | 0.936 | 0.957 | 0.971 | 0.98 | 0.987 | 0.991 | 0.994 | 0.996 | 0.997 | 0.998 | 0.999 |
| 0.905499999999956 | 0.905 | 0.936 | 0.957 | 0.971 | 0.981 | 0.987 | 0.991 | 0.994 | 0.996 | 0.997 | 0.998 | 0.999 |
| 0.905999999999956 | 0.906 | 0.936 | 0.957 | 0.971 | 0.981 | 0.987 | 0.991 | 0.994 | 0.996 | 0.997 | 0.998 | 0.999 |
| 0.906499999999956 | 0.906 | 0.937 | 0.957 | 0.971 | 0.981 | 0.987 | 0.991 | 0.994 | 0.996 | 0.997 | 0.998 | 0.999 |
| 0.906999999999955 | 0.907 | 0.937 | 0.958 | 0.971 | 0.981 | 0.987 | 0.991 | 0.994 | 0.996 | 0.997 | 0.998 | 0.999 |
| 0.907499999999955 | 0.907 | 0.937 | 0.958 | 0.972 | 0.981 | 0.987 | 0.992 | 0.994 | 0.996 | 0.997 | 0.998 | 0.999 |
| 0.907999999999955 | 0.908 | 0.938 | 0.958 | 0.972 | 0.981 | 0.987 | 0.992 | 0.994 | 0.996 | 0.997 | 0.998 | 0.999 |
| 0.908499999999955 | 0.908 | 0.938 | 0.958 | 0.972 | 0.981 | 0.987 | 0.992 | 0.994 | 0.996 | 0.998 | 0.998 | 0.999 |
| 0.908999999999955 | 0.909 | 0.938 | 0.958 | 0.972 | 0.981 | 0.988 | 0.992 | 0.994 | 0.996 | 0.998 | 0.998 | 0.999 |
| 0.909499999999955 | 0.909 | 0.939 | 0.959 | 0.972 | 0.981 | 0.988 | 0.992 | 0.994 | 0.996 | 0.998 | 0.998 | 0.999 |
| 0.909999999999955 | 0.91 | 0.939 | 0.959 | 0.972 | 0.982 | 0.988 | 0.992 | 0.994 | 0.996 | 0.998 | 0.998 | 0.999 |
| 0.910499999999955 | 0.91 | 0.939 | 0.959 | 0.973 | 0.982 | 0.988 | 0.992 | 0.995 | 0.996 | 0.998 | 0.998 | 0.999 |
| 0.910999999999955 | 0.911 | 0.94 | 0.959 | 0.973 | 0.982 | 0.988 | 0.992 | 0.995 | 0.996 | 0.998 | 0.998 | 0.999 |
| 0.911499999999955 | 0.911 | 0.94 | 0.96 | 0.973 | 0.982 | 0.988 | 0.992 | 0.995 | 0.996 | 0.998 | 0.998 | 0.999 |
| 0.911999999999955 | 0.912 | 0.94 | 0.96 | 0.973 | 0.982 | 0.988 | 0.992 | 0.995 | 0.996 | 0.998 | 0.998 | 0.999 |
| 0.912499999999955 | 0.912 | 0.941 | 0.96 | 0.973 | 0.982 | 0.988 | 0.992 | 0.995 | 0.996 | 0.998 | 0.998 | 0.999 |
| 0.912999999999955 | 0.913 | 0.941 | 0.96 | 0.973 | 0.982 | 0.988 | 0.992 | 0.995 | 0.996 | 0.998 | 0.998 | 0.999 |
| 0.913499999999955 | 0.913 | 0.941 | 0.961 | 0.974 | 0.982 | 0.988 | 0.992 | 0.995 | 0.996 | 0.998 | 0.998 | 0.999 |
| 0.913999999999955 | 0.914 | 0.942 | 0.961 | 0.974 | 0.982 | 0.988 | 0.992 | 0.995 | 0.996 | 0.998 | 0.998 | 0.999 |
| 0.914499999999955 | 0.914 | 0.942 | 0.961 | 0.974 | 0.983 | 0.988 | 0.992 | 0.995 | 0.997 | 0.998 | 0.998 | 0.999 |
| 0.914999999999955 | 0.915 | 0.942 | 0.961 | 0.974 | 0.983 | 0.988 | 0.992 | 0.995 | 0.997 | 0.998 | 0.998 | 0.999 |
| 0.915499999999955 | 0.915 | 0.943 | 0.962 | 0.974 | 0.983 | 0.988 | 0.992 | 0.995 | 0.997 | 0.998 | 0.998 | 0.999 |
| 0.915999999999954 | 0.916 | 0.943 | 0.962 | 0.974 | 0.983 | 0.989 | 0.992 | 0.995 | 0.997 | 0.998 | 0.998 | 0.999 |
| 0.916499999999954 | 0.916 | 0.944 | 0.962 | 0.974 | 0.983 | 0.989 | 0.992 | 0.995 | 0.997 | 0.998 | 0.998 | 0.999 |
| 0.916999999999954 | 0.917 | 0.944 | 0.962 | 0.975 | 0.983 | 0.989 | 0.992 | 0.995 | 0.997 | 0.998 | 0.998 | 0.999 |
| 0.917499999999954 | 0.917 | 0.944 | 0.962 | 0.975 | 0.983 | 0.989 | 0.992 | 0.995 | 0.997 | 0.998 | 0.999 | 0.999 |
| 0.917999999999954 | 0.918 | 0.945 | 0.963 | 0.975 | 0.983 | 0.989 | 0.993 | 0.995 | 0.997 | 0.998 | 0.999 | 0.999 |
| 0.918499999999954 | 0.918 | 0.945 | 0.963 | 0.975 | 0.983 | 0.989 | 0.993 | 0.995 | 0.997 | 0.998 | 0.999 | 0.999 |
| 0.918999999999954 | 0.919 | 0.945 | 0.963 | 0.975 | 0.983 | 0.989 | 0.993 | 0.995 | 0.997 | 0.998 | 0.999 | 0.999 |
| 0.919499999999954 | 0.919 | 0.946 | 0.963 | 0.975 | 0.984 | 0.989 | 0.993 | 0.995 | 0.997 | 0.998 | 0.999 | 0.999 |
| 0.919999999999954 | 0.92 | 0.946 | 0.964 | 0.976 | 0.984 | 0.989 | 0.993 | 0.995 | 0.997 | 0.998 | 0.999 | 0.999 |
| 0.920499999999954 | 0.92 | 0.946 | 0.964 | 0.976 | 0.984 | 0.989 | 0.993 | 0.995 | 0.997 | 0.998 | 0.999 | 0.999 |
| 0.920999999999954 | 0.921 | 0.947 | 0.964 | 0.976 | 0.984 | 0.989 | 0.993 | 0.995 | 0.997 | 0.998 | 0.999 | 0.999 |
| 0.921499999999954 | 0.921 | 0.947 | 0.964 | 0.976 | 0.984 | 0.989 | 0.993 | 0.995 | 0.997 | 0.998 | 0.999 | 0.999 |
| 0.921999999999954 | 0.922 | 0.947 | 0.965 | 0.976 | 0.984 | 0.989 | 0.993 | 0.995 | 0.997 | 0.998 | 0.999 | 0.999 |
| 0.922499999999954 | 0.922 | 0.948 | 0.965 | 0.976 | 0.984 | 0.989 | 0.993 | 0.995 | 0.997 | 0.998 | 0.999 | 0.999 |
| 0.922999999999954 | 0.923 | 0.948 | 0.965 | 0.977 | 0.984 | 0.99 | 0.993 | 0.995 | 0.997 | 0.998 | 0.999 | 0.999 |
| 0.923499999999954 | 0.923 | 0.948 | 0.965 | 0.977 | 0.984 | 0.99 | 0.993 | 0.995 | 0.997 | 0.998 | 0.999 | 0.999 |
| 0.923999999999954 | 0.924 | 0.949 | 0.965 | 0.977 | 0.985 | 0.99 | 0.993 | 0.995 | 0.997 | 0.998 | 0.999 | 0.999 |
| 0.924499999999954 | 0.924 | 0.949 | 0.966 | 0.977 | 0.985 | 0.99 | 0.993 | 0.995 | 0.997 | 0.998 | 0.999 | 0.999 |
| 0.924999999999953 | 0.925 | 0.949 | 0.966 | 0.977 | 0.985 | 0.99 | 0.993 | 0.995 | 0.997 | 0.998 | 0.999 | 0.999 |
| 0.925499999999953 | 0.925 | 0.95 | 0.966 | 0.977 | 0.985 | 0.99 | 0.993 | 0.995 | 0.997 | 0.998 | 0.999 | 0.999 |
| 0.925999999999953 | 0.926 | 0.95 | 0.966 | 0.977 | 0.985 | 0.99 | 0.993 | 0.996 | 0.997 | 0.998 | 0.999 | 0.999 |
| 0.926499999999953 | 0.926 | 0.95 | 0.967 | 0.978 | 0.985 | 0.99 | 0.993 | 0.996 | 0.997 | 0.998 | 0.999 | 0.999 |
| 0.926999999999953 | 0.927 | 0.951 | 0.967 | 0.978 | 0.985 | 0.99 | 0.993 | 0.996 | 0.997 | 0.998 | 0.999 | 0.999 |
| 0.927499999999953 | 0.927 | 0.951 | 0.967 | 0.978 | 0.985 | 0.99 | 0.993 | 0.996 | 0.997 | 0.998 | 0.999 | 0.999 |
| 0.927999999999953 | 0.928 | 0.951 | 0.967 | 0.978 | 0.985 | 0.99 | 0.993 | 0.996 | 0.997 | 0.998 | 0.999 | 0.999 |
| 0.928499999999953 | 0.928 | 0.952 | 0.968 | 0.978 | 0.985 | 0.99 | 0.994 | 0.996 | 0.997 | 0.998 | 0.999 | 0.999 |
| 0.928999999999953 | 0.929 | 0.952 | 0.968 | 0.978 | 0.986 | 0.99 | 0.994 | 0.996 | 0.997 | 0.998 | 0.999 | 0.999 |
| 0.929499999999953 | 0.929 | 0.952 | 0.968 | 0.979 | 0.986 | 0.99 | 0.994 | 0.996 | 0.997 | 0.998 | 0.999 | 0.999 |
| 0.929999999999953 | 0.93 | 0.953 | 0.968 | 0.979 | 0.986 | 0.99 | 0.994 | 0.996 | 0.997 | 0.998 | 0.999 | 0.999 |
| 0.930499999999953 | 0.93 | 0.953 | 0.968 | 0.979 | 0.986 | 0.991 | 0.994 | 0.996 | 0.997 | 0.998 | 0.999 | 0.999 |
| 0.930999999999953 | 0.931 | 0.953 | 0.969 | 0.979 | 0.986 | 0.991 | 0.994 | 0.996 | 0.997 | 0.998 | 0.999 | 0.999 |
| 0.931499999999953 | 0.931 | 0.954 | 0.969 | 0.979 | 0.986 | 0.991 | 0.994 | 0.996 | 0.997 | 0.998 | 0.999 | 0.999 |
| 0.931999999999953 | 0.932 | 0.954 | 0.969 | 0.979 | 0.986 | 0.991 | 0.994 | 0.996 | 0.997 | 0.998 | 0.999 | 0.999 |
| 0.932499999999953 | 0.932 | 0.954 | 0.969 | 0.98 | 0.986 | 0.991 | 0.994 | 0.996 | 0.997 | 0.998 | 0.999 | 0.999 |
| 0.932999999999953 | 0.933 | 0.955 | 0.97 | 0.98 | 0.986 | 0.991 | 0.994 | 0.996 | 0.997 | 0.998 | 0.999 | 0.999 |
| 0.933499999999953 | 0.933 | 0.955 | 0.97 | 0.98 | 0.986 | 0.991 | 0.994 | 0.996 | 0.997 | 0.998 | 0.999 | 0.999 |
| 0.933999999999953 | 0.934 | 0.956 | 0.97 | 0.98 | 0.987 | 0.991 | 0.994 | 0.996 | 0.997 | 0.998 | 0.999 | 0.999 |
| 0.934499999999952 | 0.934 | 0.956 | 0.97 | 0.98 | 0.987 | 0.991 | 0.994 | 0.996 | 0.997 | 0.998 | 0.999 | 0.999 |
| 0.934999999999952 | 0.935 | 0.956 | 0.971 | 0.98 | 0.987 | 0.991 | 0.994 | 0.996 | 0.997 | 0.998 | 0.999 | 0.999 |
| 0.935499999999952 | 0.935 | 0.957 | 0.971 | 0.98 | 0.987 | 0.991 | 0.994 | 0.996 | 0.997 | 0.998 | 0.999 | 0.999 |
| 0.935999999999952 | 0.936 | 0.957 | 0.971 | 0.981 | 0.987 | 0.991 | 0.994 | 0.996 | 0.997 | 0.998 | 0.999 | 0.999 |
| 0.936499999999952 | 0.936 | 0.957 | 0.971 | 0.981 | 0.987 | 0.991 | 0.994 | 0.996 | 0.997 | 0.998 | 0.999 | 0.999 |
| 0.936999999999952 | 0.937 | 0.958 | 0.971 | 0.981 | 0.987 | 0.991 | 0.994 | 0.996 | 0.997 | 0.998 | 0.999 | 0.999 |
| 0.937499999999952 | 0.937 | 0.958 | 0.972 | 0.981 | 0.987 | 0.992 | 0.994 | 0.996 | 0.997 | 0.998 | 0.999 | 0.999 |
| 0.937999999999952 | 0.938 | 0.958 | 0.972 | 0.981 | 0.987 | 0.992 | 0.994 | 0.996 | 0.998 | 0.998 | 0.999 | 0.999 |
| 0.938499999999952 | 0.938 | 0.959 | 0.972 | 0.981 | 0.988 | 0.992 | 0.994 | 0.996 | 0.998 | 0.998 | 0.999 | 0.999 |
| 0.938999999999952 | 0.939 | 0.959 | 0.972 | 0.982 | 0.988 | 0.992 | 0.994 | 0.996 | 0.998 | 0.998 | 0.999 | 0.999 |
| 0.939499999999952 | 0.939 | 0.959 | 0.973 | 0.982 | 0.988 | 0.992 | 0.995 | 0.996 | 0.998 | 0.998 | 0.999 | 0.999 |
| 0.939999999999952 | 0.94 | 0.96 | 0.973 | 0.982 | 0.988 | 0.992 | 0.995 | 0.996 | 0.998 | 0.998 | 0.999 | 0.999 |
| 0.940499999999952 | 0.94 | 0.96 | 0.973 | 0.982 | 0.988 | 0.992 | 0.995 | 0.996 | 0.998 | 0.998 | 0.999 | 0.999 |
| 0.940999999999952 | 0.941 | 0.96 | 0.973 | 0.982 | 0.988 | 0.992 | 0.995 | 0.996 | 0.998 | 0.998 | 0.999 | 0.999 |
| 0.941499999999952 | 0.941 | 0.961 | 0.974 | 0.982 | 0.988 | 0.992 | 0.995 | 0.996 | 0.998 | 0.998 | 0.999 | 0.999 |
| 0.941999999999952 | 0.942 | 0.961 | 0.974 | 0.982 | 0.988 | 0.992 | 0.995 | 0.997 | 0.998 | 0.998 | 0.999 | 0.999 |
| 0.942499999999952 | 0.942 | 0.961 | 0.974 | 0.983 | 0.988 | 0.992 | 0.995 | 0.997 | 0.998 | 0.998 | 0.999 | 0.999 |
| 0.942999999999952 | 0.943 | 0.962 | 0.974 | 0.983 | 0.988 | 0.992 | 0.995 | 0.997 | 0.998 | 0.998 | 0.999 | 0.999 |
| 0.943499999999951 | 0.943 | 0.962 | 0.974 | 0.983 | 0.989 | 0.992 | 0.995 | 0.997 | 0.998 | 0.998 | 0.999 | 0.999 |
| 0.943999999999951 | 0.944 | 0.962 | 0.975 | 0.983 | 0.989 | 0.992 | 0.995 | 0.997 | 0.998 | 0.999 | 0.999 | 0.999 |
| 0.944499999999951 | 0.944 | 0.963 | 0.975 | 0.983 | 0.989 | 0.993 | 0.995 | 0.997 | 0.998 | 0.999 | 0.999 | 0.999 |
| 0.944999999999951 | 0.945 | 0.963 | 0.975 | 0.983 | 0.989 | 0.993 | 0.995 | 0.997 | 0.998 | 0.999 | 0.999 | 0.999 |
| 0.945499999999951 | 0.945 | 0.963 | 0.975 | 0.984 | 0.989 | 0.993 | 0.995 | 0.997 | 0.998 | 0.999 | 0.999 | 0.999 |
| 0.945999999999951 | 0.946 | 0.964 | 0.976 | 0.984 | 0.989 | 0.993 | 0.995 | 0.997 | 0.998 | 0.999 | 0.999 | 0.999 |
| 0.946499999999951 | 0.946 | 0.964 | 0.976 | 0.984 | 0.989 | 0.993 | 0.995 | 0.997 | 0.998 | 0.999 | 0.999 | 0.999 |
| 0.946999999999951 | 0.947 | 0.964 | 0.976 | 0.984 | 0.989 | 0.993 | 0.995 | 0.997 | 0.998 | 0.999 | 0.999 | 0.999 |
| 0.947499999999951 | 0.947 | 0.965 | 0.976 | 0.984 | 0.989 | 0.993 | 0.995 | 0.997 | 0.998 | 0.999 | 0.999 | 0.999 |
| 0.947999999999951 | 0.948 | 0.965 | 0.977 | 0.984 | 0.99 | 0.993 | 0.995 | 0.997 | 0.998 | 0.999 | 0.999 | 0.999 |
| 0.948499999999951 | 0.948 | 0.965 | 0.977 | 0.984 | 0.99 | 0.993 | 0.995 | 0.997 | 0.998 | 0.999 | 0.999 | 0.999 |
| 0.948999999999951 | 0.949 | 0.966 | 0.977 | 0.985 | 0.99 | 0.993 | 0.995 | 0.997 | 0.998 | 0.999 | 0.999 | 0.999 |
| 0.949499999999951 | 0.949 | 0.966 | 0.977 | 0.985 | 0.99 | 0.993 | 0.995 | 0.997 | 0.998 | 0.999 | 0.999 | 0.999 |
| 0.949999999999951 | 0.95 | 0.966 | 0.977 | 0.985 | 0.99 | 0.993 | 0.996 | 0.997 | 0.998 | 0.999 | 0.999 | 0.999 |
| 0.950499999999951 | 0.95 | 0.967 | 0.978 | 0.985 | 0.99 | 0.993 | 0.996 | 0.997 | 0.998 | 0.999 | 0.999 | 0.999 |
| 0.950999999999951 | 0.951 | 0.967 | 0.978 | 0.985 | 0.99 | 0.993 | 0.996 | 0.997 | 0.998 | 0.999 | 0.999 | 0.999 |
| 0.951499999999951 | 0.951 | 0.967 | 0.978 | 0.985 | 0.99 | 0.993 | 0.996 | 0.997 | 0.998 | 0.999 | 0.999 | 0.999 |
| 0.951999999999951 | 0.952 | 0.968 | 0.978 | 0.986 | 0.99 | 0.994 | 0.996 | 0.997 | 0.998 | 0.999 | 0.999 | 0.999 |
| 0.95249999999995 | 0.952 | 0.968 | 0.979 | 0.986 | 0.99 | 0.994 | 0.996 | 0.997 | 0.998 | 0.999 | 0.999 | 0.999 |
| 0.95299999999995 | 0.953 | 0.968 | 0.979 | 0.986 | 0.991 | 0.994 | 0.996 | 0.997 | 0.998 | 0.999 | 0.999 | 0.999 |
| 0.95349999999995 | 0.953 | 0.969 | 0.979 | 0.986 | 0.991 | 0.994 | 0.996 | 0.997 | 0.998 | 0.999 | 0.999 | 0.999 |
| 0.95399999999995 | 0.954 | 0.969 | 0.979 | 0.986 | 0.991 | 0.994 | 0.996 | 0.997 | 0.998 | 0.999 | 0.999 | 0.999 |
| 0.95449999999995 | 0.954 | 0.969 | 0.98 | 0.986 | 0.991 | 0.994 | 0.996 | 0.997 | 0.998 | 0.999 | 0.999 | 0.999 |
| 0.95499999999995 | 0.955 | 0.97 | 0.98 | 0.986 | 0.991 | 0.994 | 0.996 | 0.997 | 0.998 | 0.999 | 0.999 | 0.999 |
| 0.95549999999995 | 0.955 | 0.97 | 0.98 | 0.987 | 0.991 | 0.994 | 0.996 | 0.997 | 0.998 | 0.999 | 0.999 | 0.999 |
| 0.95599999999995 | 0.956 | 0.97 | 0.98 | 0.987 | 0.991 | 0.994 | 0.996 | 0.997 | 0.998 | 0.999 | 0.999 | 0.999 |
| 0.95649999999995 | 0.956 | 0.971 | 0.98 | 0.987 | 0.991 | 0.994 | 0.996 | 0.997 | 0.998 | 0.999 | 0.999 | 0.999 |
| 0.95699999999995 | 0.957 | 0.971 | 0.981 | 0.987 | 0.991 | 0.994 | 0.996 | 0.997 | 0.998 | 0.999 | 0.999 | 0.999 |
| 0.95749999999995 | 0.957 | 0.971 | 0.981 | 0.987 | 0.991 | 0.994 | 0.996 | 0.997 | 0.998 | 0.999 | 0.999 | 0.999 |
| 0.95799999999995 | 0.958 | 0.972 | 0.981 | 0.987 | 0.992 | 0.994 | 0.996 | 0.997 | 0.998 | 0.999 | 0.999 | 1 |
| 0.95849999999995 | 0.958 | 0.972 | 0.981 | 0.988 | 0.992 | 0.994 | 0.996 | 0.998 | 0.998 | 0.999 | 0.999 | 1 |
| 0.95899999999995 | 0.959 | 0.972 | 0.982 | 0.988 | 0.992 | 0.995 | 0.996 | 0.998 | 0.998 | 0.999 | 0.999 | 1 |
| 0.95949999999995 | 0.959 | 0.973 | 0.982 | 0.988 | 0.992 | 0.995 | 0.996 | 0.998 | 0.998 | 0.999 | 0.999 | 1 |
| 0.95999999999995 | 0.96 | 0.973 | 0.982 | 0.988 | 0.992 | 0.995 | 0.996 | 0.998 | 0.998 | 0.999 | 0.999 | 1 |
| 0.96049999999995 | 0.96 | 0.973 | 0.982 | 0.988 | 0.992 | 0.995 | 0.996 | 0.998 | 0.998 | 0.999 | 0.999 | 1 |
| 0.96099999999995 | 0.961 | 0.974 | 0.982 | 0.988 | 0.992 | 0.995 | 0.997 | 0.998 | 0.998 | 0.999 | 0.999 | 1 |
| 0.961499999999949 | 0.961 | 0.974 | 0.983 | 0.988 | 0.992 | 0.995 | 0.997 | 0.998 | 0.998 | 0.999 | 0.999 | 1 |
| 0.961999999999949 | 0.962 | 0.975 | 0.983 | 0.989 | 0.992 | 0.995 | 0.997 | 0.998 | 0.998 | 0.999 | 0.999 | 1 |
| 0.962499999999949 | 0.962 | 0.975 | 0.983 | 0.989 | 0.992 | 0.995 | 0.997 | 0.998 | 0.999 | 0.999 | 0.999 | 1 |
| 0.962999999999949 | 0.963 | 0.975 | 0.983 | 0.989 | 0.993 | 0.995 | 0.997 | 0.998 | 0.999 | 0.999 | 0.999 | 1 |
| 0.963499999999949 | 0.963 | 0.976 | 0.984 | 0.989 | 0.993 | 0.995 | 0.997 | 0.998 | 0.999 | 0.999 | 0.999 | 1 |
| 0.963999999999949 | 0.964 | 0.976 | 0.984 | 0.989 | 0.993 | 0.995 | 0.997 | 0.998 | 0.999 | 0.999 | 0.999 | 1 |
| 0.964499999999949 | 0.964 | 0.976 | 0.984 | 0.989 | 0.993 | 0.995 | 0.997 | 0.998 | 0.999 | 0.999 | 0.999 | 1 |
| 0.964999999999949 | 0.965 | 0.977 | 0.984 | 0.989 | 0.993 | 0.995 | 0.997 | 0.998 | 0.999 | 0.999 | 0.999 | 1 |
| 0.965499999999949 | 0.965 | 0.977 | 0.985 | 0.99 | 0.993 | 0.995 | 0.997 | 0.998 | 0.999 | 0.999 | 0.999 | 1 |
| 0.965999999999949 | 0.966 | 0.977 | 0.985 | 0.99 | 0.993 | 0.995 | 0.997 | 0.998 | 0.999 | 0.999 | 0.999 | 1 |
| 0.966499999999949 | 0.966 | 0.978 | 0.985 | 0.99 | 0.993 | 0.996 | 0.997 | 0.998 | 0.999 | 0.999 | 0.999 | 1 |
| 0.966999999999949 | 0.967 | 0.978 | 0.985 | 0.99 | 0.993 | 0.996 | 0.997 | 0.998 | 0.999 | 0.999 | 0.999 | 1 |
| 0.967499999999949 | 0.967 | 0.978 | 0.985 | 0.99 | 0.993 | 0.996 | 0.997 | 0.998 | 0.999 | 0.999 | 0.999 | 1 |
| 0.967999999999949 | 0.968 | 0.979 | 0.986 | 0.99 | 0.994 | 0.996 | 0.997 | 0.998 | 0.999 | 0.999 | 0.999 | 1 |
| 0.968499999999949 | 0.968 | 0.979 | 0.986 | 0.991 | 0.994 | 0.996 | 0.997 | 0.998 | 0.999 | 0.999 | 0.999 | 1 |
| 0.968999999999949 | 0.969 | 0.979 | 0.986 | 0.991 | 0.994 | 0.996 | 0.997 | 0.998 | 0.999 | 0.999 | 0.999 | 1 |
| 0.969499999999949 | 0.969 | 0.98 | 0.986 | 0.991 | 0.994 | 0.996 | 0.997 | 0.998 | 0.999 | 0.999 | 0.999 | 1 |
| 0.969999999999949 | 0.97 | 0.98 | 0.987 | 0.991 | 0.994 | 0.996 | 0.997 | 0.998 | 0.999 | 0.999 | 0.999 | 1 |
| 0.970499999999948 | 0.97 | 0.98 | 0.987 | 0.991 | 0.994 | 0.996 | 0.997 | 0.998 | 0.999 | 0.999 | 0.999 | 1 |
| 0.970999999999948 | 0.971 | 0.981 | 0.987 | 0.991 | 0.994 | 0.996 | 0.997 | 0.998 | 0.999 | 0.999 | 0.999 | 1 |
| 0.971499999999948 | 0.971 | 0.981 | 0.987 | 0.991 | 0.994 | 0.996 | 0.997 | 0.998 | 0.999 | 0.999 | 0.999 | 1 |
| 0.971999999999948 | 0.972 | 0.981 | 0.987 | 0.992 | 0.994 | 0.996 | 0.998 | 0.998 | 0.999 | 0.999 | 1 | 1 |
| 0.972499999999948 | 0.972 | 0.982 | 0.988 | 0.992 | 0.995 | 0.996 | 0.998 | 0.998 | 0.999 | 0.999 | 1 | 1 |
| 0.972999999999948 | 0.973 | 0.982 | 0.988 | 0.992 | 0.995 | 0.996 | 0.998 | 0.998 | 0.999 | 0.999 | 1 | 1 |
| 0.973499999999948 | 0.973 | 0.982 | 0.988 | 0.992 | 0.995 | 0.996 | 0.998 | 0.998 | 0.999 | 0.999 | 1 | 1 |
| 0.973999999999948 | 0.974 | 0.983 | 0.988 | 0.992 | 0.995 | 0.997 | 0.998 | 0.998 | 0.999 | 0.999 | 1 | 1 |
| 0.974499999999948 | 0.974 | 0.983 | 0.989 | 0.992 | 0.995 | 0.997 | 0.998 | 0.998 | 0.999 | 0.999 | 1 | 1 |
| 0.974999999999948 | 0.975 | 0.983 | 0.989 | 0.993 | 0.995 | 0.997 | 0.998 | 0.999 | 0.999 | 0.999 | 1 | 1 |
| 0.975499999999948 | 0.975 | 0.984 | 0.989 | 0.993 | 0.995 | 0.997 | 0.998 | 0.999 | 0.999 | 0.999 | 1 | 1 |
| 0.975999999999948 | 0.976 | 0.984 | 0.989 | 0.993 | 0.995 | 0.997 | 0.998 | 0.999 | 0.999 | 0.999 | 1 | 1 |
| 0.976499999999948 | 0.976 | 0.984 | 0.989 | 0.993 | 0.995 | 0.997 | 0.998 | 0.999 | 0.999 | 0.999 | 1 | 1 |
| 0.976999999999948 | 0.977 | 0.985 | 0.99 | 0.993 | 0.995 | 0.997 | 0.998 | 0.999 | 0.999 | 0.999 | 1 | 1 |
| 0.977499999999948 | 0.977 | 0.985 | 0.99 | 0.993 | 0.996 | 0.997 | 0.998 | 0.999 | 0.999 | 0.999 | 1 | 1 |
| 0.977999999999948 | 0.978 | 0.985 | 0.99 | 0.993 | 0.996 | 0.997 | 0.998 | 0.999 | 0.999 | 0.999 | 1 | 1 |
| 0.978499999999948 | 0.978 | 0.986 | 0.99 | 0.994 | 0.996 | 0.997 | 0.998 | 0.999 | 0.999 | 0.999 | 1 | 1 |
| 0.978999999999948 | 0.979 | 0.986 | 0.991 | 0.994 | 0.996 | 0.997 | 0.998 | 0.999 | 0.999 | 0.999 | 1 | 1 |
| 0.979499999999947 | 0.979 | 0.986 | 0.991 | 0.994 | 0.996 | 0.997 | 0.998 | 0.999 | 0.999 | 0.999 | 1 | 1 |
| 0.979999999999947 | 0.98 | 0.987 | 0.991 | 0.994 | 0.996 | 0.997 | 0.998 | 0.999 | 0.999 | 0.999 | 1 | 1 |
| 0.980499999999947 | 0.98 | 0.987 | 0.991 | 0.994 | 0.996 | 0.997 | 0.998 | 0.999 | 0.999 | 0.999 | 1 | 1 |
| 0.980999999999947 | 0.981 | 0.987 | 0.992 | 0.994 | 0.996 | 0.997 | 0.998 | 0.999 | 0.999 | 1 | 1 | 1 |
| 0.981499999999947 | 0.981 | 0.988 | 0.992 | 0.994 | 0.996 | 0.998 | 0.998 | 0.999 | 0.999 | 1 | 1 | 1 |
| 0.981999999999947 | 0.982 | 0.988 | 0.992 | 0.995 | 0.996 | 0.998 | 0.998 | 0.999 | 0.999 | 1 | 1 | 1 |
| 0.982499999999947 | 0.982 | 0.988 | 0.992 | 0.995 | 0.997 | 0.998 | 0.998 | 0.999 | 0.999 | 1 | 1 | 1 |
| 0.982999999999947 | 0.983 | 0.989 | 0.992 | 0.995 | 0.997 | 0.998 | 0.998 | 0.999 | 0.999 | 1 | 1 | 1 |
| 0.983499999999947 | 0.983 | 0.989 | 0.993 | 0.995 | 0.997 | 0.998 | 0.999 | 0.999 | 0.999 | 1 | 1 | 1 |
| 0.983999999999947 | 0.984 | 0.989 | 0.993 | 0.995 | 0.997 | 0.998 | 0.999 | 0.999 | 0.999 | 1 | 1 | 1 |
| 0.984499999999947 | 0.984 | 0.99 | 0.993 | 0.995 | 0.997 | 0.998 | 0.999 | 0.999 | 0.999 | 1 | 1 | 1 |
| 0.984999999999947 | 0.985 | 0.99 | 0.993 | 0.996 | 0.997 | 0.998 | 0.999 | 0.999 | 0.999 | 1 | 1 | 1 |
| 0.985499999999947 | 0.985 | 0.99 | 0.994 | 0.996 | 0.997 | 0.998 | 0.999 | 0.999 | 0.999 | 1 | 1 | 1 |
| 0.985999999999947 | 0.986 | 0.991 | 0.994 | 0.996 | 0.997 | 0.998 | 0.999 | 0.999 | 0.999 | 1 | 1 | 1 |
| 0.986499999999947 | 0.986 | 0.991 | 0.994 | 0.996 | 0.997 | 0.998 | 0.999 | 0.999 | 0.999 | 1 | 1 | 1 |
| 0.986999999999947 | 0.987 | 0.991 | 0.994 | 0.996 | 0.997 | 0.998 | 0.999 | 0.999 | 0.999 | 1 | 1 | 1 |
| 0.987499999999947 | 0.987 | 0.992 | 0.994 | 0.996 | 0.998 | 0.998 | 0.999 | 0.999 | 1 | 1 | 1 | 1 |
| 0.987999999999947 | 0.988 | 0.992 | 0.995 | 0.996 | 0.998 | 0.998 | 0.999 | 0.999 | 1 | 1 | 1 | 1 |
| 0.988499999999946 | 0.988 | 0.992 | 0.995 | 0.997 | 0.998 | 0.998 | 0.999 | 0.999 | 1 | 1 | 1 | 1 |
| 0.988999999999946 | 0.989 | 0.993 | 0.995 | 0.997 | 0.998 | 0.999 | 0.999 | 0.999 | 1 | 1 | 1 | 1 |
| 0.989499999999946 | 0.989 | 0.993 | 0.995 | 0.997 | 0.998 | 0.999 | 0.999 | 0.999 | 1 | 1 | 1 | 1 |
| 0.989999999999946 | 0.99 | 0.993 | 0.996 | 0.997 | 0.998 | 0.999 | 0.999 | 0.999 | 1 | 1 | 1 | 1 |
| 0.990499999999946 | 0.99 | 0.994 | 0.996 | 0.997 | 0.998 | 0.999 | 0.999 | 0.999 | 1 | 1 | 1 | 1 |
| 0.990999999999946 | 0.991 | 0.994 | 0.996 | 0.997 | 0.998 | 0.999 | 0.999 | 0.999 | 1 | 1 | 1 | 1 |
| 0.991499999999946 | 0.991 | 0.994 | 0.996 | 0.997 | 0.998 | 0.999 | 0.999 | 1 | 1 | 1 | 1 | 1 |
| 0.991999999999946 | 0.992 | 0.995 | 0.996 | 0.998 | 0.998 | 0.999 | 0.999 | 1 | 1 | 1 | 1 | 1 |
| 0.992499999999946 | 0.992 | 0.995 | 0.997 | 0.998 | 0.999 | 0.999 | 0.999 | 1 | 1 | 1 | 1 | 1 |
| 0.992999999999946 | 0.993 | 0.995 | 0.997 | 0.998 | 0.999 | 0.999 | 0.999 | 1 | 1 | 1 | 1 | 1 |
| 0.993499999999946 | 0.993 | 0.996 | 0.997 | 0.998 | 0.999 | 0.999 | 0.999 | 1 | 1 | 1 | 1 | 1 |
| 0.993999999999946 | 0.994 | 0.996 | 0.997 | 0.998 | 0.999 | 0.999 | 0.999 | 1 | 1 | 1 | 1 | 1 |
| 0.994499999999946 | 0.994 | 0.996 | 0.998 | 0.998 | 0.999 | 0.999 | 1 | 1 | 1 | 1 | 1 | 1 |
| 0.994999999999946 | 0.995 | 0.997 | 0.998 | 0.999 | 0.999 | 0.999 | 1 | 1 | 1 | 1 | 1 | 1 |
| 0.995499999999946 | 0.995 | 0.997 | 0.998 | 0.999 | 0.999 | 0.999 | 1 | 1 | 1 | 1 | 1 | 1 |
| 0.995999999999946 | 0.996 | 0.997 | 0.998 | 0.999 | 0.999 | 0.999 | 1 | 1 | 1 | 1 | 1 | 1 |
| 0.996499999999946 | 0.996 | 0.998 | 0.998 | 0.999 | 0.999 | 1 | 1 | 1 | 1 | 1 | 1 | 1 |
| 0.996999999999946 | 0.997 | 0.998 | 0.999 | 0.999 | 0.999 | 1 | 1 | 1 | 1 | 1 | 1 | 1 |
| 0.997499999999945 | 0.997 | 0.998 | 0.999 | 0.999 | 1 | 1 | 1 | 1 | 1 | 1 | 1 | 1 |
| 0.997999999999945 | 0.998 | 0.999 | 0.999 | 0.999 | 1 | 1 | 1 | 1 | 1 | 1 | 1 | 1 |
| 0.998499999999945 | 0.998 | 0.999 | 0.999 | 1 | 1 | 1 | 1 | 1 | 1 | 1 | 1 | 1 |
| 0.998999999999945 | 0.999 | 0.999 | 1 | 1 | 1 | 1 | 1 | 1 | 1 | 1 | 1 | 1 |
| 0.999499999999945 | 0.999 | 1 | 1 | 1 | 1 | 1 | 1 | 1 | 1 | 1 | 1 | 1 |
| 0.999999999999945 | 1 | 1 | 1 | 1 | 1 | 1 | 1 | 1 | 1 | 1 | 1 | 1 |